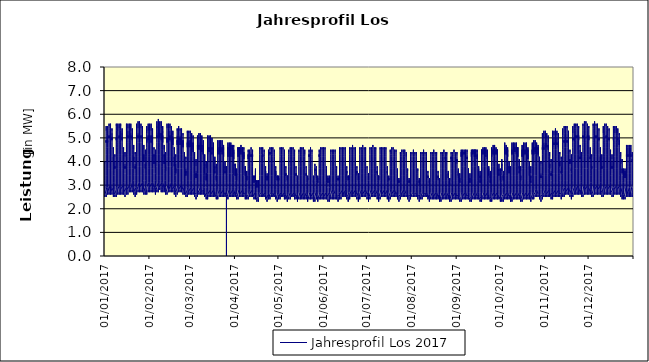
| Category | Jahresprofil Los 2017 |
|---|---|
| 01/01/2017 | 2.9 |
| 01/01/2017 | 2.8 |
| 01/01/2017 | 2.7 |
| 01/01/2017 | 2.6 |
| 01/01/2017 | 2.6 |
| 01/01/2017 | 2.5 |
| 01/01/2017 | 2.5 |
| 01/01/2017 | 2.6 |
| 01/01/2017 | 2.6 |
| 01/01/2017 | 2.8 |
| 01/01/2017 | 2.9 |
| 01/01/2017 | 3.2 |
| 01/01/2017 | 3.3 |
| 01/01/2017 | 3.3 |
| 01/01/2017 | 3.3 |
| 01/01/2017 | 3.3 |
| 01/01/2017 | 3.7 |
| 01/01/2017 | 3.9 |
| 01/01/2017 | 4 |
| 01/01/2017 | 3.9 |
| 01/01/2017 | 3.6 |
| 01/01/2017 | 3.4 |
| 01/01/2017 | 3.2 |
| 01/01/2017 | 3 |
| 02/01/2017 | 2.8 |
| 02/01/2017 | 2.6 |
| 02/01/2017 | 2.5 |
| 02/01/2017 | 2.5 |
| 02/01/2017 | 2.6 |
| 02/01/2017 | 2.8 |
| 02/01/2017 | 3.4 |
| 02/01/2017 | 3.9 |
| 02/01/2017 | 4.3 |
| 02/01/2017 | 4.6 |
| 02/01/2017 | 4.8 |
| 02/01/2017 | 4.8 |
| 02/01/2017 | 4.9 |
| 02/01/2017 | 4.8 |
| 02/01/2017 | 4.8 |
| 02/01/2017 | 4.9 |
| 02/01/2017 | 5.2 |
| 02/01/2017 | 5.5 |
| 02/01/2017 | 5.3 |
| 02/01/2017 | 5.1 |
| 02/01/2017 | 4.5 |
| 02/01/2017 | 4 |
| 02/01/2017 | 3.6 |
| 02/01/2017 | 3.3 |
| 03/01/2017 | 2.9 |
| 03/01/2017 | 2.7 |
| 03/01/2017 | 2.6 |
| 03/01/2017 | 2.6 |
| 03/01/2017 | 2.7 |
| 03/01/2017 | 2.9 |
| 03/01/2017 | 3.4 |
| 03/01/2017 | 4 |
| 03/01/2017 | 4.4 |
| 03/01/2017 | 4.6 |
| 03/01/2017 | 4.8 |
| 03/01/2017 | 4.9 |
| 03/01/2017 | 4.9 |
| 03/01/2017 | 4.9 |
| 03/01/2017 | 4.8 |
| 03/01/2017 | 4.9 |
| 03/01/2017 | 5.3 |
| 03/01/2017 | 5.5 |
| 03/01/2017 | 5.4 |
| 03/01/2017 | 5.2 |
| 03/01/2017 | 4.6 |
| 03/01/2017 | 4 |
| 03/01/2017 | 3.7 |
| 03/01/2017 | 3.3 |
| 04/01/2017 | 3 |
| 04/01/2017 | 2.7 |
| 04/01/2017 | 2.6 |
| 04/01/2017 | 2.6 |
| 04/01/2017 | 2.7 |
| 04/01/2017 | 3 |
| 04/01/2017 | 3.6 |
| 04/01/2017 | 4.3 |
| 04/01/2017 | 4.6 |
| 04/01/2017 | 4.8 |
| 04/01/2017 | 4.9 |
| 04/01/2017 | 5 |
| 04/01/2017 | 5.1 |
| 04/01/2017 | 5 |
| 04/01/2017 | 5 |
| 04/01/2017 | 5.1 |
| 04/01/2017 | 5.4 |
| 04/01/2017 | 5.6 |
| 04/01/2017 | 5.5 |
| 04/01/2017 | 5.3 |
| 04/01/2017 | 4.7 |
| 04/01/2017 | 4.1 |
| 04/01/2017 | 3.7 |
| 04/01/2017 | 3.3 |
| 05/01/2017 | 3 |
| 05/01/2017 | 2.7 |
| 05/01/2017 | 2.6 |
| 05/01/2017 | 2.6 |
| 05/01/2017 | 2.7 |
| 05/01/2017 | 3 |
| 05/01/2017 | 3.6 |
| 05/01/2017 | 4.2 |
| 05/01/2017 | 4.6 |
| 05/01/2017 | 4.8 |
| 05/01/2017 | 4.9 |
| 05/01/2017 | 5 |
| 05/01/2017 | 5 |
| 05/01/2017 | 5 |
| 05/01/2017 | 5 |
| 05/01/2017 | 5 |
| 05/01/2017 | 5.4 |
| 05/01/2017 | 5.6 |
| 05/01/2017 | 5.5 |
| 05/01/2017 | 5.3 |
| 05/01/2017 | 4.7 |
| 05/01/2017 | 4.1 |
| 05/01/2017 | 3.7 |
| 05/01/2017 | 3.3 |
| 06/01/2017 | 3 |
| 06/01/2017 | 2.7 |
| 06/01/2017 | 2.6 |
| 06/01/2017 | 2.6 |
| 06/01/2017 | 2.7 |
| 06/01/2017 | 3 |
| 06/01/2017 | 3.6 |
| 06/01/2017 | 4.2 |
| 06/01/2017 | 4.6 |
| 06/01/2017 | 4.8 |
| 06/01/2017 | 4.9 |
| 06/01/2017 | 5 |
| 06/01/2017 | 5 |
| 06/01/2017 | 4.9 |
| 06/01/2017 | 4.9 |
| 06/01/2017 | 4.9 |
| 06/01/2017 | 5.2 |
| 06/01/2017 | 5.4 |
| 06/01/2017 | 5.3 |
| 06/01/2017 | 5.1 |
| 06/01/2017 | 4.5 |
| 06/01/2017 | 4 |
| 06/01/2017 | 3.6 |
| 06/01/2017 | 3.3 |
| 07/01/2017 | 2.9 |
| 07/01/2017 | 2.7 |
| 07/01/2017 | 2.6 |
| 07/01/2017 | 2.6 |
| 07/01/2017 | 2.5 |
| 07/01/2017 | 2.6 |
| 07/01/2017 | 2.8 |
| 07/01/2017 | 3.1 |
| 07/01/2017 | 3.4 |
| 07/01/2017 | 3.8 |
| 07/01/2017 | 4 |
| 07/01/2017 | 4.2 |
| 07/01/2017 | 4.2 |
| 07/01/2017 | 4.1 |
| 07/01/2017 | 4 |
| 07/01/2017 | 4.1 |
| 07/01/2017 | 4.3 |
| 07/01/2017 | 4.6 |
| 07/01/2017 | 4.6 |
| 07/01/2017 | 4.5 |
| 07/01/2017 | 4 |
| 07/01/2017 | 3.6 |
| 07/01/2017 | 3.4 |
| 07/01/2017 | 3.1 |
| 08/01/2017 | 2.8 |
| 08/01/2017 | 2.6 |
| 08/01/2017 | 2.5 |
| 08/01/2017 | 2.5 |
| 08/01/2017 | 2.5 |
| 08/01/2017 | 2.5 |
| 08/01/2017 | 2.6 |
| 08/01/2017 | 2.8 |
| 08/01/2017 | 3 |
| 08/01/2017 | 3.3 |
| 08/01/2017 | 3.5 |
| 08/01/2017 | 3.7 |
| 08/01/2017 | 3.8 |
| 08/01/2017 | 3.7 |
| 08/01/2017 | 3.7 |
| 08/01/2017 | 3.7 |
| 08/01/2017 | 4 |
| 08/01/2017 | 4.3 |
| 08/01/2017 | 4.3 |
| 08/01/2017 | 4.2 |
| 08/01/2017 | 3.9 |
| 08/01/2017 | 3.6 |
| 08/01/2017 | 3.4 |
| 08/01/2017 | 3.1 |
| 09/01/2017 | 2.8 |
| 09/01/2017 | 2.6 |
| 09/01/2017 | 2.6 |
| 09/01/2017 | 2.5 |
| 09/01/2017 | 2.6 |
| 09/01/2017 | 2.9 |
| 09/01/2017 | 3.6 |
| 09/01/2017 | 4.2 |
| 09/01/2017 | 4.6 |
| 09/01/2017 | 4.7 |
| 09/01/2017 | 4.9 |
| 09/01/2017 | 5 |
| 09/01/2017 | 5 |
| 09/01/2017 | 5 |
| 09/01/2017 | 4.9 |
| 09/01/2017 | 5 |
| 09/01/2017 | 5.3 |
| 09/01/2017 | 5.6 |
| 09/01/2017 | 5.5 |
| 09/01/2017 | 5.3 |
| 09/01/2017 | 4.7 |
| 09/01/2017 | 4.1 |
| 09/01/2017 | 3.7 |
| 09/01/2017 | 3.3 |
| 10/01/2017 | 3 |
| 10/01/2017 | 2.7 |
| 10/01/2017 | 2.6 |
| 10/01/2017 | 2.6 |
| 10/01/2017 | 2.7 |
| 10/01/2017 | 3 |
| 10/01/2017 | 3.6 |
| 10/01/2017 | 4.3 |
| 10/01/2017 | 4.6 |
| 10/01/2017 | 4.8 |
| 10/01/2017 | 4.9 |
| 10/01/2017 | 5 |
| 10/01/2017 | 5 |
| 10/01/2017 | 5 |
| 10/01/2017 | 5 |
| 10/01/2017 | 5 |
| 10/01/2017 | 5.4 |
| 10/01/2017 | 5.6 |
| 10/01/2017 | 5.6 |
| 10/01/2017 | 5.3 |
| 10/01/2017 | 4.7 |
| 10/01/2017 | 4.2 |
| 10/01/2017 | 3.7 |
| 10/01/2017 | 3.3 |
| 11/01/2017 | 3 |
| 11/01/2017 | 2.8 |
| 11/01/2017 | 2.7 |
| 11/01/2017 | 2.6 |
| 11/01/2017 | 2.7 |
| 11/01/2017 | 3 |
| 11/01/2017 | 3.7 |
| 11/01/2017 | 4.3 |
| 11/01/2017 | 4.7 |
| 11/01/2017 | 4.9 |
| 11/01/2017 | 5 |
| 11/01/2017 | 5.1 |
| 11/01/2017 | 5.1 |
| 11/01/2017 | 5 |
| 11/01/2017 | 5 |
| 11/01/2017 | 5.1 |
| 11/01/2017 | 5.3 |
| 11/01/2017 | 5.6 |
| 11/01/2017 | 5.6 |
| 11/01/2017 | 5.4 |
| 11/01/2017 | 4.7 |
| 11/01/2017 | 4.2 |
| 11/01/2017 | 3.8 |
| 11/01/2017 | 3.3 |
| 12/01/2017 | 3 |
| 12/01/2017 | 2.8 |
| 12/01/2017 | 2.7 |
| 12/01/2017 | 2.6 |
| 12/01/2017 | 2.7 |
| 12/01/2017 | 3 |
| 12/01/2017 | 3.6 |
| 12/01/2017 | 4.3 |
| 12/01/2017 | 4.7 |
| 12/01/2017 | 4.8 |
| 12/01/2017 | 5 |
| 12/01/2017 | 5 |
| 12/01/2017 | 5.1 |
| 12/01/2017 | 5 |
| 12/01/2017 | 5 |
| 12/01/2017 | 5 |
| 12/01/2017 | 5.3 |
| 12/01/2017 | 5.6 |
| 12/01/2017 | 5.5 |
| 12/01/2017 | 5.3 |
| 12/01/2017 | 4.7 |
| 12/01/2017 | 4.2 |
| 12/01/2017 | 3.8 |
| 12/01/2017 | 3.3 |
| 13/01/2017 | 3 |
| 13/01/2017 | 2.8 |
| 13/01/2017 | 2.7 |
| 13/01/2017 | 2.6 |
| 13/01/2017 | 2.7 |
| 13/01/2017 | 3 |
| 13/01/2017 | 3.6 |
| 13/01/2017 | 4.3 |
| 13/01/2017 | 4.6 |
| 13/01/2017 | 4.8 |
| 13/01/2017 | 5 |
| 13/01/2017 | 5 |
| 13/01/2017 | 5 |
| 13/01/2017 | 4.9 |
| 13/01/2017 | 4.9 |
| 13/01/2017 | 4.9 |
| 13/01/2017 | 5.2 |
| 13/01/2017 | 5.4 |
| 13/01/2017 | 5.4 |
| 13/01/2017 | 5.1 |
| 13/01/2017 | 4.5 |
| 13/01/2017 | 4 |
| 13/01/2017 | 3.7 |
| 13/01/2017 | 3.3 |
| 14/01/2017 | 3 |
| 14/01/2017 | 2.8 |
| 14/01/2017 | 2.7 |
| 14/01/2017 | 2.6 |
| 14/01/2017 | 2.6 |
| 14/01/2017 | 2.6 |
| 14/01/2017 | 2.8 |
| 14/01/2017 | 3.1 |
| 14/01/2017 | 3.5 |
| 14/01/2017 | 3.8 |
| 14/01/2017 | 4.1 |
| 14/01/2017 | 4.2 |
| 14/01/2017 | 4.2 |
| 14/01/2017 | 4.1 |
| 14/01/2017 | 4 |
| 14/01/2017 | 4 |
| 14/01/2017 | 4.3 |
| 14/01/2017 | 4.6 |
| 14/01/2017 | 4.6 |
| 14/01/2017 | 4.5 |
| 14/01/2017 | 4.1 |
| 14/01/2017 | 3.7 |
| 14/01/2017 | 3.4 |
| 14/01/2017 | 3.1 |
| 15/01/2017 | 2.9 |
| 15/01/2017 | 2.7 |
| 15/01/2017 | 2.6 |
| 15/01/2017 | 2.5 |
| 15/01/2017 | 2.5 |
| 15/01/2017 | 2.5 |
| 15/01/2017 | 2.6 |
| 15/01/2017 | 2.8 |
| 15/01/2017 | 3.1 |
| 15/01/2017 | 3.3 |
| 15/01/2017 | 3.5 |
| 15/01/2017 | 3.7 |
| 15/01/2017 | 3.8 |
| 15/01/2017 | 3.7 |
| 15/01/2017 | 3.7 |
| 15/01/2017 | 3.7 |
| 15/01/2017 | 3.9 |
| 15/01/2017 | 4.3 |
| 15/01/2017 | 4.4 |
| 15/01/2017 | 4.2 |
| 15/01/2017 | 3.9 |
| 15/01/2017 | 3.6 |
| 15/01/2017 | 3.5 |
| 15/01/2017 | 3.2 |
| 16/01/2017 | 2.9 |
| 16/01/2017 | 2.7 |
| 16/01/2017 | 2.6 |
| 16/01/2017 | 2.6 |
| 16/01/2017 | 2.7 |
| 16/01/2017 | 3 |
| 16/01/2017 | 3.6 |
| 16/01/2017 | 4.3 |
| 16/01/2017 | 4.6 |
| 16/01/2017 | 4.8 |
| 16/01/2017 | 4.9 |
| 16/01/2017 | 5 |
| 16/01/2017 | 5 |
| 16/01/2017 | 5 |
| 16/01/2017 | 5 |
| 16/01/2017 | 5 |
| 16/01/2017 | 5.2 |
| 16/01/2017 | 5.6 |
| 16/01/2017 | 5.6 |
| 16/01/2017 | 5.3 |
| 16/01/2017 | 4.7 |
| 16/01/2017 | 4.2 |
| 16/01/2017 | 3.8 |
| 16/01/2017 | 3.3 |
| 17/01/2017 | 3 |
| 17/01/2017 | 2.8 |
| 17/01/2017 | 2.7 |
| 17/01/2017 | 2.6 |
| 17/01/2017 | 2.7 |
| 17/01/2017 | 3 |
| 17/01/2017 | 3.7 |
| 17/01/2017 | 4.3 |
| 17/01/2017 | 4.7 |
| 17/01/2017 | 4.9 |
| 17/01/2017 | 5 |
| 17/01/2017 | 5.1 |
| 17/01/2017 | 5.1 |
| 17/01/2017 | 5 |
| 17/01/2017 | 5 |
| 17/01/2017 | 5 |
| 17/01/2017 | 5.3 |
| 17/01/2017 | 5.6 |
| 17/01/2017 | 5.6 |
| 17/01/2017 | 5.4 |
| 17/01/2017 | 4.8 |
| 17/01/2017 | 4.2 |
| 17/01/2017 | 3.8 |
| 17/01/2017 | 3.4 |
| 18/01/2017 | 3 |
| 18/01/2017 | 2.8 |
| 18/01/2017 | 2.7 |
| 18/01/2017 | 2.7 |
| 18/01/2017 | 2.8 |
| 18/01/2017 | 3.1 |
| 18/01/2017 | 3.7 |
| 18/01/2017 | 4.4 |
| 18/01/2017 | 4.7 |
| 18/01/2017 | 4.9 |
| 18/01/2017 | 5 |
| 18/01/2017 | 5.1 |
| 18/01/2017 | 5.1 |
| 18/01/2017 | 5.1 |
| 18/01/2017 | 5 |
| 18/01/2017 | 5 |
| 18/01/2017 | 5.3 |
| 18/01/2017 | 5.6 |
| 18/01/2017 | 5.6 |
| 18/01/2017 | 5.4 |
| 18/01/2017 | 4.8 |
| 18/01/2017 | 4.2 |
| 18/01/2017 | 3.8 |
| 18/01/2017 | 3.4 |
| 19/01/2017 | 3 |
| 19/01/2017 | 2.8 |
| 19/01/2017 | 2.7 |
| 19/01/2017 | 2.7 |
| 19/01/2017 | 2.8 |
| 19/01/2017 | 3.1 |
| 19/01/2017 | 3.7 |
| 19/01/2017 | 4.4 |
| 19/01/2017 | 4.7 |
| 19/01/2017 | 4.9 |
| 19/01/2017 | 5 |
| 19/01/2017 | 5.1 |
| 19/01/2017 | 5.1 |
| 19/01/2017 | 5 |
| 19/01/2017 | 5 |
| 19/01/2017 | 5 |
| 19/01/2017 | 5.2 |
| 19/01/2017 | 5.6 |
| 19/01/2017 | 5.6 |
| 19/01/2017 | 5.3 |
| 19/01/2017 | 4.7 |
| 19/01/2017 | 4.2 |
| 19/01/2017 | 3.8 |
| 19/01/2017 | 3.4 |
| 20/01/2017 | 3.1 |
| 20/01/2017 | 2.8 |
| 20/01/2017 | 2.7 |
| 20/01/2017 | 2.7 |
| 20/01/2017 | 2.8 |
| 20/01/2017 | 3 |
| 20/01/2017 | 3.7 |
| 20/01/2017 | 4.3 |
| 20/01/2017 | 4.7 |
| 20/01/2017 | 4.9 |
| 20/01/2017 | 5 |
| 20/01/2017 | 5.1 |
| 20/01/2017 | 5.1 |
| 20/01/2017 | 5 |
| 20/01/2017 | 4.9 |
| 20/01/2017 | 4.9 |
| 20/01/2017 | 5.1 |
| 20/01/2017 | 5.4 |
| 20/01/2017 | 5.4 |
| 20/01/2017 | 5.1 |
| 20/01/2017 | 4.5 |
| 20/01/2017 | 4 |
| 20/01/2017 | 3.7 |
| 20/01/2017 | 3.3 |
| 21/01/2017 | 3 |
| 21/01/2017 | 2.8 |
| 21/01/2017 | 2.7 |
| 21/01/2017 | 2.6 |
| 21/01/2017 | 2.6 |
| 21/01/2017 | 2.7 |
| 21/01/2017 | 2.9 |
| 21/01/2017 | 3.2 |
| 21/01/2017 | 3.5 |
| 21/01/2017 | 3.9 |
| 21/01/2017 | 4.1 |
| 21/01/2017 | 4.2 |
| 21/01/2017 | 4.2 |
| 21/01/2017 | 4.1 |
| 21/01/2017 | 4 |
| 21/01/2017 | 4 |
| 21/01/2017 | 4.2 |
| 21/01/2017 | 4.6 |
| 21/01/2017 | 4.7 |
| 21/01/2017 | 4.5 |
| 21/01/2017 | 4.1 |
| 21/01/2017 | 3.7 |
| 21/01/2017 | 3.4 |
| 21/01/2017 | 3.2 |
| 22/01/2017 | 2.9 |
| 22/01/2017 | 2.7 |
| 22/01/2017 | 2.6 |
| 22/01/2017 | 2.6 |
| 22/01/2017 | 2.5 |
| 22/01/2017 | 2.5 |
| 22/01/2017 | 2.7 |
| 22/01/2017 | 2.9 |
| 22/01/2017 | 3.1 |
| 22/01/2017 | 3.4 |
| 22/01/2017 | 3.6 |
| 22/01/2017 | 3.8 |
| 22/01/2017 | 3.8 |
| 22/01/2017 | 3.7 |
| 22/01/2017 | 3.7 |
| 22/01/2017 | 3.7 |
| 22/01/2017 | 3.9 |
| 22/01/2017 | 4.2 |
| 22/01/2017 | 4.4 |
| 22/01/2017 | 4.3 |
| 22/01/2017 | 3.9 |
| 22/01/2017 | 3.7 |
| 22/01/2017 | 3.5 |
| 22/01/2017 | 3.2 |
| 23/01/2017 | 2.9 |
| 23/01/2017 | 2.7 |
| 23/01/2017 | 2.6 |
| 23/01/2017 | 2.6 |
| 23/01/2017 | 2.7 |
| 23/01/2017 | 3 |
| 23/01/2017 | 3.7 |
| 23/01/2017 | 4.3 |
| 23/01/2017 | 4.7 |
| 23/01/2017 | 4.9 |
| 23/01/2017 | 5 |
| 23/01/2017 | 5.1 |
| 23/01/2017 | 5.1 |
| 23/01/2017 | 5 |
| 23/01/2017 | 5 |
| 23/01/2017 | 5 |
| 23/01/2017 | 5.1 |
| 23/01/2017 | 5.5 |
| 23/01/2017 | 5.6 |
| 23/01/2017 | 5.4 |
| 23/01/2017 | 4.7 |
| 23/01/2017 | 4.2 |
| 23/01/2017 | 3.8 |
| 23/01/2017 | 3.4 |
| 24/01/2017 | 3 |
| 24/01/2017 | 2.8 |
| 24/01/2017 | 2.7 |
| 24/01/2017 | 2.7 |
| 24/01/2017 | 2.8 |
| 24/01/2017 | 3.1 |
| 24/01/2017 | 3.8 |
| 24/01/2017 | 4.4 |
| 24/01/2017 | 4.8 |
| 24/01/2017 | 4.9 |
| 24/01/2017 | 5.1 |
| 24/01/2017 | 5.1 |
| 24/01/2017 | 5.1 |
| 24/01/2017 | 5 |
| 24/01/2017 | 5 |
| 24/01/2017 | 5 |
| 24/01/2017 | 5.2 |
| 24/01/2017 | 5.6 |
| 24/01/2017 | 5.7 |
| 24/01/2017 | 5.4 |
| 24/01/2017 | 4.8 |
| 24/01/2017 | 4.2 |
| 24/01/2017 | 3.8 |
| 24/01/2017 | 3.4 |
| 25/01/2017 | 3.1 |
| 25/01/2017 | 2.8 |
| 25/01/2017 | 2.7 |
| 25/01/2017 | 2.7 |
| 25/01/2017 | 2.8 |
| 25/01/2017 | 3.1 |
| 25/01/2017 | 3.8 |
| 25/01/2017 | 4.5 |
| 25/01/2017 | 4.8 |
| 25/01/2017 | 5 |
| 25/01/2017 | 5.1 |
| 25/01/2017 | 5.2 |
| 25/01/2017 | 5.2 |
| 25/01/2017 | 5.1 |
| 25/01/2017 | 5 |
| 25/01/2017 | 5 |
| 25/01/2017 | 5.2 |
| 25/01/2017 | 5.6 |
| 25/01/2017 | 5.7 |
| 25/01/2017 | 5.4 |
| 25/01/2017 | 4.8 |
| 25/01/2017 | 4.2 |
| 25/01/2017 | 3.8 |
| 25/01/2017 | 3.4 |
| 26/01/2017 | 3.1 |
| 26/01/2017 | 2.9 |
| 26/01/2017 | 2.7 |
| 26/01/2017 | 2.7 |
| 26/01/2017 | 2.8 |
| 26/01/2017 | 3.1 |
| 26/01/2017 | 3.8 |
| 26/01/2017 | 4.4 |
| 26/01/2017 | 4.8 |
| 26/01/2017 | 5 |
| 26/01/2017 | 5.1 |
| 26/01/2017 | 5.1 |
| 26/01/2017 | 5.1 |
| 26/01/2017 | 5 |
| 26/01/2017 | 5 |
| 26/01/2017 | 5 |
| 26/01/2017 | 5.1 |
| 26/01/2017 | 5.5 |
| 26/01/2017 | 5.6 |
| 26/01/2017 | 5.4 |
| 26/01/2017 | 4.8 |
| 26/01/2017 | 4.2 |
| 26/01/2017 | 3.8 |
| 26/01/2017 | 3.4 |
| 27/01/2017 | 3.1 |
| 27/01/2017 | 2.9 |
| 27/01/2017 | 2.7 |
| 27/01/2017 | 2.7 |
| 27/01/2017 | 2.8 |
| 27/01/2017 | 3.1 |
| 27/01/2017 | 3.8 |
| 27/01/2017 | 4.4 |
| 27/01/2017 | 4.8 |
| 27/01/2017 | 5 |
| 27/01/2017 | 5.1 |
| 27/01/2017 | 5.1 |
| 27/01/2017 | 5.1 |
| 27/01/2017 | 5 |
| 27/01/2017 | 4.9 |
| 27/01/2017 | 4.9 |
| 27/01/2017 | 5 |
| 27/01/2017 | 5.4 |
| 27/01/2017 | 5.5 |
| 27/01/2017 | 5.2 |
| 27/01/2017 | 4.6 |
| 27/01/2017 | 4.1 |
| 27/01/2017 | 3.7 |
| 27/01/2017 | 3.4 |
| 28/01/2017 | 3.1 |
| 28/01/2017 | 2.8 |
| 28/01/2017 | 2.7 |
| 28/01/2017 | 2.7 |
| 28/01/2017 | 2.6 |
| 28/01/2017 | 2.7 |
| 28/01/2017 | 2.9 |
| 28/01/2017 | 3.2 |
| 28/01/2017 | 3.6 |
| 28/01/2017 | 3.9 |
| 28/01/2017 | 4.2 |
| 28/01/2017 | 4.3 |
| 28/01/2017 | 4.3 |
| 28/01/2017 | 4.1 |
| 28/01/2017 | 4 |
| 28/01/2017 | 4 |
| 28/01/2017 | 4.1 |
| 28/01/2017 | 4.6 |
| 28/01/2017 | 4.7 |
| 28/01/2017 | 4.5 |
| 28/01/2017 | 4.1 |
| 28/01/2017 | 3.7 |
| 28/01/2017 | 3.5 |
| 28/01/2017 | 3.2 |
| 29/01/2017 | 2.9 |
| 29/01/2017 | 2.7 |
| 29/01/2017 | 2.6 |
| 29/01/2017 | 2.6 |
| 29/01/2017 | 2.6 |
| 29/01/2017 | 2.6 |
| 29/01/2017 | 2.7 |
| 29/01/2017 | 2.9 |
| 29/01/2017 | 3.2 |
| 29/01/2017 | 3.4 |
| 29/01/2017 | 3.6 |
| 29/01/2017 | 3.8 |
| 29/01/2017 | 3.9 |
| 29/01/2017 | 3.8 |
| 29/01/2017 | 3.7 |
| 29/01/2017 | 3.7 |
| 29/01/2017 | 3.8 |
| 29/01/2017 | 4.2 |
| 29/01/2017 | 4.5 |
| 29/01/2017 | 4.3 |
| 29/01/2017 | 4 |
| 29/01/2017 | 3.7 |
| 29/01/2017 | 3.5 |
| 29/01/2017 | 3.2 |
| 30/01/2017 | 3 |
| 30/01/2017 | 2.7 |
| 30/01/2017 | 2.6 |
| 30/01/2017 | 2.6 |
| 30/01/2017 | 2.7 |
| 30/01/2017 | 3 |
| 30/01/2017 | 3.6 |
| 30/01/2017 | 4.2 |
| 30/01/2017 | 4.6 |
| 30/01/2017 | 4.8 |
| 30/01/2017 | 5 |
| 30/01/2017 | 5 |
| 30/01/2017 | 5 |
| 30/01/2017 | 4.9 |
| 30/01/2017 | 4.9 |
| 30/01/2017 | 4.8 |
| 30/01/2017 | 4.9 |
| 30/01/2017 | 5.4 |
| 30/01/2017 | 5.5 |
| 30/01/2017 | 5.2 |
| 30/01/2017 | 4.6 |
| 30/01/2017 | 4.1 |
| 30/01/2017 | 3.8 |
| 30/01/2017 | 3.4 |
| 31/01/2017 | 3.1 |
| 31/01/2017 | 2.9 |
| 31/01/2017 | 2.7 |
| 31/01/2017 | 2.7 |
| 31/01/2017 | 2.8 |
| 31/01/2017 | 3.1 |
| 31/01/2017 | 3.7 |
| 31/01/2017 | 4.3 |
| 31/01/2017 | 4.7 |
| 31/01/2017 | 4.9 |
| 31/01/2017 | 5 |
| 31/01/2017 | 5.1 |
| 31/01/2017 | 5 |
| 31/01/2017 | 5 |
| 31/01/2017 | 4.9 |
| 31/01/2017 | 4.9 |
| 31/01/2017 | 5 |
| 31/01/2017 | 5.5 |
| 31/01/2017 | 5.6 |
| 31/01/2017 | 5.3 |
| 31/01/2017 | 4.7 |
| 31/01/2017 | 4.2 |
| 31/01/2017 | 3.8 |
| 31/01/2017 | 3.4 |
| 01/02/2017 | 3.1 |
| 01/02/2017 | 2.9 |
| 01/02/2017 | 2.8 |
| 01/02/2017 | 2.7 |
| 01/02/2017 | 2.8 |
| 01/02/2017 | 3.1 |
| 01/02/2017 | 3.7 |
| 01/02/2017 | 4.3 |
| 01/02/2017 | 4.7 |
| 01/02/2017 | 4.9 |
| 01/02/2017 | 5.1 |
| 01/02/2017 | 5.1 |
| 01/02/2017 | 5.1 |
| 01/02/2017 | 5 |
| 01/02/2017 | 4.9 |
| 01/02/2017 | 4.9 |
| 01/02/2017 | 5 |
| 01/02/2017 | 5.5 |
| 01/02/2017 | 5.6 |
| 01/02/2017 | 5.3 |
| 01/02/2017 | 4.7 |
| 01/02/2017 | 4.2 |
| 01/02/2017 | 3.8 |
| 01/02/2017 | 3.4 |
| 02/02/2017 | 3.1 |
| 02/02/2017 | 2.9 |
| 02/02/2017 | 2.8 |
| 02/02/2017 | 2.7 |
| 02/02/2017 | 2.8 |
| 02/02/2017 | 3.1 |
| 02/02/2017 | 3.7 |
| 02/02/2017 | 4.3 |
| 02/02/2017 | 4.7 |
| 02/02/2017 | 4.9 |
| 02/02/2017 | 5.1 |
| 02/02/2017 | 5.1 |
| 02/02/2017 | 5.1 |
| 02/02/2017 | 5 |
| 02/02/2017 | 4.9 |
| 02/02/2017 | 4.8 |
| 02/02/2017 | 4.9 |
| 02/02/2017 | 5.4 |
| 02/02/2017 | 5.6 |
| 02/02/2017 | 5.3 |
| 02/02/2017 | 4.7 |
| 02/02/2017 | 4.2 |
| 02/02/2017 | 3.8 |
| 02/02/2017 | 3.4 |
| 03/02/2017 | 3.1 |
| 03/02/2017 | 2.9 |
| 03/02/2017 | 2.8 |
| 03/02/2017 | 2.7 |
| 03/02/2017 | 2.8 |
| 03/02/2017 | 3.1 |
| 03/02/2017 | 3.7 |
| 03/02/2017 | 4.3 |
| 03/02/2017 | 4.7 |
| 03/02/2017 | 4.9 |
| 03/02/2017 | 5.1 |
| 03/02/2017 | 5.1 |
| 03/02/2017 | 5.1 |
| 03/02/2017 | 4.9 |
| 03/02/2017 | 4.8 |
| 03/02/2017 | 4.7 |
| 03/02/2017 | 4.8 |
| 03/02/2017 | 5.3 |
| 03/02/2017 | 5.4 |
| 03/02/2017 | 5.1 |
| 03/02/2017 | 4.5 |
| 03/02/2017 | 4 |
| 03/02/2017 | 3.7 |
| 03/02/2017 | 3.4 |
| 04/02/2017 | 3.1 |
| 04/02/2017 | 2.9 |
| 04/02/2017 | 2.8 |
| 04/02/2017 | 2.7 |
| 04/02/2017 | 2.7 |
| 04/02/2017 | 2.7 |
| 04/02/2017 | 2.9 |
| 04/02/2017 | 3.1 |
| 04/02/2017 | 3.5 |
| 04/02/2017 | 3.9 |
| 04/02/2017 | 4.2 |
| 04/02/2017 | 4.3 |
| 04/02/2017 | 4.2 |
| 04/02/2017 | 4.1 |
| 04/02/2017 | 3.9 |
| 04/02/2017 | 3.9 |
| 04/02/2017 | 4 |
| 04/02/2017 | 4.4 |
| 04/02/2017 | 4.6 |
| 04/02/2017 | 4.5 |
| 04/02/2017 | 4 |
| 04/02/2017 | 3.7 |
| 04/02/2017 | 3.5 |
| 04/02/2017 | 3.2 |
| 05/02/2017 | 3 |
| 05/02/2017 | 2.8 |
| 05/02/2017 | 2.7 |
| 05/02/2017 | 2.6 |
| 05/02/2017 | 2.6 |
| 05/02/2017 | 2.6 |
| 05/02/2017 | 2.7 |
| 05/02/2017 | 2.9 |
| 05/02/2017 | 3.2 |
| 05/02/2017 | 3.5 |
| 05/02/2017 | 3.7 |
| 05/02/2017 | 3.8 |
| 05/02/2017 | 3.9 |
| 05/02/2017 | 3.8 |
| 05/02/2017 | 3.7 |
| 05/02/2017 | 3.7 |
| 05/02/2017 | 3.7 |
| 05/02/2017 | 4.2 |
| 05/02/2017 | 4.5 |
| 05/02/2017 | 4.3 |
| 05/02/2017 | 4 |
| 05/02/2017 | 3.7 |
| 05/02/2017 | 3.5 |
| 05/02/2017 | 3.2 |
| 06/02/2017 | 3 |
| 06/02/2017 | 2.8 |
| 06/02/2017 | 2.7 |
| 06/02/2017 | 2.7 |
| 06/02/2017 | 2.8 |
| 06/02/2017 | 3.1 |
| 06/02/2017 | 3.8 |
| 06/02/2017 | 4.5 |
| 06/02/2017 | 4.8 |
| 06/02/2017 | 5 |
| 06/02/2017 | 5.1 |
| 06/02/2017 | 5.1 |
| 06/02/2017 | 5.1 |
| 06/02/2017 | 5 |
| 06/02/2017 | 5 |
| 06/02/2017 | 5 |
| 06/02/2017 | 5 |
| 06/02/2017 | 5.5 |
| 06/02/2017 | 5.7 |
| 06/02/2017 | 5.4 |
| 06/02/2017 | 4.8 |
| 06/02/2017 | 4.3 |
| 06/02/2017 | 3.8 |
| 06/02/2017 | 3.4 |
| 07/02/2017 | 3.1 |
| 07/02/2017 | 2.9 |
| 07/02/2017 | 2.8 |
| 07/02/2017 | 2.7 |
| 07/02/2017 | 2.9 |
| 07/02/2017 | 3.2 |
| 07/02/2017 | 3.9 |
| 07/02/2017 | 4.5 |
| 07/02/2017 | 4.9 |
| 07/02/2017 | 5.1 |
| 07/02/2017 | 5.1 |
| 07/02/2017 | 5.2 |
| 07/02/2017 | 5.2 |
| 07/02/2017 | 5.1 |
| 07/02/2017 | 5 |
| 07/02/2017 | 5 |
| 07/02/2017 | 5 |
| 07/02/2017 | 5.6 |
| 07/02/2017 | 5.8 |
| 07/02/2017 | 5.5 |
| 07/02/2017 | 4.8 |
| 07/02/2017 | 4.3 |
| 07/02/2017 | 3.9 |
| 07/02/2017 | 3.4 |
| 08/02/2017 | 3.1 |
| 08/02/2017 | 2.9 |
| 08/02/2017 | 2.8 |
| 08/02/2017 | 2.8 |
| 08/02/2017 | 2.9 |
| 08/02/2017 | 3.2 |
| 08/02/2017 | 3.9 |
| 08/02/2017 | 4.6 |
| 08/02/2017 | 4.9 |
| 08/02/2017 | 5.1 |
| 08/02/2017 | 5.2 |
| 08/02/2017 | 5.2 |
| 08/02/2017 | 5.2 |
| 08/02/2017 | 5.1 |
| 08/02/2017 | 5 |
| 08/02/2017 | 5 |
| 08/02/2017 | 5 |
| 08/02/2017 | 5.5 |
| 08/02/2017 | 5.7 |
| 08/02/2017 | 5.5 |
| 08/02/2017 | 4.8 |
| 08/02/2017 | 4.3 |
| 08/02/2017 | 3.9 |
| 08/02/2017 | 3.4 |
| 09/02/2017 | 3.1 |
| 09/02/2017 | 2.9 |
| 09/02/2017 | 2.8 |
| 09/02/2017 | 2.7 |
| 09/02/2017 | 2.8 |
| 09/02/2017 | 3.2 |
| 09/02/2017 | 3.9 |
| 09/02/2017 | 4.5 |
| 09/02/2017 | 4.9 |
| 09/02/2017 | 5 |
| 09/02/2017 | 5.1 |
| 09/02/2017 | 5.2 |
| 09/02/2017 | 5.1 |
| 09/02/2017 | 5 |
| 09/02/2017 | 5 |
| 09/02/2017 | 4.9 |
| 09/02/2017 | 5 |
| 09/02/2017 | 5.5 |
| 09/02/2017 | 5.7 |
| 09/02/2017 | 5.4 |
| 09/02/2017 | 4.8 |
| 09/02/2017 | 4.2 |
| 09/02/2017 | 3.8 |
| 09/02/2017 | 3.4 |
| 10/02/2017 | 3.1 |
| 10/02/2017 | 2.9 |
| 10/02/2017 | 2.8 |
| 10/02/2017 | 2.7 |
| 10/02/2017 | 2.8 |
| 10/02/2017 | 3.1 |
| 10/02/2017 | 3.8 |
| 10/02/2017 | 4.5 |
| 10/02/2017 | 4.8 |
| 10/02/2017 | 5 |
| 10/02/2017 | 5.1 |
| 10/02/2017 | 5.1 |
| 10/02/2017 | 5.1 |
| 10/02/2017 | 5 |
| 10/02/2017 | 4.9 |
| 10/02/2017 | 4.8 |
| 10/02/2017 | 4.8 |
| 10/02/2017 | 5.3 |
| 10/02/2017 | 5.5 |
| 10/02/2017 | 5.2 |
| 10/02/2017 | 4.6 |
| 10/02/2017 | 4.1 |
| 10/02/2017 | 3.7 |
| 10/02/2017 | 3.4 |
| 11/02/2017 | 3.1 |
| 11/02/2017 | 2.9 |
| 11/02/2017 | 2.7 |
| 11/02/2017 | 2.7 |
| 11/02/2017 | 2.7 |
| 11/02/2017 | 2.7 |
| 11/02/2017 | 3 |
| 11/02/2017 | 3.3 |
| 11/02/2017 | 3.6 |
| 11/02/2017 | 4 |
| 11/02/2017 | 4.2 |
| 11/02/2017 | 4.3 |
| 11/02/2017 | 4.2 |
| 11/02/2017 | 4.1 |
| 11/02/2017 | 4 |
| 11/02/2017 | 3.9 |
| 11/02/2017 | 4 |
| 11/02/2017 | 4.4 |
| 11/02/2017 | 4.7 |
| 11/02/2017 | 4.5 |
| 11/02/2017 | 4.1 |
| 11/02/2017 | 3.7 |
| 11/02/2017 | 3.5 |
| 11/02/2017 | 3.2 |
| 12/02/2017 | 2.9 |
| 12/02/2017 | 2.7 |
| 12/02/2017 | 2.6 |
| 12/02/2017 | 2.6 |
| 12/02/2017 | 2.6 |
| 12/02/2017 | 2.6 |
| 12/02/2017 | 2.7 |
| 12/02/2017 | 2.9 |
| 12/02/2017 | 3.2 |
| 12/02/2017 | 3.4 |
| 12/02/2017 | 3.6 |
| 12/02/2017 | 3.8 |
| 12/02/2017 | 3.8 |
| 12/02/2017 | 3.7 |
| 12/02/2017 | 3.6 |
| 12/02/2017 | 3.6 |
| 12/02/2017 | 3.6 |
| 12/02/2017 | 4.1 |
| 12/02/2017 | 4.4 |
| 12/02/2017 | 4.3 |
| 12/02/2017 | 3.9 |
| 12/02/2017 | 3.7 |
| 12/02/2017 | 3.5 |
| 12/02/2017 | 3.2 |
| 13/02/2017 | 2.9 |
| 13/02/2017 | 2.7 |
| 13/02/2017 | 2.6 |
| 13/02/2017 | 2.6 |
| 13/02/2017 | 2.7 |
| 13/02/2017 | 3 |
| 13/02/2017 | 3.8 |
| 13/02/2017 | 4.4 |
| 13/02/2017 | 4.7 |
| 13/02/2017 | 4.9 |
| 13/02/2017 | 5 |
| 13/02/2017 | 5 |
| 13/02/2017 | 5 |
| 13/02/2017 | 4.9 |
| 13/02/2017 | 4.9 |
| 13/02/2017 | 4.8 |
| 13/02/2017 | 4.9 |
| 13/02/2017 | 5.3 |
| 13/02/2017 | 5.6 |
| 13/02/2017 | 5.4 |
| 13/02/2017 | 4.7 |
| 13/02/2017 | 4.2 |
| 13/02/2017 | 3.8 |
| 13/02/2017 | 3.3 |
| 14/02/2017 | 3 |
| 14/02/2017 | 2.8 |
| 14/02/2017 | 2.7 |
| 14/02/2017 | 2.7 |
| 14/02/2017 | 2.8 |
| 14/02/2017 | 3.1 |
| 14/02/2017 | 3.8 |
| 14/02/2017 | 4.4 |
| 14/02/2017 | 4.8 |
| 14/02/2017 | 5 |
| 14/02/2017 | 5 |
| 14/02/2017 | 5.1 |
| 14/02/2017 | 5 |
| 14/02/2017 | 5 |
| 14/02/2017 | 4.9 |
| 14/02/2017 | 4.8 |
| 14/02/2017 | 4.9 |
| 14/02/2017 | 5.4 |
| 14/02/2017 | 5.6 |
| 14/02/2017 | 5.4 |
| 14/02/2017 | 4.8 |
| 14/02/2017 | 4.2 |
| 14/02/2017 | 3.8 |
| 14/02/2017 | 3.4 |
| 15/02/2017 | 3.1 |
| 15/02/2017 | 2.8 |
| 15/02/2017 | 2.7 |
| 15/02/2017 | 2.7 |
| 15/02/2017 | 2.8 |
| 15/02/2017 | 3.1 |
| 15/02/2017 | 3.8 |
| 15/02/2017 | 4.4 |
| 15/02/2017 | 4.8 |
| 15/02/2017 | 5 |
| 15/02/2017 | 5.1 |
| 15/02/2017 | 5.1 |
| 15/02/2017 | 5.1 |
| 15/02/2017 | 5 |
| 15/02/2017 | 4.9 |
| 15/02/2017 | 4.9 |
| 15/02/2017 | 4.9 |
| 15/02/2017 | 5.3 |
| 15/02/2017 | 5.6 |
| 15/02/2017 | 5.4 |
| 15/02/2017 | 4.8 |
| 15/02/2017 | 4.2 |
| 15/02/2017 | 3.8 |
| 15/02/2017 | 3.4 |
| 16/02/2017 | 3.1 |
| 16/02/2017 | 2.8 |
| 16/02/2017 | 2.7 |
| 16/02/2017 | 2.7 |
| 16/02/2017 | 2.8 |
| 16/02/2017 | 3.1 |
| 16/02/2017 | 3.8 |
| 16/02/2017 | 4.4 |
| 16/02/2017 | 4.8 |
| 16/02/2017 | 4.9 |
| 16/02/2017 | 5 |
| 16/02/2017 | 5.1 |
| 16/02/2017 | 5 |
| 16/02/2017 | 4.9 |
| 16/02/2017 | 4.9 |
| 16/02/2017 | 4.8 |
| 16/02/2017 | 4.8 |
| 16/02/2017 | 5.2 |
| 16/02/2017 | 5.5 |
| 16/02/2017 | 5.3 |
| 16/02/2017 | 4.7 |
| 16/02/2017 | 4.2 |
| 16/02/2017 | 3.8 |
| 16/02/2017 | 3.3 |
| 17/02/2017 | 3 |
| 17/02/2017 | 2.8 |
| 17/02/2017 | 2.7 |
| 17/02/2017 | 2.7 |
| 17/02/2017 | 2.8 |
| 17/02/2017 | 3.1 |
| 17/02/2017 | 3.7 |
| 17/02/2017 | 4.4 |
| 17/02/2017 | 4.7 |
| 17/02/2017 | 4.9 |
| 17/02/2017 | 5 |
| 17/02/2017 | 5 |
| 17/02/2017 | 5 |
| 17/02/2017 | 4.9 |
| 17/02/2017 | 4.8 |
| 17/02/2017 | 4.7 |
| 17/02/2017 | 4.7 |
| 17/02/2017 | 5.1 |
| 17/02/2017 | 5.3 |
| 17/02/2017 | 5.1 |
| 17/02/2017 | 4.5 |
| 17/02/2017 | 4 |
| 17/02/2017 | 3.6 |
| 17/02/2017 | 3.3 |
| 18/02/2017 | 3 |
| 18/02/2017 | 2.8 |
| 18/02/2017 | 2.7 |
| 18/02/2017 | 2.6 |
| 18/02/2017 | 2.6 |
| 18/02/2017 | 2.7 |
| 18/02/2017 | 2.9 |
| 18/02/2017 | 3.2 |
| 18/02/2017 | 3.5 |
| 18/02/2017 | 3.9 |
| 18/02/2017 | 4.1 |
| 18/02/2017 | 4.2 |
| 18/02/2017 | 4.1 |
| 18/02/2017 | 4 |
| 18/02/2017 | 3.9 |
| 18/02/2017 | 3.8 |
| 18/02/2017 | 3.9 |
| 18/02/2017 | 4.2 |
| 18/02/2017 | 4.6 |
| 18/02/2017 | 4.5 |
| 18/02/2017 | 4.1 |
| 18/02/2017 | 3.6 |
| 18/02/2017 | 3.4 |
| 18/02/2017 | 3.1 |
| 19/02/2017 | 2.9 |
| 19/02/2017 | 2.7 |
| 19/02/2017 | 2.6 |
| 19/02/2017 | 2.5 |
| 19/02/2017 | 2.5 |
| 19/02/2017 | 2.6 |
| 19/02/2017 | 2.7 |
| 19/02/2017 | 2.8 |
| 19/02/2017 | 3.1 |
| 19/02/2017 | 3.4 |
| 19/02/2017 | 3.5 |
| 19/02/2017 | 3.7 |
| 19/02/2017 | 3.7 |
| 19/02/2017 | 3.6 |
| 19/02/2017 | 3.5 |
| 19/02/2017 | 3.5 |
| 19/02/2017 | 3.5 |
| 19/02/2017 | 3.9 |
| 19/02/2017 | 4.3 |
| 19/02/2017 | 4.2 |
| 19/02/2017 | 3.9 |
| 19/02/2017 | 3.6 |
| 19/02/2017 | 3.4 |
| 19/02/2017 | 3.1 |
| 20/02/2017 | 2.9 |
| 20/02/2017 | 2.7 |
| 20/02/2017 | 2.6 |
| 20/02/2017 | 2.6 |
| 20/02/2017 | 2.7 |
| 20/02/2017 | 3 |
| 20/02/2017 | 3.7 |
| 20/02/2017 | 4.3 |
| 20/02/2017 | 4.6 |
| 20/02/2017 | 4.8 |
| 20/02/2017 | 4.9 |
| 20/02/2017 | 4.9 |
| 20/02/2017 | 4.9 |
| 20/02/2017 | 4.8 |
| 20/02/2017 | 4.8 |
| 20/02/2017 | 4.7 |
| 20/02/2017 | 4.7 |
| 20/02/2017 | 5.1 |
| 20/02/2017 | 5.4 |
| 20/02/2017 | 5.3 |
| 20/02/2017 | 4.7 |
| 20/02/2017 | 4.1 |
| 20/02/2017 | 3.7 |
| 20/02/2017 | 3.3 |
| 21/02/2017 | 3 |
| 21/02/2017 | 2.8 |
| 21/02/2017 | 2.7 |
| 21/02/2017 | 2.7 |
| 21/02/2017 | 2.8 |
| 21/02/2017 | 3.1 |
| 21/02/2017 | 3.7 |
| 21/02/2017 | 4.3 |
| 21/02/2017 | 4.7 |
| 21/02/2017 | 4.8 |
| 21/02/2017 | 4.9 |
| 21/02/2017 | 5 |
| 21/02/2017 | 4.9 |
| 21/02/2017 | 4.8 |
| 21/02/2017 | 4.8 |
| 21/02/2017 | 4.7 |
| 21/02/2017 | 4.8 |
| 21/02/2017 | 5.1 |
| 21/02/2017 | 5.5 |
| 21/02/2017 | 5.3 |
| 21/02/2017 | 4.7 |
| 21/02/2017 | 4.1 |
| 21/02/2017 | 3.7 |
| 21/02/2017 | 3.3 |
| 22/02/2017 | 3 |
| 22/02/2017 | 2.8 |
| 22/02/2017 | 2.7 |
| 22/02/2017 | 2.7 |
| 22/02/2017 | 2.8 |
| 22/02/2017 | 3.1 |
| 22/02/2017 | 3.7 |
| 22/02/2017 | 4.3 |
| 22/02/2017 | 4.7 |
| 22/02/2017 | 4.9 |
| 22/02/2017 | 5 |
| 22/02/2017 | 5 |
| 22/02/2017 | 5 |
| 22/02/2017 | 4.9 |
| 22/02/2017 | 4.8 |
| 22/02/2017 | 4.7 |
| 22/02/2017 | 4.7 |
| 22/02/2017 | 5.1 |
| 22/02/2017 | 5.4 |
| 22/02/2017 | 5.3 |
| 22/02/2017 | 4.7 |
| 22/02/2017 | 4.1 |
| 22/02/2017 | 3.7 |
| 22/02/2017 | 3.3 |
| 23/02/2017 | 3 |
| 23/02/2017 | 2.8 |
| 23/02/2017 | 2.7 |
| 23/02/2017 | 2.7 |
| 23/02/2017 | 2.8 |
| 23/02/2017 | 3.1 |
| 23/02/2017 | 3.7 |
| 23/02/2017 | 4.3 |
| 23/02/2017 | 4.7 |
| 23/02/2017 | 4.8 |
| 23/02/2017 | 4.9 |
| 23/02/2017 | 4.9 |
| 23/02/2017 | 4.9 |
| 23/02/2017 | 4.8 |
| 23/02/2017 | 4.7 |
| 23/02/2017 | 4.7 |
| 23/02/2017 | 4.7 |
| 23/02/2017 | 5 |
| 23/02/2017 | 5.4 |
| 23/02/2017 | 5.3 |
| 23/02/2017 | 4.7 |
| 23/02/2017 | 4.1 |
| 23/02/2017 | 3.7 |
| 23/02/2017 | 3.3 |
| 24/02/2017 | 3 |
| 24/02/2017 | 2.8 |
| 24/02/2017 | 2.7 |
| 24/02/2017 | 2.6 |
| 24/02/2017 | 2.7 |
| 24/02/2017 | 3 |
| 24/02/2017 | 3.7 |
| 24/02/2017 | 4.3 |
| 24/02/2017 | 4.6 |
| 24/02/2017 | 4.8 |
| 24/02/2017 | 4.9 |
| 24/02/2017 | 4.9 |
| 24/02/2017 | 4.9 |
| 24/02/2017 | 4.7 |
| 24/02/2017 | 4.6 |
| 24/02/2017 | 4.6 |
| 24/02/2017 | 4.6 |
| 24/02/2017 | 4.9 |
| 24/02/2017 | 5.2 |
| 24/02/2017 | 5.1 |
| 24/02/2017 | 4.5 |
| 24/02/2017 | 3.9 |
| 24/02/2017 | 3.6 |
| 24/02/2017 | 3.2 |
| 25/02/2017 | 2.9 |
| 25/02/2017 | 2.7 |
| 25/02/2017 | 2.6 |
| 25/02/2017 | 2.6 |
| 25/02/2017 | 2.6 |
| 25/02/2017 | 2.7 |
| 25/02/2017 | 2.8 |
| 25/02/2017 | 3.1 |
| 25/02/2017 | 3.5 |
| 25/02/2017 | 3.8 |
| 25/02/2017 | 4 |
| 25/02/2017 | 4.1 |
| 25/02/2017 | 4 |
| 25/02/2017 | 3.9 |
| 25/02/2017 | 3.8 |
| 25/02/2017 | 3.7 |
| 25/02/2017 | 3.7 |
| 25/02/2017 | 4 |
| 25/02/2017 | 4.4 |
| 25/02/2017 | 4.4 |
| 25/02/2017 | 4 |
| 25/02/2017 | 3.6 |
| 25/02/2017 | 3.3 |
| 25/02/2017 | 3 |
| 26/02/2017 | 2.8 |
| 26/02/2017 | 2.6 |
| 26/02/2017 | 2.5 |
| 26/02/2017 | 2.5 |
| 26/02/2017 | 2.5 |
| 26/02/2017 | 2.5 |
| 26/02/2017 | 2.6 |
| 26/02/2017 | 2.8 |
| 26/02/2017 | 3 |
| 26/02/2017 | 3.3 |
| 26/02/2017 | 3.4 |
| 26/02/2017 | 3.6 |
| 26/02/2017 | 3.6 |
| 26/02/2017 | 3.5 |
| 26/02/2017 | 3.4 |
| 26/02/2017 | 3.4 |
| 26/02/2017 | 3.4 |
| 26/02/2017 | 3.7 |
| 26/02/2017 | 4.2 |
| 26/02/2017 | 4.1 |
| 26/02/2017 | 3.8 |
| 26/02/2017 | 3.5 |
| 26/02/2017 | 3.3 |
| 26/02/2017 | 3 |
| 27/02/2017 | 2.8 |
| 27/02/2017 | 2.6 |
| 27/02/2017 | 2.5 |
| 27/02/2017 | 2.5 |
| 27/02/2017 | 2.6 |
| 27/02/2017 | 2.9 |
| 27/02/2017 | 3.6 |
| 27/02/2017 | 4.2 |
| 27/02/2017 | 4.5 |
| 27/02/2017 | 4.7 |
| 27/02/2017 | 4.8 |
| 27/02/2017 | 4.8 |
| 27/02/2017 | 4.8 |
| 27/02/2017 | 4.7 |
| 27/02/2017 | 4.7 |
| 27/02/2017 | 4.6 |
| 27/02/2017 | 4.6 |
| 27/02/2017 | 4.9 |
| 27/02/2017 | 5.3 |
| 27/02/2017 | 5.2 |
| 27/02/2017 | 4.6 |
| 27/02/2017 | 4 |
| 27/02/2017 | 3.6 |
| 27/02/2017 | 3.2 |
| 28/02/2017 | 2.9 |
| 28/02/2017 | 2.7 |
| 28/02/2017 | 2.6 |
| 28/02/2017 | 2.6 |
| 28/02/2017 | 2.7 |
| 28/02/2017 | 3 |
| 28/02/2017 | 3.6 |
| 28/02/2017 | 4.2 |
| 28/02/2017 | 4.6 |
| 28/02/2017 | 4.7 |
| 28/02/2017 | 4.8 |
| 28/02/2017 | 4.8 |
| 28/02/2017 | 4.8 |
| 28/02/2017 | 4.7 |
| 28/02/2017 | 4.7 |
| 28/02/2017 | 4.6 |
| 28/02/2017 | 4.6 |
| 28/02/2017 | 4.9 |
| 28/02/2017 | 5.3 |
| 28/02/2017 | 5.2 |
| 28/02/2017 | 4.6 |
| 28/02/2017 | 4 |
| 28/02/2017 | 3.6 |
| 28/02/2017 | 3.2 |
| 01/03/2017 | 2.9 |
| 01/03/2017 | 2.7 |
| 01/03/2017 | 2.6 |
| 01/03/2017 | 2.6 |
| 01/03/2017 | 2.7 |
| 01/03/2017 | 3 |
| 01/03/2017 | 3.7 |
| 01/03/2017 | 4.2 |
| 01/03/2017 | 4.6 |
| 01/03/2017 | 4.8 |
| 01/03/2017 | 4.8 |
| 01/03/2017 | 4.9 |
| 01/03/2017 | 4.8 |
| 01/03/2017 | 4.8 |
| 01/03/2017 | 4.7 |
| 01/03/2017 | 4.6 |
| 01/03/2017 | 4.6 |
| 01/03/2017 | 4.9 |
| 01/03/2017 | 5.3 |
| 01/03/2017 | 5.2 |
| 01/03/2017 | 4.6 |
| 01/03/2017 | 4 |
| 01/03/2017 | 3.6 |
| 01/03/2017 | 3.2 |
| 02/03/2017 | 2.9 |
| 02/03/2017 | 2.7 |
| 02/03/2017 | 2.6 |
| 02/03/2017 | 2.6 |
| 02/03/2017 | 2.7 |
| 02/03/2017 | 3 |
| 02/03/2017 | 3.6 |
| 02/03/2017 | 4.2 |
| 02/03/2017 | 4.6 |
| 02/03/2017 | 4.7 |
| 02/03/2017 | 4.8 |
| 02/03/2017 | 4.8 |
| 02/03/2017 | 4.8 |
| 02/03/2017 | 4.7 |
| 02/03/2017 | 4.6 |
| 02/03/2017 | 4.6 |
| 02/03/2017 | 4.5 |
| 02/03/2017 | 4.8 |
| 02/03/2017 | 5.2 |
| 02/03/2017 | 5.2 |
| 02/03/2017 | 4.6 |
| 02/03/2017 | 4 |
| 02/03/2017 | 3.6 |
| 02/03/2017 | 3.2 |
| 03/03/2017 | 2.9 |
| 03/03/2017 | 2.7 |
| 03/03/2017 | 2.6 |
| 03/03/2017 | 2.6 |
| 03/03/2017 | 2.7 |
| 03/03/2017 | 3 |
| 03/03/2017 | 3.6 |
| 03/03/2017 | 4.2 |
| 03/03/2017 | 4.5 |
| 03/03/2017 | 4.7 |
| 03/03/2017 | 4.8 |
| 03/03/2017 | 4.8 |
| 03/03/2017 | 4.8 |
| 03/03/2017 | 4.6 |
| 03/03/2017 | 4.5 |
| 03/03/2017 | 4.4 |
| 03/03/2017 | 4.4 |
| 03/03/2017 | 4.7 |
| 03/03/2017 | 5.1 |
| 03/03/2017 | 5 |
| 03/03/2017 | 4.4 |
| 03/03/2017 | 3.8 |
| 03/03/2017 | 3.5 |
| 03/03/2017 | 3.1 |
| 04/03/2017 | 2.9 |
| 04/03/2017 | 2.7 |
| 04/03/2017 | 2.6 |
| 04/03/2017 | 2.5 |
| 04/03/2017 | 2.5 |
| 04/03/2017 | 2.6 |
| 04/03/2017 | 2.8 |
| 04/03/2017 | 3 |
| 04/03/2017 | 3.4 |
| 04/03/2017 | 3.7 |
| 04/03/2017 | 3.9 |
| 04/03/2017 | 4 |
| 04/03/2017 | 3.9 |
| 04/03/2017 | 3.8 |
| 04/03/2017 | 3.7 |
| 04/03/2017 | 3.6 |
| 04/03/2017 | 3.6 |
| 04/03/2017 | 3.9 |
| 04/03/2017 | 4.3 |
| 04/03/2017 | 4.4 |
| 04/03/2017 | 3.9 |
| 04/03/2017 | 3.5 |
| 04/03/2017 | 3.2 |
| 04/03/2017 | 3 |
| 05/03/2017 | 2.7 |
| 05/03/2017 | 2.6 |
| 05/03/2017 | 2.5 |
| 05/03/2017 | 2.5 |
| 05/03/2017 | 2.4 |
| 05/03/2017 | 2.5 |
| 05/03/2017 | 2.6 |
| 05/03/2017 | 2.7 |
| 05/03/2017 | 2.9 |
| 05/03/2017 | 3.2 |
| 05/03/2017 | 3.4 |
| 05/03/2017 | 3.5 |
| 05/03/2017 | 3.5 |
| 05/03/2017 | 3.4 |
| 05/03/2017 | 3.4 |
| 05/03/2017 | 3.3 |
| 05/03/2017 | 3.3 |
| 05/03/2017 | 3.6 |
| 05/03/2017 | 4 |
| 05/03/2017 | 4.1 |
| 05/03/2017 | 3.8 |
| 05/03/2017 | 3.5 |
| 05/03/2017 | 3.3 |
| 05/03/2017 | 3 |
| 06/03/2017 | 2.7 |
| 06/03/2017 | 2.6 |
| 06/03/2017 | 2.5 |
| 06/03/2017 | 2.5 |
| 06/03/2017 | 2.6 |
| 06/03/2017 | 2.9 |
| 06/03/2017 | 3.5 |
| 06/03/2017 | 4.1 |
| 06/03/2017 | 4.4 |
| 06/03/2017 | 4.6 |
| 06/03/2017 | 4.7 |
| 06/03/2017 | 4.7 |
| 06/03/2017 | 4.7 |
| 06/03/2017 | 4.6 |
| 06/03/2017 | 4.6 |
| 06/03/2017 | 4.5 |
| 06/03/2017 | 4.5 |
| 06/03/2017 | 4.7 |
| 06/03/2017 | 5.1 |
| 06/03/2017 | 5.1 |
| 06/03/2017 | 4.5 |
| 06/03/2017 | 4 |
| 06/03/2017 | 3.5 |
| 06/03/2017 | 3.1 |
| 07/03/2017 | 2.8 |
| 07/03/2017 | 2.7 |
| 07/03/2017 | 2.6 |
| 07/03/2017 | 2.6 |
| 07/03/2017 | 2.7 |
| 07/03/2017 | 3 |
| 07/03/2017 | 3.6 |
| 07/03/2017 | 4.1 |
| 07/03/2017 | 4.5 |
| 07/03/2017 | 4.6 |
| 07/03/2017 | 4.7 |
| 07/03/2017 | 4.7 |
| 07/03/2017 | 4.7 |
| 07/03/2017 | 4.6 |
| 07/03/2017 | 4.6 |
| 07/03/2017 | 4.5 |
| 07/03/2017 | 4.5 |
| 07/03/2017 | 4.7 |
| 07/03/2017 | 5.2 |
| 07/03/2017 | 5.2 |
| 07/03/2017 | 4.6 |
| 07/03/2017 | 4 |
| 07/03/2017 | 3.5 |
| 07/03/2017 | 3.1 |
| 08/03/2017 | 2.9 |
| 08/03/2017 | 2.7 |
| 08/03/2017 | 2.6 |
| 08/03/2017 | 2.6 |
| 08/03/2017 | 2.7 |
| 08/03/2017 | 3 |
| 08/03/2017 | 3.6 |
| 08/03/2017 | 4.1 |
| 08/03/2017 | 4.5 |
| 08/03/2017 | 4.7 |
| 08/03/2017 | 4.7 |
| 08/03/2017 | 4.8 |
| 08/03/2017 | 4.7 |
| 08/03/2017 | 4.7 |
| 08/03/2017 | 4.6 |
| 08/03/2017 | 4.5 |
| 08/03/2017 | 4.5 |
| 08/03/2017 | 4.7 |
| 08/03/2017 | 5.2 |
| 08/03/2017 | 5.2 |
| 08/03/2017 | 4.6 |
| 08/03/2017 | 4 |
| 08/03/2017 | 3.5 |
| 08/03/2017 | 3.1 |
| 09/03/2017 | 2.9 |
| 09/03/2017 | 2.7 |
| 09/03/2017 | 2.6 |
| 09/03/2017 | 2.6 |
| 09/03/2017 | 2.7 |
| 09/03/2017 | 3 |
| 09/03/2017 | 3.6 |
| 09/03/2017 | 4.1 |
| 09/03/2017 | 4.5 |
| 09/03/2017 | 4.6 |
| 09/03/2017 | 4.7 |
| 09/03/2017 | 4.7 |
| 09/03/2017 | 4.7 |
| 09/03/2017 | 4.6 |
| 09/03/2017 | 4.5 |
| 09/03/2017 | 4.4 |
| 09/03/2017 | 4.4 |
| 09/03/2017 | 4.6 |
| 09/03/2017 | 5.1 |
| 09/03/2017 | 5.1 |
| 09/03/2017 | 4.5 |
| 09/03/2017 | 3.9 |
| 09/03/2017 | 3.5 |
| 09/03/2017 | 3.1 |
| 10/03/2017 | 2.8 |
| 10/03/2017 | 2.7 |
| 10/03/2017 | 2.6 |
| 10/03/2017 | 2.6 |
| 10/03/2017 | 2.7 |
| 10/03/2017 | 2.9 |
| 10/03/2017 | 3.5 |
| 10/03/2017 | 4.1 |
| 10/03/2017 | 4.4 |
| 10/03/2017 | 4.6 |
| 10/03/2017 | 4.7 |
| 10/03/2017 | 4.7 |
| 10/03/2017 | 4.6 |
| 10/03/2017 | 4.5 |
| 10/03/2017 | 4.4 |
| 10/03/2017 | 4.3 |
| 10/03/2017 | 4.3 |
| 10/03/2017 | 4.5 |
| 10/03/2017 | 4.9 |
| 10/03/2017 | 4.9 |
| 10/03/2017 | 4.3 |
| 10/03/2017 | 3.8 |
| 10/03/2017 | 3.4 |
| 10/03/2017 | 3.1 |
| 11/03/2017 | 2.8 |
| 11/03/2017 | 2.6 |
| 11/03/2017 | 2.5 |
| 11/03/2017 | 2.5 |
| 11/03/2017 | 2.5 |
| 11/03/2017 | 2.6 |
| 11/03/2017 | 2.7 |
| 11/03/2017 | 2.9 |
| 11/03/2017 | 3.3 |
| 11/03/2017 | 3.6 |
| 11/03/2017 | 3.8 |
| 11/03/2017 | 3.9 |
| 11/03/2017 | 3.8 |
| 11/03/2017 | 3.7 |
| 11/03/2017 | 3.6 |
| 11/03/2017 | 3.5 |
| 11/03/2017 | 3.5 |
| 11/03/2017 | 3.7 |
| 11/03/2017 | 4.2 |
| 11/03/2017 | 4.3 |
| 11/03/2017 | 3.9 |
| 11/03/2017 | 3.4 |
| 11/03/2017 | 3.2 |
| 11/03/2017 | 2.9 |
| 12/03/2017 | 2.7 |
| 12/03/2017 | 2.5 |
| 12/03/2017 | 2.5 |
| 12/03/2017 | 2.4 |
| 12/03/2017 | 2.4 |
| 12/03/2017 | 2.4 |
| 12/03/2017 | 2.5 |
| 12/03/2017 | 2.6 |
| 12/03/2017 | 2.9 |
| 12/03/2017 | 3.1 |
| 12/03/2017 | 3.3 |
| 12/03/2017 | 3.4 |
| 12/03/2017 | 3.5 |
| 12/03/2017 | 3.4 |
| 12/03/2017 | 3.3 |
| 12/03/2017 | 3.2 |
| 12/03/2017 | 3.2 |
| 12/03/2017 | 3.4 |
| 12/03/2017 | 3.9 |
| 12/03/2017 | 4 |
| 12/03/2017 | 3.7 |
| 12/03/2017 | 3.4 |
| 12/03/2017 | 3.2 |
| 12/03/2017 | 2.9 |
| 13/03/2017 | 2.7 |
| 13/03/2017 | 2.5 |
| 13/03/2017 | 2.5 |
| 13/03/2017 | 2.4 |
| 13/03/2017 | 2.6 |
| 13/03/2017 | 2.9 |
| 13/03/2017 | 3.5 |
| 13/03/2017 | 4 |
| 13/03/2017 | 4.3 |
| 13/03/2017 | 4.5 |
| 13/03/2017 | 4.6 |
| 13/03/2017 | 4.6 |
| 13/03/2017 | 4.6 |
| 13/03/2017 | 4.5 |
| 13/03/2017 | 4.4 |
| 13/03/2017 | 4.4 |
| 13/03/2017 | 4.3 |
| 13/03/2017 | 4.5 |
| 13/03/2017 | 5 |
| 13/03/2017 | 5.1 |
| 13/03/2017 | 4.5 |
| 13/03/2017 | 3.9 |
| 13/03/2017 | 3.5 |
| 13/03/2017 | 3.1 |
| 14/03/2017 | 2.8 |
| 14/03/2017 | 2.6 |
| 14/03/2017 | 2.5 |
| 14/03/2017 | 2.5 |
| 14/03/2017 | 2.6 |
| 14/03/2017 | 2.9 |
| 14/03/2017 | 3.5 |
| 14/03/2017 | 4 |
| 14/03/2017 | 4.4 |
| 14/03/2017 | 4.5 |
| 14/03/2017 | 4.6 |
| 14/03/2017 | 4.6 |
| 14/03/2017 | 4.6 |
| 14/03/2017 | 4.5 |
| 14/03/2017 | 4.4 |
| 14/03/2017 | 4.4 |
| 14/03/2017 | 4.4 |
| 14/03/2017 | 4.5 |
| 14/03/2017 | 5 |
| 14/03/2017 | 5.1 |
| 14/03/2017 | 4.5 |
| 14/03/2017 | 3.9 |
| 14/03/2017 | 3.5 |
| 14/03/2017 | 3.1 |
| 15/03/2017 | 2.8 |
| 15/03/2017 | 2.6 |
| 15/03/2017 | 2.5 |
| 15/03/2017 | 2.5 |
| 15/03/2017 | 2.6 |
| 15/03/2017 | 2.9 |
| 15/03/2017 | 3.5 |
| 15/03/2017 | 4 |
| 15/03/2017 | 4.4 |
| 15/03/2017 | 4.6 |
| 15/03/2017 | 4.6 |
| 15/03/2017 | 4.6 |
| 15/03/2017 | 4.6 |
| 15/03/2017 | 4.5 |
| 15/03/2017 | 4.5 |
| 15/03/2017 | 4.4 |
| 15/03/2017 | 4.3 |
| 15/03/2017 | 4.5 |
| 15/03/2017 | 5 |
| 15/03/2017 | 5.1 |
| 15/03/2017 | 4.5 |
| 15/03/2017 | 3.9 |
| 15/03/2017 | 3.5 |
| 15/03/2017 | 3.1 |
| 16/03/2017 | 2.8 |
| 16/03/2017 | 2.6 |
| 16/03/2017 | 2.5 |
| 16/03/2017 | 2.5 |
| 16/03/2017 | 2.6 |
| 16/03/2017 | 2.9 |
| 16/03/2017 | 3.5 |
| 16/03/2017 | 4 |
| 16/03/2017 | 4.4 |
| 16/03/2017 | 4.5 |
| 16/03/2017 | 4.6 |
| 16/03/2017 | 4.6 |
| 16/03/2017 | 4.6 |
| 16/03/2017 | 4.5 |
| 16/03/2017 | 4.4 |
| 16/03/2017 | 4.3 |
| 16/03/2017 | 4.3 |
| 16/03/2017 | 4.4 |
| 16/03/2017 | 5 |
| 16/03/2017 | 5 |
| 16/03/2017 | 4.5 |
| 16/03/2017 | 3.9 |
| 16/03/2017 | 3.4 |
| 16/03/2017 | 3.1 |
| 17/03/2017 | 2.8 |
| 17/03/2017 | 2.6 |
| 17/03/2017 | 2.5 |
| 17/03/2017 | 2.5 |
| 17/03/2017 | 2.6 |
| 17/03/2017 | 2.9 |
| 17/03/2017 | 3.5 |
| 17/03/2017 | 4 |
| 17/03/2017 | 4.3 |
| 17/03/2017 | 4.5 |
| 17/03/2017 | 4.6 |
| 17/03/2017 | 4.6 |
| 17/03/2017 | 4.6 |
| 17/03/2017 | 4.4 |
| 17/03/2017 | 4.3 |
| 17/03/2017 | 4.2 |
| 17/03/2017 | 4.2 |
| 17/03/2017 | 4.3 |
| 17/03/2017 | 4.8 |
| 17/03/2017 | 4.8 |
| 17/03/2017 | 4.3 |
| 17/03/2017 | 3.7 |
| 17/03/2017 | 3.3 |
| 17/03/2017 | 3 |
| 18/03/2017 | 2.8 |
| 18/03/2017 | 2.6 |
| 18/03/2017 | 2.5 |
| 18/03/2017 | 2.5 |
| 18/03/2017 | 2.5 |
| 18/03/2017 | 2.5 |
| 18/03/2017 | 2.7 |
| 18/03/2017 | 2.9 |
| 18/03/2017 | 3.2 |
| 18/03/2017 | 3.6 |
| 18/03/2017 | 3.7 |
| 18/03/2017 | 3.8 |
| 18/03/2017 | 3.8 |
| 18/03/2017 | 3.7 |
| 18/03/2017 | 3.6 |
| 18/03/2017 | 3.5 |
| 18/03/2017 | 3.5 |
| 18/03/2017 | 3.6 |
| 18/03/2017 | 4.1 |
| 18/03/2017 | 4.2 |
| 18/03/2017 | 3.8 |
| 18/03/2017 | 3.4 |
| 18/03/2017 | 3.1 |
| 18/03/2017 | 2.9 |
| 19/03/2017 | 2.6 |
| 19/03/2017 | 2.5 |
| 19/03/2017 | 2.4 |
| 19/03/2017 | 2.4 |
| 19/03/2017 | 2.4 |
| 19/03/2017 | 2.4 |
| 19/03/2017 | 2.5 |
| 19/03/2017 | 2.6 |
| 19/03/2017 | 2.8 |
| 19/03/2017 | 3.1 |
| 19/03/2017 | 3.2 |
| 19/03/2017 | 3.4 |
| 19/03/2017 | 3.4 |
| 19/03/2017 | 3.3 |
| 19/03/2017 | 3.2 |
| 19/03/2017 | 3.2 |
| 19/03/2017 | 3.2 |
| 19/03/2017 | 3.4 |
| 19/03/2017 | 3.8 |
| 19/03/2017 | 3.9 |
| 19/03/2017 | 3.7 |
| 19/03/2017 | 3.4 |
| 19/03/2017 | 3.1 |
| 19/03/2017 | 2.9 |
| 20/03/2017 | 2.6 |
| 20/03/2017 | 2.5 |
| 20/03/2017 | 2.4 |
| 20/03/2017 | 2.4 |
| 20/03/2017 | 2.5 |
| 20/03/2017 | 2.8 |
| 20/03/2017 | 3.4 |
| 20/03/2017 | 3.9 |
| 20/03/2017 | 4.3 |
| 20/03/2017 | 4.4 |
| 20/03/2017 | 4.5 |
| 20/03/2017 | 4.5 |
| 20/03/2017 | 4.5 |
| 20/03/2017 | 4.5 |
| 20/03/2017 | 4.4 |
| 20/03/2017 | 4.3 |
| 20/03/2017 | 4.3 |
| 20/03/2017 | 4.4 |
| 20/03/2017 | 4.9 |
| 20/03/2017 | 4.9 |
| 20/03/2017 | 4.4 |
| 20/03/2017 | 3.8 |
| 20/03/2017 | 3.4 |
| 20/03/2017 | 3 |
| 21/03/2017 | 2.8 |
| 21/03/2017 | 2.6 |
| 21/03/2017 | 2.5 |
| 21/03/2017 | 2.5 |
| 21/03/2017 | 2.6 |
| 21/03/2017 | 2.9 |
| 21/03/2017 | 3.5 |
| 21/03/2017 | 4 |
| 21/03/2017 | 4.3 |
| 21/03/2017 | 4.5 |
| 21/03/2017 | 4.6 |
| 21/03/2017 | 4.6 |
| 21/03/2017 | 4.5 |
| 21/03/2017 | 4.5 |
| 21/03/2017 | 4.4 |
| 21/03/2017 | 4.3 |
| 21/03/2017 | 4.4 |
| 21/03/2017 | 4.5 |
| 21/03/2017 | 4.9 |
| 21/03/2017 | 4.9 |
| 21/03/2017 | 4.4 |
| 21/03/2017 | 3.9 |
| 21/03/2017 | 3.4 |
| 21/03/2017 | 3 |
| 22/03/2017 | 2.8 |
| 22/03/2017 | 2.6 |
| 22/03/2017 | 2.5 |
| 22/03/2017 | 2.5 |
| 22/03/2017 | 2.6 |
| 22/03/2017 | 2.9 |
| 22/03/2017 | 3.5 |
| 22/03/2017 | 4 |
| 22/03/2017 | 4.4 |
| 22/03/2017 | 4.5 |
| 22/03/2017 | 4.6 |
| 22/03/2017 | 4.6 |
| 22/03/2017 | 4.6 |
| 22/03/2017 | 4.5 |
| 22/03/2017 | 4.5 |
| 22/03/2017 | 4.4 |
| 22/03/2017 | 4.4 |
| 22/03/2017 | 4.5 |
| 22/03/2017 | 4.9 |
| 22/03/2017 | 4.9 |
| 22/03/2017 | 4.4 |
| 22/03/2017 | 3.9 |
| 22/03/2017 | 3.4 |
| 22/03/2017 | 3 |
| 23/03/2017 | 2.8 |
| 23/03/2017 | 2.6 |
| 23/03/2017 | 2.5 |
| 23/03/2017 | 2.5 |
| 23/03/2017 | 2.6 |
| 23/03/2017 | 2.9 |
| 23/03/2017 | 3.5 |
| 23/03/2017 | 4 |
| 23/03/2017 | 4.3 |
| 23/03/2017 | 4.5 |
| 23/03/2017 | 4.6 |
| 23/03/2017 | 4.6 |
| 23/03/2017 | 4.6 |
| 23/03/2017 | 4.5 |
| 23/03/2017 | 4.4 |
| 23/03/2017 | 4.3 |
| 23/03/2017 | 4.3 |
| 23/03/2017 | 4.5 |
| 23/03/2017 | 4.8 |
| 23/03/2017 | 4.9 |
| 23/03/2017 | 4.4 |
| 23/03/2017 | 3.9 |
| 23/03/2017 | 3.4 |
| 23/03/2017 | 3 |
| 24/03/2017 | 2.8 |
| 24/03/2017 | 2.6 |
| 24/03/2017 | 2.5 |
| 24/03/2017 | 2.5 |
| 24/03/2017 | 2.6 |
| 24/03/2017 | 2.9 |
| 24/03/2017 | 3.4 |
| 24/03/2017 | 3.9 |
| 24/03/2017 | 4.3 |
| 24/03/2017 | 4.5 |
| 24/03/2017 | 4.6 |
| 24/03/2017 | 4.6 |
| 24/03/2017 | 4.5 |
| 24/03/2017 | 4.4 |
| 24/03/2017 | 4.3 |
| 24/03/2017 | 4.2 |
| 24/03/2017 | 4.2 |
| 24/03/2017 | 4.4 |
| 24/03/2017 | 4.7 |
| 24/03/2017 | 4.7 |
| 24/03/2017 | 4.2 |
| 24/03/2017 | 3.7 |
| 24/03/2017 | 3.3 |
| 24/03/2017 | 3 |
| 25/03/2017 | 2.7 |
| 25/03/2017 | 2.6 |
| 25/03/2017 | 2.5 |
| 25/03/2017 | 2.5 |
| 25/03/2017 | 2.5 |
| 25/03/2017 | 2.5 |
| 25/03/2017 | 2.7 |
| 25/03/2017 | 2.9 |
| 25/03/2017 | 3.2 |
| 25/03/2017 | 3.5 |
| 25/03/2017 | 3.7 |
| 25/03/2017 | 3.8 |
| 25/03/2017 | 3.7 |
| 25/03/2017 | 3.6 |
| 25/03/2017 | 3.5 |
| 25/03/2017 | 3.5 |
| 25/03/2017 | 3.5 |
| 25/03/2017 | 3.6 |
| 25/03/2017 | 4 |
| 25/03/2017 | 4 |
| 25/03/2017 | 3.8 |
| 25/03/2017 | 3.4 |
| 25/03/2017 | 3.1 |
| 25/03/2017 | 2.8 |
| 26/03/2017 | 2.7 |
| 26/03/2017 | 2.5 |
| 26/03/2017 | 0 |
| 26/03/2017 | 2.4 |
| 26/03/2017 | 2.4 |
| 26/03/2017 | 2.4 |
| 26/03/2017 | 2.5 |
| 26/03/2017 | 2.6 |
| 26/03/2017 | 2.9 |
| 26/03/2017 | 3.1 |
| 26/03/2017 | 3.3 |
| 26/03/2017 | 3.4 |
| 26/03/2017 | 3.5 |
| 26/03/2017 | 3.4 |
| 26/03/2017 | 3.3 |
| 26/03/2017 | 3.2 |
| 26/03/2017 | 3.2 |
| 26/03/2017 | 3.2 |
| 26/03/2017 | 3.6 |
| 26/03/2017 | 3.8 |
| 26/03/2017 | 3.7 |
| 26/03/2017 | 3.4 |
| 26/03/2017 | 3.2 |
| 26/03/2017 | 2.9 |
| 27/03/2017 | 2.7 |
| 27/03/2017 | 2.5 |
| 27/03/2017 | 2.4 |
| 27/03/2017 | 2.4 |
| 27/03/2017 | 2.5 |
| 27/03/2017 | 2.8 |
| 27/03/2017 | 3.4 |
| 27/03/2017 | 4 |
| 27/03/2017 | 4.3 |
| 27/03/2017 | 4.5 |
| 27/03/2017 | 4.6 |
| 27/03/2017 | 4.6 |
| 27/03/2017 | 4.6 |
| 27/03/2017 | 4.5 |
| 27/03/2017 | 4.4 |
| 27/03/2017 | 4.4 |
| 27/03/2017 | 4.3 |
| 27/03/2017 | 4.2 |
| 27/03/2017 | 4.6 |
| 27/03/2017 | 4.8 |
| 27/03/2017 | 4.5 |
| 27/03/2017 | 3.9 |
| 27/03/2017 | 3.5 |
| 27/03/2017 | 3.1 |
| 28/03/2017 | 2.8 |
| 28/03/2017 | 2.6 |
| 28/03/2017 | 2.5 |
| 28/03/2017 | 2.5 |
| 28/03/2017 | 2.6 |
| 28/03/2017 | 2.9 |
| 28/03/2017 | 3.5 |
| 28/03/2017 | 4 |
| 28/03/2017 | 4.4 |
| 28/03/2017 | 4.5 |
| 28/03/2017 | 4.6 |
| 28/03/2017 | 4.7 |
| 28/03/2017 | 4.7 |
| 28/03/2017 | 4.6 |
| 28/03/2017 | 4.5 |
| 28/03/2017 | 4.4 |
| 28/03/2017 | 4.3 |
| 28/03/2017 | 4.2 |
| 28/03/2017 | 4.6 |
| 28/03/2017 | 4.8 |
| 28/03/2017 | 4.5 |
| 28/03/2017 | 4 |
| 28/03/2017 | 3.5 |
| 28/03/2017 | 3.1 |
| 29/03/2017 | 2.8 |
| 29/03/2017 | 2.6 |
| 29/03/2017 | 2.5 |
| 29/03/2017 | 2.5 |
| 29/03/2017 | 2.6 |
| 29/03/2017 | 2.9 |
| 29/03/2017 | 3.5 |
| 29/03/2017 | 4 |
| 29/03/2017 | 4.4 |
| 29/03/2017 | 4.6 |
| 29/03/2017 | 4.7 |
| 29/03/2017 | 4.7 |
| 29/03/2017 | 4.7 |
| 29/03/2017 | 4.6 |
| 29/03/2017 | 4.5 |
| 29/03/2017 | 4.4 |
| 29/03/2017 | 4.3 |
| 29/03/2017 | 4.2 |
| 29/03/2017 | 4.6 |
| 29/03/2017 | 4.8 |
| 29/03/2017 | 4.5 |
| 29/03/2017 | 4 |
| 29/03/2017 | 3.5 |
| 29/03/2017 | 3.1 |
| 30/03/2017 | 2.8 |
| 30/03/2017 | 2.6 |
| 30/03/2017 | 2.5 |
| 30/03/2017 | 2.5 |
| 30/03/2017 | 2.6 |
| 30/03/2017 | 2.9 |
| 30/03/2017 | 3.5 |
| 30/03/2017 | 4 |
| 30/03/2017 | 4.4 |
| 30/03/2017 | 4.5 |
| 30/03/2017 | 4.6 |
| 30/03/2017 | 4.7 |
| 30/03/2017 | 4.7 |
| 30/03/2017 | 4.6 |
| 30/03/2017 | 4.5 |
| 30/03/2017 | 4.4 |
| 30/03/2017 | 4.3 |
| 30/03/2017 | 4.2 |
| 30/03/2017 | 4.6 |
| 30/03/2017 | 4.7 |
| 30/03/2017 | 4.5 |
| 30/03/2017 | 3.9 |
| 30/03/2017 | 3.5 |
| 30/03/2017 | 3.1 |
| 31/03/2017 | 2.8 |
| 31/03/2017 | 2.6 |
| 31/03/2017 | 2.5 |
| 31/03/2017 | 2.5 |
| 31/03/2017 | 2.6 |
| 31/03/2017 | 2.9 |
| 31/03/2017 | 3.4 |
| 31/03/2017 | 4 |
| 31/03/2017 | 4.3 |
| 31/03/2017 | 4.5 |
| 31/03/2017 | 4.6 |
| 31/03/2017 | 4.7 |
| 31/03/2017 | 4.6 |
| 31/03/2017 | 4.5 |
| 31/03/2017 | 4.4 |
| 31/03/2017 | 4.3 |
| 31/03/2017 | 4.2 |
| 31/03/2017 | 4.1 |
| 31/03/2017 | 4.4 |
| 31/03/2017 | 4.5 |
| 31/03/2017 | 4.3 |
| 31/03/2017 | 3.8 |
| 31/03/2017 | 3.4 |
| 31/03/2017 | 3.1 |
| 01/04/2017 | 2.8 |
| 01/04/2017 | 2.6 |
| 01/04/2017 | 2.5 |
| 01/04/2017 | 2.5 |
| 01/04/2017 | 2.5 |
| 01/04/2017 | 2.5 |
| 01/04/2017 | 2.7 |
| 01/04/2017 | 2.9 |
| 01/04/2017 | 3.2 |
| 01/04/2017 | 3.6 |
| 01/04/2017 | 3.8 |
| 01/04/2017 | 3.9 |
| 01/04/2017 | 3.8 |
| 01/04/2017 | 3.7 |
| 01/04/2017 | 3.6 |
| 01/04/2017 | 3.5 |
| 01/04/2017 | 3.4 |
| 01/04/2017 | 3.4 |
| 01/04/2017 | 3.7 |
| 01/04/2017 | 3.9 |
| 01/04/2017 | 3.8 |
| 01/04/2017 | 3.5 |
| 01/04/2017 | 3.2 |
| 01/04/2017 | 2.9 |
| 02/04/2017 | 2.6 |
| 02/04/2017 | 2.5 |
| 02/04/2017 | 2.4 |
| 02/04/2017 | 2.4 |
| 02/04/2017 | 2.4 |
| 02/04/2017 | 2.4 |
| 02/04/2017 | 2.5 |
| 02/04/2017 | 2.6 |
| 02/04/2017 | 2.8 |
| 02/04/2017 | 3.1 |
| 02/04/2017 | 3.3 |
| 02/04/2017 | 3.4 |
| 02/04/2017 | 3.5 |
| 02/04/2017 | 3.4 |
| 02/04/2017 | 3.3 |
| 02/04/2017 | 3.2 |
| 02/04/2017 | 3.2 |
| 02/04/2017 | 3.2 |
| 02/04/2017 | 3.5 |
| 02/04/2017 | 3.7 |
| 02/04/2017 | 3.7 |
| 02/04/2017 | 3.4 |
| 02/04/2017 | 3.2 |
| 02/04/2017 | 2.9 |
| 03/04/2017 | 2.7 |
| 03/04/2017 | 2.5 |
| 03/04/2017 | 2.4 |
| 03/04/2017 | 2.4 |
| 03/04/2017 | 2.5 |
| 03/04/2017 | 2.8 |
| 03/04/2017 | 3.4 |
| 03/04/2017 | 3.9 |
| 03/04/2017 | 4.3 |
| 03/04/2017 | 4.4 |
| 03/04/2017 | 4.6 |
| 03/04/2017 | 4.6 |
| 03/04/2017 | 4.6 |
| 03/04/2017 | 4.5 |
| 03/04/2017 | 4.4 |
| 03/04/2017 | 4.4 |
| 03/04/2017 | 4.3 |
| 03/04/2017 | 4.2 |
| 03/04/2017 | 4.5 |
| 03/04/2017 | 4.6 |
| 03/04/2017 | 4.4 |
| 03/04/2017 | 3.9 |
| 03/04/2017 | 3.5 |
| 03/04/2017 | 3.1 |
| 04/04/2017 | 2.8 |
| 04/04/2017 | 2.6 |
| 04/04/2017 | 2.5 |
| 04/04/2017 | 2.5 |
| 04/04/2017 | 2.6 |
| 04/04/2017 | 2.9 |
| 04/04/2017 | 3.4 |
| 04/04/2017 | 4 |
| 04/04/2017 | 4.3 |
| 04/04/2017 | 4.5 |
| 04/04/2017 | 4.6 |
| 04/04/2017 | 4.6 |
| 04/04/2017 | 4.6 |
| 04/04/2017 | 4.5 |
| 04/04/2017 | 4.4 |
| 04/04/2017 | 4.4 |
| 04/04/2017 | 4.3 |
| 04/04/2017 | 4.3 |
| 04/04/2017 | 4.5 |
| 04/04/2017 | 4.6 |
| 04/04/2017 | 4.5 |
| 04/04/2017 | 4 |
| 04/04/2017 | 3.5 |
| 04/04/2017 | 3.1 |
| 05/04/2017 | 2.8 |
| 05/04/2017 | 2.6 |
| 05/04/2017 | 2.5 |
| 05/04/2017 | 2.5 |
| 05/04/2017 | 2.6 |
| 05/04/2017 | 2.9 |
| 05/04/2017 | 3.5 |
| 05/04/2017 | 4 |
| 05/04/2017 | 4.4 |
| 05/04/2017 | 4.5 |
| 05/04/2017 | 4.6 |
| 05/04/2017 | 4.7 |
| 05/04/2017 | 4.7 |
| 05/04/2017 | 4.6 |
| 05/04/2017 | 4.5 |
| 05/04/2017 | 4.4 |
| 05/04/2017 | 4.3 |
| 05/04/2017 | 4.3 |
| 05/04/2017 | 4.5 |
| 05/04/2017 | 4.6 |
| 05/04/2017 | 4.4 |
| 05/04/2017 | 4 |
| 05/04/2017 | 3.5 |
| 05/04/2017 | 3.1 |
| 06/04/2017 | 2.8 |
| 06/04/2017 | 2.6 |
| 06/04/2017 | 2.5 |
| 06/04/2017 | 2.5 |
| 06/04/2017 | 2.6 |
| 06/04/2017 | 2.9 |
| 06/04/2017 | 3.4 |
| 06/04/2017 | 4 |
| 06/04/2017 | 4.3 |
| 06/04/2017 | 4.5 |
| 06/04/2017 | 4.6 |
| 06/04/2017 | 4.6 |
| 06/04/2017 | 4.6 |
| 06/04/2017 | 4.5 |
| 06/04/2017 | 4.4 |
| 06/04/2017 | 4.4 |
| 06/04/2017 | 4.3 |
| 06/04/2017 | 4.2 |
| 06/04/2017 | 4.5 |
| 06/04/2017 | 4.6 |
| 06/04/2017 | 4.4 |
| 06/04/2017 | 3.9 |
| 06/04/2017 | 3.5 |
| 06/04/2017 | 3.1 |
| 07/04/2017 | 2.8 |
| 07/04/2017 | 2.6 |
| 07/04/2017 | 2.5 |
| 07/04/2017 | 2.5 |
| 07/04/2017 | 2.6 |
| 07/04/2017 | 2.9 |
| 07/04/2017 | 3.4 |
| 07/04/2017 | 3.9 |
| 07/04/2017 | 4.3 |
| 07/04/2017 | 4.5 |
| 07/04/2017 | 4.6 |
| 07/04/2017 | 4.6 |
| 07/04/2017 | 4.6 |
| 07/04/2017 | 4.5 |
| 07/04/2017 | 4.4 |
| 07/04/2017 | 4.3 |
| 07/04/2017 | 4.2 |
| 07/04/2017 | 4.1 |
| 07/04/2017 | 4.3 |
| 07/04/2017 | 4.4 |
| 07/04/2017 | 4.2 |
| 07/04/2017 | 3.8 |
| 07/04/2017 | 3.4 |
| 07/04/2017 | 3 |
| 08/04/2017 | 2.7 |
| 08/04/2017 | 2.6 |
| 08/04/2017 | 2.5 |
| 08/04/2017 | 2.4 |
| 08/04/2017 | 2.5 |
| 08/04/2017 | 2.5 |
| 08/04/2017 | 2.6 |
| 08/04/2017 | 2.9 |
| 08/04/2017 | 3.2 |
| 08/04/2017 | 3.5 |
| 08/04/2017 | 3.8 |
| 08/04/2017 | 3.8 |
| 08/04/2017 | 3.8 |
| 08/04/2017 | 3.7 |
| 08/04/2017 | 3.6 |
| 08/04/2017 | 3.5 |
| 08/04/2017 | 3.4 |
| 08/04/2017 | 3.4 |
| 08/04/2017 | 3.6 |
| 08/04/2017 | 3.8 |
| 08/04/2017 | 3.8 |
| 08/04/2017 | 3.5 |
| 08/04/2017 | 3.1 |
| 08/04/2017 | 2.9 |
| 09/04/2017 | 2.6 |
| 09/04/2017 | 2.5 |
| 09/04/2017 | 2.4 |
| 09/04/2017 | 2.4 |
| 09/04/2017 | 2.4 |
| 09/04/2017 | 2.4 |
| 09/04/2017 | 2.4 |
| 09/04/2017 | 2.6 |
| 09/04/2017 | 2.8 |
| 09/04/2017 | 3.1 |
| 09/04/2017 | 3.2 |
| 09/04/2017 | 3.4 |
| 09/04/2017 | 3.4 |
| 09/04/2017 | 3.4 |
| 09/04/2017 | 3.2 |
| 09/04/2017 | 3.2 |
| 09/04/2017 | 3.2 |
| 09/04/2017 | 3.2 |
| 09/04/2017 | 3.4 |
| 09/04/2017 | 3.5 |
| 09/04/2017 | 3.6 |
| 09/04/2017 | 3.4 |
| 09/04/2017 | 3.2 |
| 09/04/2017 | 2.9 |
| 10/04/2017 | 2.6 |
| 10/04/2017 | 2.5 |
| 10/04/2017 | 2.4 |
| 10/04/2017 | 2.4 |
| 10/04/2017 | 2.5 |
| 10/04/2017 | 2.8 |
| 10/04/2017 | 3.2 |
| 10/04/2017 | 3.7 |
| 10/04/2017 | 4.1 |
| 10/04/2017 | 4.3 |
| 10/04/2017 | 4.4 |
| 10/04/2017 | 4.5 |
| 10/04/2017 | 4.5 |
| 10/04/2017 | 4.4 |
| 10/04/2017 | 4.3 |
| 10/04/2017 | 4.2 |
| 10/04/2017 | 4.2 |
| 10/04/2017 | 4.1 |
| 10/04/2017 | 4.3 |
| 10/04/2017 | 4.3 |
| 10/04/2017 | 4.2 |
| 10/04/2017 | 3.8 |
| 10/04/2017 | 3.4 |
| 10/04/2017 | 3 |
| 10/04/2017 | 2.7 |
| 11/04/2017 | 2.6 |
| 11/04/2017 | 2.5 |
| 11/04/2017 | 2.5 |
| 11/04/2017 | 2.6 |
| 11/04/2017 | 2.8 |
| 11/04/2017 | 3.3 |
| 11/04/2017 | 3.7 |
| 11/04/2017 | 4.1 |
| 11/04/2017 | 4.3 |
| 11/04/2017 | 4.5 |
| 11/04/2017 | 4.5 |
| 11/04/2017 | 4.5 |
| 11/04/2017 | 4.4 |
| 11/04/2017 | 4.3 |
| 11/04/2017 | 4.2 |
| 11/04/2017 | 4.2 |
| 11/04/2017 | 4.2 |
| 11/04/2017 | 4.3 |
| 11/04/2017 | 4.4 |
| 11/04/2017 | 4.3 |
| 11/04/2017 | 3.9 |
| 11/04/2017 | 3.4 |
| 11/04/2017 | 3 |
| 11/04/2017 | 2.8 |
| 12/04/2017 | 2.6 |
| 12/04/2017 | 2.5 |
| 12/04/2017 | 2.5 |
| 12/04/2017 | 2.6 |
| 12/04/2017 | 2.8 |
| 12/04/2017 | 3.3 |
| 12/04/2017 | 3.8 |
| 12/04/2017 | 4.2 |
| 12/04/2017 | 4.4 |
| 12/04/2017 | 4.5 |
| 12/04/2017 | 4.6 |
| 12/04/2017 | 4.6 |
| 12/04/2017 | 4.5 |
| 12/04/2017 | 4.4 |
| 12/04/2017 | 4.3 |
| 12/04/2017 | 4.2 |
| 12/04/2017 | 4.2 |
| 12/04/2017 | 4.3 |
| 12/04/2017 | 4.3 |
| 12/04/2017 | 4.2 |
| 12/04/2017 | 3.9 |
| 12/04/2017 | 3.4 |
| 12/04/2017 | 3 |
| 12/04/2017 | 2.8 |
| 13/04/2017 | 2.6 |
| 13/04/2017 | 2.5 |
| 13/04/2017 | 2.5 |
| 13/04/2017 | 2.6 |
| 13/04/2017 | 2.8 |
| 13/04/2017 | 3.3 |
| 13/04/2017 | 3.8 |
| 13/04/2017 | 4.1 |
| 13/04/2017 | 4.3 |
| 13/04/2017 | 4.5 |
| 13/04/2017 | 4.5 |
| 13/04/2017 | 4.5 |
| 13/04/2017 | 4.4 |
| 13/04/2017 | 4.3 |
| 13/04/2017 | 4.2 |
| 13/04/2017 | 4.2 |
| 13/04/2017 | 4.2 |
| 13/04/2017 | 4.2 |
| 13/04/2017 | 4.3 |
| 13/04/2017 | 4.2 |
| 13/04/2017 | 3.8 |
| 13/04/2017 | 3.4 |
| 13/04/2017 | 3 |
| 13/04/2017 | 2.7 |
| 14/04/2017 | 2.5 |
| 14/04/2017 | 2.4 |
| 14/04/2017 | 2.4 |
| 14/04/2017 | 2.4 |
| 14/04/2017 | 2.4 |
| 14/04/2017 | 2.4 |
| 14/04/2017 | 2.5 |
| 14/04/2017 | 2.8 |
| 14/04/2017 | 3.1 |
| 14/04/2017 | 3.3 |
| 14/04/2017 | 3.4 |
| 14/04/2017 | 3.4 |
| 14/04/2017 | 3.3 |
| 14/04/2017 | 3.2 |
| 14/04/2017 | 3.1 |
| 14/04/2017 | 3.1 |
| 14/04/2017 | 3.1 |
| 14/04/2017 | 3.2 |
| 14/04/2017 | 3.3 |
| 14/04/2017 | 3.4 |
| 14/04/2017 | 3.2 |
| 14/04/2017 | 3 |
| 14/04/2017 | 2.8 |
| 14/04/2017 | 2.7 |
| 15/04/2017 | 2.5 |
| 15/04/2017 | 2.5 |
| 15/04/2017 | 2.4 |
| 15/04/2017 | 2.4 |
| 15/04/2017 | 2.5 |
| 15/04/2017 | 2.5 |
| 15/04/2017 | 2.7 |
| 15/04/2017 | 3.1 |
| 15/04/2017 | 3.4 |
| 15/04/2017 | 3.7 |
| 15/04/2017 | 3.7 |
| 15/04/2017 | 3.7 |
| 15/04/2017 | 3.6 |
| 15/04/2017 | 3.5 |
| 15/04/2017 | 3.4 |
| 15/04/2017 | 3.4 |
| 15/04/2017 | 3.4 |
| 15/04/2017 | 3.5 |
| 15/04/2017 | 3.6 |
| 15/04/2017 | 3.6 |
| 15/04/2017 | 3.4 |
| 15/04/2017 | 3.1 |
| 15/04/2017 | 2.8 |
| 15/04/2017 | 2.5 |
| 16/04/2017 | 2.4 |
| 16/04/2017 | 2.3 |
| 16/04/2017 | 2.3 |
| 16/04/2017 | 2.3 |
| 16/04/2017 | 2.3 |
| 16/04/2017 | 2.4 |
| 16/04/2017 | 2.5 |
| 16/04/2017 | 2.7 |
| 16/04/2017 | 3 |
| 16/04/2017 | 3.1 |
| 16/04/2017 | 3.2 |
| 16/04/2017 | 3.2 |
| 16/04/2017 | 3.1 |
| 16/04/2017 | 3 |
| 16/04/2017 | 2.9 |
| 16/04/2017 | 2.9 |
| 16/04/2017 | 2.9 |
| 16/04/2017 | 3.1 |
| 16/04/2017 | 3.2 |
| 16/04/2017 | 3.2 |
| 16/04/2017 | 3.1 |
| 16/04/2017 | 3 |
| 16/04/2017 | 2.7 |
| 16/04/2017 | 2.5 |
| 17/04/2017 | 2.4 |
| 17/04/2017 | 2.3 |
| 17/04/2017 | 2.3 |
| 17/04/2017 | 2.3 |
| 17/04/2017 | 2.3 |
| 17/04/2017 | 2.4 |
| 17/04/2017 | 2.5 |
| 17/04/2017 | 2.7 |
| 17/04/2017 | 3 |
| 17/04/2017 | 3.1 |
| 17/04/2017 | 3.2 |
| 17/04/2017 | 3.2 |
| 17/04/2017 | 3.1 |
| 17/04/2017 | 3 |
| 17/04/2017 | 2.9 |
| 17/04/2017 | 2.9 |
| 17/04/2017 | 3 |
| 17/04/2017 | 3.1 |
| 17/04/2017 | 3.2 |
| 17/04/2017 | 3.2 |
| 17/04/2017 | 3.1 |
| 17/04/2017 | 2.9 |
| 17/04/2017 | 2.7 |
| 17/04/2017 | 2.7 |
| 18/04/2017 | 2.5 |
| 18/04/2017 | 2.5 |
| 18/04/2017 | 2.5 |
| 18/04/2017 | 2.6 |
| 18/04/2017 | 2.8 |
| 18/04/2017 | 3.4 |
| 18/04/2017 | 3.9 |
| 18/04/2017 | 4.3 |
| 18/04/2017 | 4.4 |
| 18/04/2017 | 4.5 |
| 18/04/2017 | 4.5 |
| 18/04/2017 | 4.6 |
| 18/04/2017 | 4.5 |
| 18/04/2017 | 4.4 |
| 18/04/2017 | 4.4 |
| 18/04/2017 | 4.3 |
| 18/04/2017 | 4.3 |
| 18/04/2017 | 4.3 |
| 18/04/2017 | 4.3 |
| 18/04/2017 | 4.3 |
| 18/04/2017 | 3.9 |
| 18/04/2017 | 3.4 |
| 18/04/2017 | 3 |
| 18/04/2017 | 2.7 |
| 19/04/2017 | 2.6 |
| 19/04/2017 | 2.5 |
| 19/04/2017 | 2.5 |
| 19/04/2017 | 2.6 |
| 19/04/2017 | 2.9 |
| 19/04/2017 | 3.4 |
| 19/04/2017 | 3.9 |
| 19/04/2017 | 4.3 |
| 19/04/2017 | 4.5 |
| 19/04/2017 | 4.6 |
| 19/04/2017 | 4.6 |
| 19/04/2017 | 4.6 |
| 19/04/2017 | 4.5 |
| 19/04/2017 | 4.5 |
| 19/04/2017 | 4.4 |
| 19/04/2017 | 4.3 |
| 19/04/2017 | 4.3 |
| 19/04/2017 | 4.3 |
| 19/04/2017 | 4.3 |
| 19/04/2017 | 4.3 |
| 19/04/2017 | 3.9 |
| 19/04/2017 | 3.4 |
| 19/04/2017 | 3 |
| 19/04/2017 | 2.7 |
| 20/04/2017 | 2.6 |
| 20/04/2017 | 2.5 |
| 20/04/2017 | 2.5 |
| 20/04/2017 | 2.6 |
| 20/04/2017 | 2.8 |
| 20/04/2017 | 3.4 |
| 20/04/2017 | 3.9 |
| 20/04/2017 | 4.3 |
| 20/04/2017 | 4.4 |
| 20/04/2017 | 4.5 |
| 20/04/2017 | 4.6 |
| 20/04/2017 | 4.6 |
| 20/04/2017 | 4.5 |
| 20/04/2017 | 4.4 |
| 20/04/2017 | 4.3 |
| 20/04/2017 | 4.3 |
| 20/04/2017 | 4.3 |
| 20/04/2017 | 4.2 |
| 20/04/2017 | 4.3 |
| 20/04/2017 | 4.2 |
| 20/04/2017 | 3.9 |
| 20/04/2017 | 3.4 |
| 20/04/2017 | 3 |
| 20/04/2017 | 2.7 |
| 21/04/2017 | 2.5 |
| 21/04/2017 | 2.5 |
| 21/04/2017 | 2.5 |
| 21/04/2017 | 2.6 |
| 21/04/2017 | 2.8 |
| 21/04/2017 | 3.3 |
| 21/04/2017 | 3.9 |
| 21/04/2017 | 4.2 |
| 21/04/2017 | 4.4 |
| 21/04/2017 | 4.5 |
| 21/04/2017 | 4.5 |
| 21/04/2017 | 4.5 |
| 21/04/2017 | 4.4 |
| 21/04/2017 | 4.3 |
| 21/04/2017 | 4.2 |
| 21/04/2017 | 4.2 |
| 21/04/2017 | 4.2 |
| 21/04/2017 | 4.1 |
| 21/04/2017 | 4.1 |
| 21/04/2017 | 4.1 |
| 21/04/2017 | 3.8 |
| 21/04/2017 | 3.3 |
| 21/04/2017 | 3 |
| 21/04/2017 | 2.7 |
| 22/04/2017 | 2.5 |
| 22/04/2017 | 2.5 |
| 22/04/2017 | 2.4 |
| 22/04/2017 | 2.4 |
| 22/04/2017 | 2.5 |
| 22/04/2017 | 2.6 |
| 22/04/2017 | 2.8 |
| 22/04/2017 | 3.2 |
| 22/04/2017 | 3.5 |
| 22/04/2017 | 3.7 |
| 22/04/2017 | 3.8 |
| 22/04/2017 | 3.8 |
| 22/04/2017 | 3.7 |
| 22/04/2017 | 3.5 |
| 22/04/2017 | 3.5 |
| 22/04/2017 | 3.5 |
| 22/04/2017 | 3.5 |
| 22/04/2017 | 3.5 |
| 22/04/2017 | 3.6 |
| 22/04/2017 | 3.6 |
| 22/04/2017 | 3.4 |
| 22/04/2017 | 3.1 |
| 22/04/2017 | 2.8 |
| 22/04/2017 | 2.6 |
| 23/04/2017 | 2.4 |
| 23/04/2017 | 2.4 |
| 23/04/2017 | 2.3 |
| 23/04/2017 | 2.3 |
| 23/04/2017 | 2.4 |
| 23/04/2017 | 2.4 |
| 23/04/2017 | 2.5 |
| 23/04/2017 | 2.8 |
| 23/04/2017 | 3 |
| 23/04/2017 | 3.2 |
| 23/04/2017 | 3.3 |
| 23/04/2017 | 3.4 |
| 23/04/2017 | 3.3 |
| 23/04/2017 | 3.2 |
| 23/04/2017 | 3.2 |
| 23/04/2017 | 3.2 |
| 23/04/2017 | 3.2 |
| 23/04/2017 | 3.3 |
| 23/04/2017 | 3.3 |
| 23/04/2017 | 3.5 |
| 23/04/2017 | 3.4 |
| 23/04/2017 | 3.1 |
| 23/04/2017 | 2.9 |
| 23/04/2017 | 2.6 |
| 24/04/2017 | 2.4 |
| 24/04/2017 | 2.4 |
| 24/04/2017 | 2.4 |
| 24/04/2017 | 2.5 |
| 24/04/2017 | 2.8 |
| 24/04/2017 | 3.3 |
| 24/04/2017 | 3.8 |
| 24/04/2017 | 4.2 |
| 24/04/2017 | 4.4 |
| 24/04/2017 | 4.5 |
| 24/04/2017 | 4.5 |
| 24/04/2017 | 4.5 |
| 24/04/2017 | 4.5 |
| 24/04/2017 | 4.4 |
| 24/04/2017 | 4.3 |
| 24/04/2017 | 4.3 |
| 24/04/2017 | 4.3 |
| 24/04/2017 | 4.2 |
| 24/04/2017 | 4.2 |
| 24/04/2017 | 4.2 |
| 24/04/2017 | 3.9 |
| 24/04/2017 | 3.4 |
| 24/04/2017 | 3 |
| 24/04/2017 | 2.7 |
| 25/04/2017 | 2.5 |
| 25/04/2017 | 2.5 |
| 25/04/2017 | 2.4 |
| 25/04/2017 | 2.6 |
| 25/04/2017 | 2.8 |
| 25/04/2017 | 3.3 |
| 25/04/2017 | 3.9 |
| 25/04/2017 | 4.2 |
| 25/04/2017 | 4.4 |
| 25/04/2017 | 4.5 |
| 25/04/2017 | 4.5 |
| 25/04/2017 | 4.6 |
| 25/04/2017 | 4.5 |
| 25/04/2017 | 4.4 |
| 25/04/2017 | 4.3 |
| 25/04/2017 | 4.3 |
| 25/04/2017 | 4.4 |
| 25/04/2017 | 4.3 |
| 25/04/2017 | 4.3 |
| 25/04/2017 | 4.2 |
| 25/04/2017 | 3.9 |
| 25/04/2017 | 3.4 |
| 25/04/2017 | 3 |
| 25/04/2017 | 2.7 |
| 26/04/2017 | 2.6 |
| 26/04/2017 | 2.5 |
| 26/04/2017 | 2.5 |
| 26/04/2017 | 2.6 |
| 26/04/2017 | 2.8 |
| 26/04/2017 | 3.4 |
| 26/04/2017 | 3.9 |
| 26/04/2017 | 4.3 |
| 26/04/2017 | 4.4 |
| 26/04/2017 | 4.5 |
| 26/04/2017 | 4.6 |
| 26/04/2017 | 4.6 |
| 26/04/2017 | 4.5 |
| 26/04/2017 | 4.5 |
| 26/04/2017 | 4.4 |
| 26/04/2017 | 4.3 |
| 26/04/2017 | 4.3 |
| 26/04/2017 | 4.3 |
| 26/04/2017 | 4.3 |
| 26/04/2017 | 4.2 |
| 26/04/2017 | 3.9 |
| 26/04/2017 | 3.4 |
| 26/04/2017 | 3 |
| 26/04/2017 | 2.7 |
| 27/04/2017 | 2.6 |
| 27/04/2017 | 2.5 |
| 27/04/2017 | 2.5 |
| 27/04/2017 | 2.6 |
| 27/04/2017 | 2.8 |
| 27/04/2017 | 3.3 |
| 27/04/2017 | 3.9 |
| 27/04/2017 | 4.2 |
| 27/04/2017 | 4.4 |
| 27/04/2017 | 4.5 |
| 27/04/2017 | 4.5 |
| 27/04/2017 | 4.6 |
| 27/04/2017 | 4.5 |
| 27/04/2017 | 4.4 |
| 27/04/2017 | 4.3 |
| 27/04/2017 | 4.3 |
| 27/04/2017 | 4.3 |
| 27/04/2017 | 4.2 |
| 27/04/2017 | 4.2 |
| 27/04/2017 | 4.2 |
| 27/04/2017 | 3.9 |
| 27/04/2017 | 3.4 |
| 27/04/2017 | 3 |
| 27/04/2017 | 2.7 |
| 28/04/2017 | 2.5 |
| 28/04/2017 | 2.5 |
| 28/04/2017 | 2.5 |
| 28/04/2017 | 2.6 |
| 28/04/2017 | 2.8 |
| 28/04/2017 | 3.3 |
| 28/04/2017 | 3.8 |
| 28/04/2017 | 4.2 |
| 28/04/2017 | 4.4 |
| 28/04/2017 | 4.5 |
| 28/04/2017 | 4.5 |
| 28/04/2017 | 4.5 |
| 28/04/2017 | 4.4 |
| 28/04/2017 | 4.3 |
| 28/04/2017 | 4.2 |
| 28/04/2017 | 4.2 |
| 28/04/2017 | 4.2 |
| 28/04/2017 | 4.1 |
| 28/04/2017 | 4.1 |
| 28/04/2017 | 4 |
| 28/04/2017 | 3.7 |
| 28/04/2017 | 3.3 |
| 28/04/2017 | 3 |
| 28/04/2017 | 2.7 |
| 29/04/2017 | 2.5 |
| 29/04/2017 | 2.4 |
| 29/04/2017 | 2.4 |
| 29/04/2017 | 2.4 |
| 29/04/2017 | 2.5 |
| 29/04/2017 | 2.6 |
| 29/04/2017 | 2.8 |
| 29/04/2017 | 3.2 |
| 29/04/2017 | 3.5 |
| 29/04/2017 | 3.7 |
| 29/04/2017 | 3.8 |
| 29/04/2017 | 3.8 |
| 29/04/2017 | 3.7 |
| 29/04/2017 | 3.5 |
| 29/04/2017 | 3.5 |
| 29/04/2017 | 3.4 |
| 29/04/2017 | 3.5 |
| 29/04/2017 | 3.5 |
| 29/04/2017 | 3.5 |
| 29/04/2017 | 3.6 |
| 29/04/2017 | 3.4 |
| 29/04/2017 | 3.1 |
| 29/04/2017 | 2.8 |
| 29/04/2017 | 2.6 |
| 30/04/2017 | 2.4 |
| 30/04/2017 | 2.4 |
| 30/04/2017 | 2.3 |
| 30/04/2017 | 2.3 |
| 30/04/2017 | 2.3 |
| 30/04/2017 | 2.4 |
| 30/04/2017 | 2.5 |
| 30/04/2017 | 2.8 |
| 30/04/2017 | 3 |
| 30/04/2017 | 3.2 |
| 30/04/2017 | 3.3 |
| 30/04/2017 | 3.4 |
| 30/04/2017 | 3.3 |
| 30/04/2017 | 3.2 |
| 30/04/2017 | 3.2 |
| 30/04/2017 | 3.2 |
| 30/04/2017 | 3.2 |
| 30/04/2017 | 3.3 |
| 30/04/2017 | 3.3 |
| 30/04/2017 | 3.4 |
| 30/04/2017 | 3.3 |
| 30/04/2017 | 3.1 |
| 30/04/2017 | 2.9 |
| 30/04/2017 | 2.7 |
| 01/05/2017 | 2.5 |
| 01/05/2017 | 2.4 |
| 01/05/2017 | 2.4 |
| 01/05/2017 | 2.4 |
| 01/05/2017 | 2.4 |
| 01/05/2017 | 2.5 |
| 01/05/2017 | 2.6 |
| 01/05/2017 | 2.9 |
| 01/05/2017 | 3.1 |
| 01/05/2017 | 3.3 |
| 01/05/2017 | 3.4 |
| 01/05/2017 | 3.4 |
| 01/05/2017 | 3.3 |
| 01/05/2017 | 3.2 |
| 01/05/2017 | 3.2 |
| 01/05/2017 | 3.2 |
| 01/05/2017 | 3.2 |
| 01/05/2017 | 3.2 |
| 01/05/2017 | 3.3 |
| 01/05/2017 | 3.3 |
| 01/05/2017 | 3.2 |
| 01/05/2017 | 3 |
| 01/05/2017 | 2.8 |
| 01/05/2017 | 2.7 |
| 02/05/2017 | 2.5 |
| 02/05/2017 | 2.4 |
| 02/05/2017 | 2.4 |
| 02/05/2017 | 2.6 |
| 02/05/2017 | 2.8 |
| 02/05/2017 | 3.3 |
| 02/05/2017 | 3.9 |
| 02/05/2017 | 4.2 |
| 02/05/2017 | 4.4 |
| 02/05/2017 | 4.5 |
| 02/05/2017 | 4.5 |
| 02/05/2017 | 4.6 |
| 02/05/2017 | 4.5 |
| 02/05/2017 | 4.4 |
| 02/05/2017 | 4.4 |
| 02/05/2017 | 4.3 |
| 02/05/2017 | 4.3 |
| 02/05/2017 | 4.3 |
| 02/05/2017 | 4.3 |
| 02/05/2017 | 4.2 |
| 02/05/2017 | 3.9 |
| 02/05/2017 | 3.4 |
| 02/05/2017 | 3 |
| 02/05/2017 | 2.7 |
| 03/05/2017 | 2.5 |
| 03/05/2017 | 2.5 |
| 03/05/2017 | 2.5 |
| 03/05/2017 | 2.6 |
| 03/05/2017 | 2.8 |
| 03/05/2017 | 3.3 |
| 03/05/2017 | 3.9 |
| 03/05/2017 | 4.3 |
| 03/05/2017 | 4.4 |
| 03/05/2017 | 4.5 |
| 03/05/2017 | 4.6 |
| 03/05/2017 | 4.6 |
| 03/05/2017 | 4.5 |
| 03/05/2017 | 4.5 |
| 03/05/2017 | 4.4 |
| 03/05/2017 | 4.3 |
| 03/05/2017 | 4.3 |
| 03/05/2017 | 4.3 |
| 03/05/2017 | 4.3 |
| 03/05/2017 | 4.1 |
| 03/05/2017 | 3.9 |
| 03/05/2017 | 3.4 |
| 03/05/2017 | 3 |
| 03/05/2017 | 2.7 |
| 04/05/2017 | 2.5 |
| 04/05/2017 | 2.5 |
| 04/05/2017 | 2.5 |
| 04/05/2017 | 2.6 |
| 04/05/2017 | 2.8 |
| 04/05/2017 | 3.3 |
| 04/05/2017 | 3.9 |
| 04/05/2017 | 4.2 |
| 04/05/2017 | 4.4 |
| 04/05/2017 | 4.5 |
| 04/05/2017 | 4.5 |
| 04/05/2017 | 4.6 |
| 04/05/2017 | 4.5 |
| 04/05/2017 | 4.4 |
| 04/05/2017 | 4.3 |
| 04/05/2017 | 4.3 |
| 04/05/2017 | 4.3 |
| 04/05/2017 | 4.3 |
| 04/05/2017 | 4.2 |
| 04/05/2017 | 4.1 |
| 04/05/2017 | 3.8 |
| 04/05/2017 | 3.4 |
| 04/05/2017 | 3 |
| 04/05/2017 | 2.7 |
| 05/05/2017 | 2.5 |
| 05/05/2017 | 2.5 |
| 05/05/2017 | 2.4 |
| 05/05/2017 | 2.6 |
| 05/05/2017 | 2.8 |
| 05/05/2017 | 3.3 |
| 05/05/2017 | 3.8 |
| 05/05/2017 | 4.2 |
| 05/05/2017 | 4.4 |
| 05/05/2017 | 4.5 |
| 05/05/2017 | 4.5 |
| 05/05/2017 | 4.5 |
| 05/05/2017 | 4.4 |
| 05/05/2017 | 4.3 |
| 05/05/2017 | 4.2 |
| 05/05/2017 | 4.2 |
| 05/05/2017 | 4.2 |
| 05/05/2017 | 4.1 |
| 05/05/2017 | 4.1 |
| 05/05/2017 | 3.9 |
| 05/05/2017 | 3.7 |
| 05/05/2017 | 3.3 |
| 05/05/2017 | 3 |
| 05/05/2017 | 2.7 |
| 06/05/2017 | 2.5 |
| 06/05/2017 | 2.4 |
| 06/05/2017 | 2.4 |
| 06/05/2017 | 2.4 |
| 06/05/2017 | 2.5 |
| 06/05/2017 | 2.6 |
| 06/05/2017 | 2.8 |
| 06/05/2017 | 3.1 |
| 06/05/2017 | 3.5 |
| 06/05/2017 | 3.7 |
| 06/05/2017 | 3.8 |
| 06/05/2017 | 3.8 |
| 06/05/2017 | 3.7 |
| 06/05/2017 | 3.5 |
| 06/05/2017 | 3.5 |
| 06/05/2017 | 3.4 |
| 06/05/2017 | 3.5 |
| 06/05/2017 | 3.5 |
| 06/05/2017 | 3.5 |
| 06/05/2017 | 3.5 |
| 06/05/2017 | 3.4 |
| 06/05/2017 | 3.1 |
| 06/05/2017 | 2.8 |
| 06/05/2017 | 2.6 |
| 07/05/2017 | 2.4 |
| 07/05/2017 | 2.4 |
| 07/05/2017 | 2.3 |
| 07/05/2017 | 2.3 |
| 07/05/2017 | 2.3 |
| 07/05/2017 | 2.4 |
| 07/05/2017 | 2.5 |
| 07/05/2017 | 2.7 |
| 07/05/2017 | 3 |
| 07/05/2017 | 3.2 |
| 07/05/2017 | 3.3 |
| 07/05/2017 | 3.4 |
| 07/05/2017 | 3.3 |
| 07/05/2017 | 3.2 |
| 07/05/2017 | 3.2 |
| 07/05/2017 | 3.2 |
| 07/05/2017 | 3.2 |
| 07/05/2017 | 3.3 |
| 07/05/2017 | 3.3 |
| 07/05/2017 | 3.4 |
| 07/05/2017 | 3.3 |
| 07/05/2017 | 3.1 |
| 07/05/2017 | 2.8 |
| 07/05/2017 | 2.6 |
| 08/05/2017 | 2.4 |
| 08/05/2017 | 2.4 |
| 08/05/2017 | 2.4 |
| 08/05/2017 | 2.5 |
| 08/05/2017 | 2.7 |
| 08/05/2017 | 3.3 |
| 08/05/2017 | 3.8 |
| 08/05/2017 | 4.2 |
| 08/05/2017 | 4.3 |
| 08/05/2017 | 4.4 |
| 08/05/2017 | 4.5 |
| 08/05/2017 | 4.5 |
| 08/05/2017 | 4.5 |
| 08/05/2017 | 4.4 |
| 08/05/2017 | 4.3 |
| 08/05/2017 | 4.3 |
| 08/05/2017 | 4.3 |
| 08/05/2017 | 4.2 |
| 08/05/2017 | 4.2 |
| 08/05/2017 | 4.1 |
| 08/05/2017 | 3.8 |
| 08/05/2017 | 3.4 |
| 08/05/2017 | 3 |
| 08/05/2017 | 2.7 |
| 09/05/2017 | 2.5 |
| 09/05/2017 | 2.4 |
| 09/05/2017 | 2.4 |
| 09/05/2017 | 2.5 |
| 09/05/2017 | 2.8 |
| 09/05/2017 | 3.3 |
| 09/05/2017 | 3.8 |
| 09/05/2017 | 4.2 |
| 09/05/2017 | 4.4 |
| 09/05/2017 | 4.5 |
| 09/05/2017 | 4.5 |
| 09/05/2017 | 4.6 |
| 09/05/2017 | 4.5 |
| 09/05/2017 | 4.4 |
| 09/05/2017 | 4.4 |
| 09/05/2017 | 4.3 |
| 09/05/2017 | 4.3 |
| 09/05/2017 | 4.3 |
| 09/05/2017 | 4.3 |
| 09/05/2017 | 4.1 |
| 09/05/2017 | 3.8 |
| 09/05/2017 | 3.4 |
| 09/05/2017 | 3 |
| 09/05/2017 | 2.7 |
| 10/05/2017 | 2.5 |
| 10/05/2017 | 2.5 |
| 10/05/2017 | 2.5 |
| 10/05/2017 | 2.6 |
| 10/05/2017 | 2.8 |
| 10/05/2017 | 3.3 |
| 10/05/2017 | 3.9 |
| 10/05/2017 | 4.2 |
| 10/05/2017 | 4.4 |
| 10/05/2017 | 4.5 |
| 10/05/2017 | 4.6 |
| 10/05/2017 | 4.6 |
| 10/05/2017 | 4.5 |
| 10/05/2017 | 4.5 |
| 10/05/2017 | 4.4 |
| 10/05/2017 | 4.3 |
| 10/05/2017 | 4.3 |
| 10/05/2017 | 4.3 |
| 10/05/2017 | 4.3 |
| 10/05/2017 | 4.1 |
| 10/05/2017 | 3.8 |
| 10/05/2017 | 3.4 |
| 10/05/2017 | 3 |
| 10/05/2017 | 2.7 |
| 11/05/2017 | 2.5 |
| 11/05/2017 | 2.5 |
| 11/05/2017 | 2.5 |
| 11/05/2017 | 2.6 |
| 11/05/2017 | 2.8 |
| 11/05/2017 | 3.3 |
| 11/05/2017 | 3.9 |
| 11/05/2017 | 4.2 |
| 11/05/2017 | 4.4 |
| 11/05/2017 | 4.5 |
| 11/05/2017 | 4.5 |
| 11/05/2017 | 4.6 |
| 11/05/2017 | 4.5 |
| 11/05/2017 | 4.4 |
| 11/05/2017 | 4.3 |
| 11/05/2017 | 4.3 |
| 11/05/2017 | 4.3 |
| 11/05/2017 | 4.3 |
| 11/05/2017 | 4.2 |
| 11/05/2017 | 4 |
| 11/05/2017 | 3.8 |
| 11/05/2017 | 3.4 |
| 11/05/2017 | 3 |
| 11/05/2017 | 2.7 |
| 12/05/2017 | 2.5 |
| 12/05/2017 | 2.5 |
| 12/05/2017 | 2.4 |
| 12/05/2017 | 2.5 |
| 12/05/2017 | 2.8 |
| 12/05/2017 | 3.3 |
| 12/05/2017 | 3.8 |
| 12/05/2017 | 4.2 |
| 12/05/2017 | 4.4 |
| 12/05/2017 | 4.5 |
| 12/05/2017 | 4.5 |
| 12/05/2017 | 4.5 |
| 12/05/2017 | 4.4 |
| 12/05/2017 | 4.3 |
| 12/05/2017 | 4.2 |
| 12/05/2017 | 4.2 |
| 12/05/2017 | 4.2 |
| 12/05/2017 | 4.1 |
| 12/05/2017 | 4.1 |
| 12/05/2017 | 3.9 |
| 12/05/2017 | 3.6 |
| 12/05/2017 | 3.3 |
| 12/05/2017 | 3 |
| 12/05/2017 | 2.7 |
| 13/05/2017 | 2.5 |
| 13/05/2017 | 2.4 |
| 13/05/2017 | 2.4 |
| 13/05/2017 | 2.4 |
| 13/05/2017 | 2.4 |
| 13/05/2017 | 2.5 |
| 13/05/2017 | 2.8 |
| 13/05/2017 | 3.1 |
| 13/05/2017 | 3.5 |
| 13/05/2017 | 3.7 |
| 13/05/2017 | 3.8 |
| 13/05/2017 | 3.8 |
| 13/05/2017 | 3.7 |
| 13/05/2017 | 3.5 |
| 13/05/2017 | 3.5 |
| 13/05/2017 | 3.4 |
| 13/05/2017 | 3.5 |
| 13/05/2017 | 3.5 |
| 13/05/2017 | 3.5 |
| 13/05/2017 | 3.4 |
| 13/05/2017 | 3.3 |
| 13/05/2017 | 3.1 |
| 13/05/2017 | 2.8 |
| 13/05/2017 | 2.6 |
| 14/05/2017 | 2.4 |
| 14/05/2017 | 2.4 |
| 14/05/2017 | 2.3 |
| 14/05/2017 | 2.3 |
| 14/05/2017 | 2.3 |
| 14/05/2017 | 2.3 |
| 14/05/2017 | 2.5 |
| 14/05/2017 | 2.7 |
| 14/05/2017 | 3 |
| 14/05/2017 | 3.2 |
| 14/05/2017 | 3.3 |
| 14/05/2017 | 3.4 |
| 14/05/2017 | 3.3 |
| 14/05/2017 | 3.2 |
| 14/05/2017 | 3.2 |
| 14/05/2017 | 3.2 |
| 14/05/2017 | 3.2 |
| 14/05/2017 | 3.3 |
| 14/05/2017 | 3.3 |
| 14/05/2017 | 3.3 |
| 14/05/2017 | 3.3 |
| 14/05/2017 | 3.1 |
| 14/05/2017 | 2.8 |
| 14/05/2017 | 2.6 |
| 15/05/2017 | 2.4 |
| 15/05/2017 | 2.4 |
| 15/05/2017 | 2.4 |
| 15/05/2017 | 2.5 |
| 15/05/2017 | 2.7 |
| 15/05/2017 | 3.2 |
| 15/05/2017 | 3.8 |
| 15/05/2017 | 4.1 |
| 15/05/2017 | 4.3 |
| 15/05/2017 | 4.4 |
| 15/05/2017 | 4.5 |
| 15/05/2017 | 4.5 |
| 15/05/2017 | 4.5 |
| 15/05/2017 | 4.4 |
| 15/05/2017 | 4.3 |
| 15/05/2017 | 4.3 |
| 15/05/2017 | 4.3 |
| 15/05/2017 | 4.3 |
| 15/05/2017 | 4.2 |
| 15/05/2017 | 4 |
| 15/05/2017 | 3.8 |
| 15/05/2017 | 3.4 |
| 15/05/2017 | 3 |
| 15/05/2017 | 2.7 |
| 16/05/2017 | 2.5 |
| 16/05/2017 | 2.4 |
| 16/05/2017 | 2.4 |
| 16/05/2017 | 2.5 |
| 16/05/2017 | 2.8 |
| 16/05/2017 | 3.3 |
| 16/05/2017 | 3.8 |
| 16/05/2017 | 4.2 |
| 16/05/2017 | 4.4 |
| 16/05/2017 | 4.5 |
| 16/05/2017 | 4.5 |
| 16/05/2017 | 4.6 |
| 16/05/2017 | 4.5 |
| 16/05/2017 | 4.4 |
| 16/05/2017 | 4.4 |
| 16/05/2017 | 4.3 |
| 16/05/2017 | 4.3 |
| 16/05/2017 | 4.3 |
| 16/05/2017 | 4.2 |
| 16/05/2017 | 4 |
| 16/05/2017 | 3.8 |
| 16/05/2017 | 3.4 |
| 16/05/2017 | 3 |
| 16/05/2017 | 2.7 |
| 17/05/2017 | 2.5 |
| 17/05/2017 | 2.5 |
| 17/05/2017 | 2.4 |
| 17/05/2017 | 2.6 |
| 17/05/2017 | 2.8 |
| 17/05/2017 | 3.3 |
| 17/05/2017 | 3.9 |
| 17/05/2017 | 4.2 |
| 17/05/2017 | 4.4 |
| 17/05/2017 | 4.5 |
| 17/05/2017 | 4.6 |
| 17/05/2017 | 4.6 |
| 17/05/2017 | 4.5 |
| 17/05/2017 | 4.5 |
| 17/05/2017 | 4.4 |
| 17/05/2017 | 4.3 |
| 17/05/2017 | 4.3 |
| 17/05/2017 | 4.3 |
| 17/05/2017 | 4.3 |
| 17/05/2017 | 4 |
| 17/05/2017 | 3.8 |
| 17/05/2017 | 3.4 |
| 17/05/2017 | 3 |
| 17/05/2017 | 2.7 |
| 18/05/2017 | 2.5 |
| 18/05/2017 | 2.5 |
| 18/05/2017 | 2.4 |
| 18/05/2017 | 2.5 |
| 18/05/2017 | 2.8 |
| 18/05/2017 | 3.3 |
| 18/05/2017 | 3.8 |
| 18/05/2017 | 4.2 |
| 18/05/2017 | 4.4 |
| 18/05/2017 | 4.5 |
| 18/05/2017 | 4.6 |
| 18/05/2017 | 4.6 |
| 18/05/2017 | 4.5 |
| 18/05/2017 | 4.4 |
| 18/05/2017 | 4.3 |
| 18/05/2017 | 4.3 |
| 18/05/2017 | 4.3 |
| 18/05/2017 | 4.3 |
| 18/05/2017 | 4.2 |
| 18/05/2017 | 4 |
| 18/05/2017 | 3.7 |
| 18/05/2017 | 3.4 |
| 18/05/2017 | 3 |
| 18/05/2017 | 2.7 |
| 19/05/2017 | 2.5 |
| 19/05/2017 | 2.5 |
| 19/05/2017 | 2.4 |
| 19/05/2017 | 2.5 |
| 19/05/2017 | 2.7 |
| 19/05/2017 | 3.3 |
| 19/05/2017 | 3.8 |
| 19/05/2017 | 4.2 |
| 19/05/2017 | 4.4 |
| 19/05/2017 | 4.5 |
| 19/05/2017 | 4.5 |
| 19/05/2017 | 4.5 |
| 19/05/2017 | 4.5 |
| 19/05/2017 | 4.3 |
| 19/05/2017 | 4.2 |
| 19/05/2017 | 4.2 |
| 19/05/2017 | 4.1 |
| 19/05/2017 | 4.1 |
| 19/05/2017 | 4 |
| 19/05/2017 | 3.8 |
| 19/05/2017 | 3.6 |
| 19/05/2017 | 3.3 |
| 19/05/2017 | 3 |
| 19/05/2017 | 2.7 |
| 20/05/2017 | 2.5 |
| 20/05/2017 | 2.4 |
| 20/05/2017 | 2.4 |
| 20/05/2017 | 2.4 |
| 20/05/2017 | 2.4 |
| 20/05/2017 | 2.5 |
| 20/05/2017 | 2.8 |
| 20/05/2017 | 3.1 |
| 20/05/2017 | 3.4 |
| 20/05/2017 | 3.7 |
| 20/05/2017 | 3.8 |
| 20/05/2017 | 3.8 |
| 20/05/2017 | 3.7 |
| 20/05/2017 | 3.6 |
| 20/05/2017 | 3.5 |
| 20/05/2017 | 3.4 |
| 20/05/2017 | 3.5 |
| 20/05/2017 | 3.5 |
| 20/05/2017 | 3.5 |
| 20/05/2017 | 3.4 |
| 20/05/2017 | 3.3 |
| 20/05/2017 | 3.1 |
| 20/05/2017 | 2.8 |
| 20/05/2017 | 2.6 |
| 21/05/2017 | 2.4 |
| 21/05/2017 | 2.4 |
| 21/05/2017 | 2.3 |
| 21/05/2017 | 2.3 |
| 21/05/2017 | 2.3 |
| 21/05/2017 | 2.3 |
| 21/05/2017 | 2.5 |
| 21/05/2017 | 2.7 |
| 21/05/2017 | 3 |
| 21/05/2017 | 3.2 |
| 21/05/2017 | 3.3 |
| 21/05/2017 | 3.4 |
| 21/05/2017 | 3.3 |
| 21/05/2017 | 3.2 |
| 21/05/2017 | 3.2 |
| 21/05/2017 | 3.2 |
| 21/05/2017 | 3.2 |
| 21/05/2017 | 3.3 |
| 21/05/2017 | 3.3 |
| 21/05/2017 | 3.3 |
| 21/05/2017 | 3.2 |
| 21/05/2017 | 3.1 |
| 21/05/2017 | 2.8 |
| 21/05/2017 | 2.6 |
| 22/05/2017 | 2.4 |
| 22/05/2017 | 2.4 |
| 22/05/2017 | 2.4 |
| 22/05/2017 | 2.5 |
| 22/05/2017 | 2.7 |
| 22/05/2017 | 3.2 |
| 22/05/2017 | 3.8 |
| 22/05/2017 | 4.1 |
| 22/05/2017 | 4.3 |
| 22/05/2017 | 4.4 |
| 22/05/2017 | 4.5 |
| 22/05/2017 | 4.5 |
| 22/05/2017 | 4.5 |
| 22/05/2017 | 4.4 |
| 22/05/2017 | 4.3 |
| 22/05/2017 | 4.2 |
| 22/05/2017 | 4.2 |
| 22/05/2017 | 4.3 |
| 22/05/2017 | 4.2 |
| 22/05/2017 | 3.9 |
| 22/05/2017 | 3.7 |
| 22/05/2017 | 3.4 |
| 22/05/2017 | 3 |
| 22/05/2017 | 2.7 |
| 23/05/2017 | 2.5 |
| 23/05/2017 | 2.4 |
| 23/05/2017 | 2.4 |
| 23/05/2017 | 2.5 |
| 23/05/2017 | 2.7 |
| 23/05/2017 | 3.3 |
| 23/05/2017 | 3.8 |
| 23/05/2017 | 4.2 |
| 23/05/2017 | 4.4 |
| 23/05/2017 | 4.5 |
| 23/05/2017 | 4.5 |
| 23/05/2017 | 4.6 |
| 23/05/2017 | 4.5 |
| 23/05/2017 | 4.4 |
| 23/05/2017 | 4.4 |
| 23/05/2017 | 4.3 |
| 23/05/2017 | 4.3 |
| 23/05/2017 | 4.3 |
| 23/05/2017 | 4.2 |
| 23/05/2017 | 4 |
| 23/05/2017 | 3.7 |
| 23/05/2017 | 3.4 |
| 23/05/2017 | 3 |
| 23/05/2017 | 2.7 |
| 24/05/2017 | 2.5 |
| 24/05/2017 | 2.5 |
| 24/05/2017 | 2.4 |
| 24/05/2017 | 2.5 |
| 24/05/2017 | 2.7 |
| 24/05/2017 | 3.1 |
| 24/05/2017 | 3.7 |
| 24/05/2017 | 4.1 |
| 24/05/2017 | 4.3 |
| 24/05/2017 | 4.5 |
| 24/05/2017 | 4.5 |
| 24/05/2017 | 4.5 |
| 24/05/2017 | 4.4 |
| 24/05/2017 | 4.3 |
| 24/05/2017 | 4.3 |
| 24/05/2017 | 4.2 |
| 24/05/2017 | 4.2 |
| 24/05/2017 | 4.2 |
| 24/05/2017 | 4.1 |
| 24/05/2017 | 3.8 |
| 24/05/2017 | 3.6 |
| 24/05/2017 | 3.4 |
| 24/05/2017 | 3 |
| 24/05/2017 | 2.7 |
| 25/05/2017 | 2.5 |
| 25/05/2017 | 2.4 |
| 25/05/2017 | 2.4 |
| 25/05/2017 | 2.4 |
| 25/05/2017 | 2.3 |
| 25/05/2017 | 2.4 |
| 25/05/2017 | 2.6 |
| 25/05/2017 | 2.8 |
| 25/05/2017 | 3.1 |
| 25/05/2017 | 3.3 |
| 25/05/2017 | 3.4 |
| 25/05/2017 | 3.4 |
| 25/05/2017 | 3.4 |
| 25/05/2017 | 3.3 |
| 25/05/2017 | 3.2 |
| 25/05/2017 | 3.1 |
| 25/05/2017 | 3.1 |
| 25/05/2017 | 3.2 |
| 25/05/2017 | 3.2 |
| 25/05/2017 | 3.1 |
| 25/05/2017 | 3.1 |
| 25/05/2017 | 3 |
| 25/05/2017 | 2.8 |
| 25/05/2017 | 2.6 |
| 26/05/2017 | 2.4 |
| 26/05/2017 | 2.3 |
| 26/05/2017 | 2.3 |
| 26/05/2017 | 2.4 |
| 26/05/2017 | 2.5 |
| 26/05/2017 | 2.7 |
| 26/05/2017 | 3 |
| 26/05/2017 | 3.4 |
| 26/05/2017 | 3.7 |
| 26/05/2017 | 3.8 |
| 26/05/2017 | 3.9 |
| 26/05/2017 | 3.9 |
| 26/05/2017 | 3.8 |
| 26/05/2017 | 3.7 |
| 26/05/2017 | 3.6 |
| 26/05/2017 | 3.6 |
| 26/05/2017 | 3.7 |
| 26/05/2017 | 3.7 |
| 26/05/2017 | 3.7 |
| 26/05/2017 | 3.5 |
| 26/05/2017 | 3.4 |
| 26/05/2017 | 3.2 |
| 26/05/2017 | 2.9 |
| 26/05/2017 | 2.7 |
| 27/05/2017 | 2.5 |
| 27/05/2017 | 2.4 |
| 27/05/2017 | 2.4 |
| 27/05/2017 | 2.4 |
| 27/05/2017 | 2.4 |
| 27/05/2017 | 2.5 |
| 27/05/2017 | 2.8 |
| 27/05/2017 | 3.1 |
| 27/05/2017 | 3.4 |
| 27/05/2017 | 3.7 |
| 27/05/2017 | 3.8 |
| 27/05/2017 | 3.8 |
| 27/05/2017 | 3.7 |
| 27/05/2017 | 3.6 |
| 27/05/2017 | 3.5 |
| 27/05/2017 | 3.4 |
| 27/05/2017 | 3.4 |
| 27/05/2017 | 3.5 |
| 27/05/2017 | 3.5 |
| 27/05/2017 | 3.3 |
| 27/05/2017 | 3.2 |
| 27/05/2017 | 3.1 |
| 27/05/2017 | 2.8 |
| 27/05/2017 | 2.6 |
| 28/05/2017 | 2.4 |
| 28/05/2017 | 2.4 |
| 28/05/2017 | 2.3 |
| 28/05/2017 | 2.3 |
| 28/05/2017 | 2.3 |
| 28/05/2017 | 2.3 |
| 28/05/2017 | 2.5 |
| 28/05/2017 | 2.7 |
| 28/05/2017 | 3 |
| 28/05/2017 | 3.2 |
| 28/05/2017 | 3.3 |
| 28/05/2017 | 3.4 |
| 28/05/2017 | 3.3 |
| 28/05/2017 | 3.2 |
| 28/05/2017 | 3.2 |
| 28/05/2017 | 3.1 |
| 28/05/2017 | 3.2 |
| 28/05/2017 | 3.3 |
| 28/05/2017 | 3.3 |
| 28/05/2017 | 3.2 |
| 28/05/2017 | 3.2 |
| 28/05/2017 | 3.1 |
| 28/05/2017 | 2.8 |
| 28/05/2017 | 2.6 |
| 29/05/2017 | 2.4 |
| 29/05/2017 | 2.4 |
| 29/05/2017 | 2.4 |
| 29/05/2017 | 2.5 |
| 29/05/2017 | 2.7 |
| 29/05/2017 | 3.2 |
| 29/05/2017 | 3.7 |
| 29/05/2017 | 4.1 |
| 29/05/2017 | 4.3 |
| 29/05/2017 | 4.4 |
| 29/05/2017 | 4.5 |
| 29/05/2017 | 4.5 |
| 29/05/2017 | 4.5 |
| 29/05/2017 | 4.4 |
| 29/05/2017 | 4.3 |
| 29/05/2017 | 4.2 |
| 29/05/2017 | 4.2 |
| 29/05/2017 | 4.3 |
| 29/05/2017 | 4.2 |
| 29/05/2017 | 3.9 |
| 29/05/2017 | 3.7 |
| 29/05/2017 | 3.4 |
| 29/05/2017 | 3 |
| 29/05/2017 | 2.7 |
| 30/05/2017 | 2.5 |
| 30/05/2017 | 2.4 |
| 30/05/2017 | 2.4 |
| 30/05/2017 | 2.5 |
| 30/05/2017 | 2.7 |
| 30/05/2017 | 3.3 |
| 30/05/2017 | 3.8 |
| 30/05/2017 | 4.2 |
| 30/05/2017 | 4.4 |
| 30/05/2017 | 4.5 |
| 30/05/2017 | 4.5 |
| 30/05/2017 | 4.6 |
| 30/05/2017 | 4.5 |
| 30/05/2017 | 4.4 |
| 30/05/2017 | 4.4 |
| 30/05/2017 | 4.3 |
| 30/05/2017 | 4.3 |
| 30/05/2017 | 4.3 |
| 30/05/2017 | 4.2 |
| 30/05/2017 | 3.9 |
| 30/05/2017 | 3.7 |
| 30/05/2017 | 3.4 |
| 30/05/2017 | 3 |
| 30/05/2017 | 2.7 |
| 31/05/2017 | 2.5 |
| 31/05/2017 | 2.5 |
| 31/05/2017 | 2.4 |
| 31/05/2017 | 2.5 |
| 31/05/2017 | 2.7 |
| 31/05/2017 | 3.3 |
| 31/05/2017 | 3.8 |
| 31/05/2017 | 4.2 |
| 31/05/2017 | 4.4 |
| 31/05/2017 | 4.5 |
| 31/05/2017 | 4.6 |
| 31/05/2017 | 4.6 |
| 31/05/2017 | 4.6 |
| 31/05/2017 | 4.5 |
| 31/05/2017 | 4.4 |
| 31/05/2017 | 4.3 |
| 31/05/2017 | 4.3 |
| 31/05/2017 | 4.3 |
| 31/05/2017 | 4.2 |
| 31/05/2017 | 3.9 |
| 31/05/2017 | 3.7 |
| 31/05/2017 | 3.4 |
| 31/05/2017 | 3 |
| 31/05/2017 | 2.7 |
| 01/06/2017 | 2.5 |
| 01/06/2017 | 2.5 |
| 01/06/2017 | 2.4 |
| 01/06/2017 | 2.5 |
| 01/06/2017 | 2.7 |
| 01/06/2017 | 3.3 |
| 01/06/2017 | 3.8 |
| 01/06/2017 | 4.2 |
| 01/06/2017 | 4.4 |
| 01/06/2017 | 4.5 |
| 01/06/2017 | 4.6 |
| 01/06/2017 | 4.6 |
| 01/06/2017 | 4.5 |
| 01/06/2017 | 4.4 |
| 01/06/2017 | 4.4 |
| 01/06/2017 | 4.3 |
| 01/06/2017 | 4.3 |
| 01/06/2017 | 4.3 |
| 01/06/2017 | 4.2 |
| 01/06/2017 | 3.9 |
| 01/06/2017 | 3.7 |
| 01/06/2017 | 3.4 |
| 01/06/2017 | 3 |
| 01/06/2017 | 2.7 |
| 02/06/2017 | 2.5 |
| 02/06/2017 | 2.5 |
| 02/06/2017 | 2.4 |
| 02/06/2017 | 2.5 |
| 02/06/2017 | 2.7 |
| 02/06/2017 | 3.2 |
| 02/06/2017 | 3.8 |
| 02/06/2017 | 4.2 |
| 02/06/2017 | 4.4 |
| 02/06/2017 | 4.5 |
| 02/06/2017 | 4.6 |
| 02/06/2017 | 4.6 |
| 02/06/2017 | 4.5 |
| 02/06/2017 | 4.4 |
| 02/06/2017 | 4.3 |
| 02/06/2017 | 4.2 |
| 02/06/2017 | 4.2 |
| 02/06/2017 | 4.2 |
| 02/06/2017 | 4 |
| 02/06/2017 | 3.7 |
| 02/06/2017 | 3.5 |
| 02/06/2017 | 3.3 |
| 02/06/2017 | 3 |
| 02/06/2017 | 2.7 |
| 03/06/2017 | 2.5 |
| 03/06/2017 | 2.4 |
| 03/06/2017 | 2.4 |
| 03/06/2017 | 2.4 |
| 03/06/2017 | 2.4 |
| 03/06/2017 | 2.5 |
| 03/06/2017 | 2.8 |
| 03/06/2017 | 3.1 |
| 03/06/2017 | 3.4 |
| 03/06/2017 | 3.7 |
| 03/06/2017 | 3.8 |
| 03/06/2017 | 3.8 |
| 03/06/2017 | 3.7 |
| 03/06/2017 | 3.6 |
| 03/06/2017 | 3.5 |
| 03/06/2017 | 3.5 |
| 03/06/2017 | 3.5 |
| 03/06/2017 | 3.5 |
| 03/06/2017 | 3.5 |
| 03/06/2017 | 3.3 |
| 03/06/2017 | 3.2 |
| 03/06/2017 | 3.1 |
| 03/06/2017 | 2.9 |
| 03/06/2017 | 2.7 |
| 04/06/2017 | 2.5 |
| 04/06/2017 | 2.4 |
| 04/06/2017 | 2.3 |
| 04/06/2017 | 2.3 |
| 04/06/2017 | 2.3 |
| 04/06/2017 | 2.4 |
| 04/06/2017 | 2.6 |
| 04/06/2017 | 2.9 |
| 04/06/2017 | 3.1 |
| 04/06/2017 | 3.2 |
| 04/06/2017 | 3.3 |
| 04/06/2017 | 3.4 |
| 04/06/2017 | 3.3 |
| 04/06/2017 | 3.2 |
| 04/06/2017 | 3.1 |
| 04/06/2017 | 3.1 |
| 04/06/2017 | 3.2 |
| 04/06/2017 | 3.3 |
| 04/06/2017 | 3.3 |
| 04/06/2017 | 3.3 |
| 04/06/2017 | 3.2 |
| 04/06/2017 | 3.2 |
| 04/06/2017 | 2.9 |
| 04/06/2017 | 2.7 |
| 05/06/2017 | 2.5 |
| 05/06/2017 | 2.4 |
| 05/06/2017 | 2.3 |
| 05/06/2017 | 2.3 |
| 05/06/2017 | 2.3 |
| 05/06/2017 | 2.4 |
| 05/06/2017 | 2.6 |
| 05/06/2017 | 2.9 |
| 05/06/2017 | 3.1 |
| 05/06/2017 | 3.2 |
| 05/06/2017 | 3.3 |
| 05/06/2017 | 3.4 |
| 05/06/2017 | 3.3 |
| 05/06/2017 | 3.2 |
| 05/06/2017 | 3.2 |
| 05/06/2017 | 3.1 |
| 05/06/2017 | 3.2 |
| 05/06/2017 | 3.3 |
| 05/06/2017 | 3.3 |
| 05/06/2017 | 3.3 |
| 05/06/2017 | 3.2 |
| 05/06/2017 | 3.2 |
| 05/06/2017 | 2.9 |
| 05/06/2017 | 2.7 |
| 06/06/2017 | 2.5 |
| 06/06/2017 | 2.4 |
| 06/06/2017 | 2.4 |
| 06/06/2017 | 2.5 |
| 06/06/2017 | 2.7 |
| 06/06/2017 | 3.1 |
| 06/06/2017 | 3.6 |
| 06/06/2017 | 4 |
| 06/06/2017 | 4.3 |
| 06/06/2017 | 4.4 |
| 06/06/2017 | 4.5 |
| 06/06/2017 | 4.5 |
| 06/06/2017 | 4.4 |
| 06/06/2017 | 4.3 |
| 06/06/2017 | 4.3 |
| 06/06/2017 | 4.2 |
| 06/06/2017 | 4.2 |
| 06/06/2017 | 4.2 |
| 06/06/2017 | 4.1 |
| 06/06/2017 | 3.8 |
| 06/06/2017 | 3.6 |
| 06/06/2017 | 3.4 |
| 06/06/2017 | 3 |
| 06/06/2017 | 2.8 |
| 07/06/2017 | 2.6 |
| 07/06/2017 | 2.5 |
| 07/06/2017 | 2.4 |
| 07/06/2017 | 2.5 |
| 07/06/2017 | 2.7 |
| 07/06/2017 | 3.1 |
| 07/06/2017 | 3.7 |
| 07/06/2017 | 4.1 |
| 07/06/2017 | 4.3 |
| 07/06/2017 | 4.5 |
| 07/06/2017 | 4.5 |
| 07/06/2017 | 4.5 |
| 07/06/2017 | 4.5 |
| 07/06/2017 | 4.4 |
| 07/06/2017 | 4.3 |
| 07/06/2017 | 4.2 |
| 07/06/2017 | 4.2 |
| 07/06/2017 | 4.2 |
| 07/06/2017 | 4.1 |
| 07/06/2017 | 3.8 |
| 07/06/2017 | 3.6 |
| 07/06/2017 | 3.4 |
| 07/06/2017 | 3 |
| 07/06/2017 | 2.8 |
| 08/06/2017 | 2.6 |
| 08/06/2017 | 2.5 |
| 08/06/2017 | 2.4 |
| 08/06/2017 | 2.5 |
| 08/06/2017 | 2.7 |
| 08/06/2017 | 3.1 |
| 08/06/2017 | 3.6 |
| 08/06/2017 | 4 |
| 08/06/2017 | 4.3 |
| 08/06/2017 | 4.4 |
| 08/06/2017 | 4.5 |
| 08/06/2017 | 4.5 |
| 08/06/2017 | 4.4 |
| 08/06/2017 | 4.3 |
| 08/06/2017 | 4.3 |
| 08/06/2017 | 4.2 |
| 08/06/2017 | 4.2 |
| 08/06/2017 | 4.2 |
| 08/06/2017 | 4.1 |
| 08/06/2017 | 3.8 |
| 08/06/2017 | 3.6 |
| 08/06/2017 | 3.4 |
| 08/06/2017 | 3 |
| 08/06/2017 | 2.8 |
| 09/06/2017 | 2.6 |
| 09/06/2017 | 2.5 |
| 09/06/2017 | 2.4 |
| 09/06/2017 | 2.5 |
| 09/06/2017 | 2.7 |
| 09/06/2017 | 3.1 |
| 09/06/2017 | 3.6 |
| 09/06/2017 | 4 |
| 09/06/2017 | 4.3 |
| 09/06/2017 | 4.5 |
| 09/06/2017 | 4.5 |
| 09/06/2017 | 4.5 |
| 09/06/2017 | 4.4 |
| 09/06/2017 | 4.3 |
| 09/06/2017 | 4.2 |
| 09/06/2017 | 4.1 |
| 09/06/2017 | 4.1 |
| 09/06/2017 | 4.1 |
| 09/06/2017 | 3.9 |
| 09/06/2017 | 3.7 |
| 09/06/2017 | 3.5 |
| 09/06/2017 | 3.3 |
| 09/06/2017 | 3 |
| 09/06/2017 | 2.7 |
| 10/06/2017 | 2.6 |
| 10/06/2017 | 2.5 |
| 10/06/2017 | 2.4 |
| 10/06/2017 | 2.4 |
| 10/06/2017 | 2.4 |
| 10/06/2017 | 2.5 |
| 10/06/2017 | 2.8 |
| 10/06/2017 | 3.1 |
| 10/06/2017 | 3.4 |
| 10/06/2017 | 3.7 |
| 10/06/2017 | 3.8 |
| 10/06/2017 | 3.8 |
| 10/06/2017 | 3.7 |
| 10/06/2017 | 3.6 |
| 10/06/2017 | 3.5 |
| 10/06/2017 | 3.5 |
| 10/06/2017 | 3.5 |
| 10/06/2017 | 3.5 |
| 10/06/2017 | 3.5 |
| 10/06/2017 | 3.4 |
| 10/06/2017 | 3.2 |
| 10/06/2017 | 3.1 |
| 10/06/2017 | 2.9 |
| 10/06/2017 | 2.6 |
| 11/06/2017 | 2.5 |
| 11/06/2017 | 2.4 |
| 11/06/2017 | 2.3 |
| 11/06/2017 | 2.3 |
| 11/06/2017 | 2.3 |
| 11/06/2017 | 2.3 |
| 11/06/2017 | 2.5 |
| 11/06/2017 | 2.7 |
| 11/06/2017 | 3 |
| 11/06/2017 | 3.2 |
| 11/06/2017 | 3.4 |
| 11/06/2017 | 3.4 |
| 11/06/2017 | 3.4 |
| 11/06/2017 | 3.3 |
| 11/06/2017 | 3.2 |
| 11/06/2017 | 3.2 |
| 11/06/2017 | 3.2 |
| 11/06/2017 | 3.3 |
| 11/06/2017 | 3.3 |
| 11/06/2017 | 3.2 |
| 11/06/2017 | 3.2 |
| 11/06/2017 | 3.1 |
| 11/06/2017 | 2.9 |
| 11/06/2017 | 2.6 |
| 12/06/2017 | 2.5 |
| 12/06/2017 | 2.4 |
| 12/06/2017 | 2.4 |
| 12/06/2017 | 2.5 |
| 12/06/2017 | 2.7 |
| 12/06/2017 | 3.2 |
| 12/06/2017 | 3.8 |
| 12/06/2017 | 4.1 |
| 12/06/2017 | 4.3 |
| 12/06/2017 | 4.5 |
| 12/06/2017 | 4.5 |
| 12/06/2017 | 4.6 |
| 12/06/2017 | 4.5 |
| 12/06/2017 | 4.5 |
| 12/06/2017 | 4.4 |
| 12/06/2017 | 4.3 |
| 12/06/2017 | 4.3 |
| 12/06/2017 | 4.3 |
| 12/06/2017 | 4.2 |
| 12/06/2017 | 3.9 |
| 12/06/2017 | 3.7 |
| 12/06/2017 | 3.4 |
| 12/06/2017 | 3 |
| 12/06/2017 | 2.8 |
| 13/06/2017 | 2.6 |
| 13/06/2017 | 2.5 |
| 13/06/2017 | 2.4 |
| 13/06/2017 | 2.5 |
| 13/06/2017 | 2.7 |
| 13/06/2017 | 3.3 |
| 13/06/2017 | 3.8 |
| 13/06/2017 | 4.2 |
| 13/06/2017 | 4.4 |
| 13/06/2017 | 4.5 |
| 13/06/2017 | 4.6 |
| 13/06/2017 | 4.6 |
| 13/06/2017 | 4.6 |
| 13/06/2017 | 4.5 |
| 13/06/2017 | 4.4 |
| 13/06/2017 | 4.4 |
| 13/06/2017 | 4.4 |
| 13/06/2017 | 4.4 |
| 13/06/2017 | 4.3 |
| 13/06/2017 | 4 |
| 13/06/2017 | 3.7 |
| 13/06/2017 | 3.4 |
| 13/06/2017 | 3.1 |
| 13/06/2017 | 2.8 |
| 14/06/2017 | 2.6 |
| 14/06/2017 | 2.5 |
| 14/06/2017 | 2.5 |
| 14/06/2017 | 2.5 |
| 14/06/2017 | 2.7 |
| 14/06/2017 | 3.3 |
| 14/06/2017 | 3.8 |
| 14/06/2017 | 4.2 |
| 14/06/2017 | 4.4 |
| 14/06/2017 | 4.6 |
| 14/06/2017 | 4.6 |
| 14/06/2017 | 4.6 |
| 14/06/2017 | 4.6 |
| 14/06/2017 | 4.5 |
| 14/06/2017 | 4.5 |
| 14/06/2017 | 4.4 |
| 14/06/2017 | 4.4 |
| 14/06/2017 | 4.4 |
| 14/06/2017 | 4.3 |
| 14/06/2017 | 4 |
| 14/06/2017 | 3.7 |
| 14/06/2017 | 3.4 |
| 14/06/2017 | 3.1 |
| 14/06/2017 | 2.8 |
| 15/06/2017 | 2.6 |
| 15/06/2017 | 2.5 |
| 15/06/2017 | 2.5 |
| 15/06/2017 | 2.5 |
| 15/06/2017 | 2.7 |
| 15/06/2017 | 3.3 |
| 15/06/2017 | 3.8 |
| 15/06/2017 | 4.2 |
| 15/06/2017 | 4.4 |
| 15/06/2017 | 4.5 |
| 15/06/2017 | 4.6 |
| 15/06/2017 | 4.6 |
| 15/06/2017 | 4.6 |
| 15/06/2017 | 4.5 |
| 15/06/2017 | 4.4 |
| 15/06/2017 | 4.3 |
| 15/06/2017 | 4.3 |
| 15/06/2017 | 4.3 |
| 15/06/2017 | 4.2 |
| 15/06/2017 | 3.9 |
| 15/06/2017 | 3.7 |
| 15/06/2017 | 3.4 |
| 15/06/2017 | 3.1 |
| 15/06/2017 | 2.8 |
| 16/06/2017 | 2.6 |
| 16/06/2017 | 2.5 |
| 16/06/2017 | 2.5 |
| 16/06/2017 | 2.5 |
| 16/06/2017 | 2.7 |
| 16/06/2017 | 3.2 |
| 16/06/2017 | 3.8 |
| 16/06/2017 | 4.2 |
| 16/06/2017 | 4.4 |
| 16/06/2017 | 4.5 |
| 16/06/2017 | 4.6 |
| 16/06/2017 | 4.6 |
| 16/06/2017 | 4.5 |
| 16/06/2017 | 4.4 |
| 16/06/2017 | 4.3 |
| 16/06/2017 | 4.2 |
| 16/06/2017 | 4.2 |
| 16/06/2017 | 4.2 |
| 16/06/2017 | 4.1 |
| 16/06/2017 | 3.8 |
| 16/06/2017 | 3.5 |
| 16/06/2017 | 3.3 |
| 16/06/2017 | 3 |
| 16/06/2017 | 2.8 |
| 17/06/2017 | 2.6 |
| 17/06/2017 | 2.5 |
| 17/06/2017 | 2.4 |
| 17/06/2017 | 2.4 |
| 17/06/2017 | 2.4 |
| 17/06/2017 | 2.5 |
| 17/06/2017 | 2.8 |
| 17/06/2017 | 3.1 |
| 17/06/2017 | 3.5 |
| 17/06/2017 | 3.7 |
| 17/06/2017 | 3.8 |
| 17/06/2017 | 3.8 |
| 17/06/2017 | 3.7 |
| 17/06/2017 | 3.6 |
| 17/06/2017 | 3.6 |
| 17/06/2017 | 3.5 |
| 17/06/2017 | 3.5 |
| 17/06/2017 | 3.6 |
| 17/06/2017 | 3.6 |
| 17/06/2017 | 3.4 |
| 17/06/2017 | 3.2 |
| 17/06/2017 | 3.1 |
| 17/06/2017 | 2.9 |
| 17/06/2017 | 2.6 |
| 18/06/2017 | 2.5 |
| 18/06/2017 | 2.4 |
| 18/06/2017 | 2.3 |
| 18/06/2017 | 2.3 |
| 18/06/2017 | 2.3 |
| 18/06/2017 | 2.3 |
| 18/06/2017 | 2.5 |
| 18/06/2017 | 2.7 |
| 18/06/2017 | 3 |
| 18/06/2017 | 3.2 |
| 18/06/2017 | 3.4 |
| 18/06/2017 | 3.4 |
| 18/06/2017 | 3.4 |
| 18/06/2017 | 3.3 |
| 18/06/2017 | 3.2 |
| 18/06/2017 | 3.2 |
| 18/06/2017 | 3.3 |
| 18/06/2017 | 3.4 |
| 18/06/2017 | 3.3 |
| 18/06/2017 | 3.3 |
| 18/06/2017 | 3.2 |
| 18/06/2017 | 3.2 |
| 18/06/2017 | 2.9 |
| 18/06/2017 | 2.7 |
| 19/06/2017 | 2.5 |
| 19/06/2017 | 2.4 |
| 19/06/2017 | 2.4 |
| 19/06/2017 | 2.5 |
| 19/06/2017 | 2.7 |
| 19/06/2017 | 3.2 |
| 19/06/2017 | 3.8 |
| 19/06/2017 | 4.1 |
| 19/06/2017 | 4.3 |
| 19/06/2017 | 4.5 |
| 19/06/2017 | 4.5 |
| 19/06/2017 | 4.6 |
| 19/06/2017 | 4.5 |
| 19/06/2017 | 4.5 |
| 19/06/2017 | 4.4 |
| 19/06/2017 | 4.3 |
| 19/06/2017 | 4.3 |
| 19/06/2017 | 4.3 |
| 19/06/2017 | 4.2 |
| 19/06/2017 | 3.9 |
| 19/06/2017 | 3.7 |
| 19/06/2017 | 3.4 |
| 19/06/2017 | 3.1 |
| 19/06/2017 | 2.8 |
| 20/06/2017 | 2.6 |
| 20/06/2017 | 2.5 |
| 20/06/2017 | 2.5 |
| 20/06/2017 | 2.5 |
| 20/06/2017 | 2.7 |
| 20/06/2017 | 3.3 |
| 20/06/2017 | 3.8 |
| 20/06/2017 | 4.2 |
| 20/06/2017 | 4.4 |
| 20/06/2017 | 4.5 |
| 20/06/2017 | 4.6 |
| 20/06/2017 | 4.6 |
| 20/06/2017 | 4.6 |
| 20/06/2017 | 4.5 |
| 20/06/2017 | 4.4 |
| 20/06/2017 | 4.4 |
| 20/06/2017 | 4.4 |
| 20/06/2017 | 4.4 |
| 20/06/2017 | 4.3 |
| 20/06/2017 | 4 |
| 20/06/2017 | 3.7 |
| 20/06/2017 | 3.4 |
| 20/06/2017 | 3.1 |
| 20/06/2017 | 2.8 |
| 21/06/2017 | 2.6 |
| 21/06/2017 | 2.5 |
| 21/06/2017 | 2.5 |
| 21/06/2017 | 2.6 |
| 21/06/2017 | 2.8 |
| 21/06/2017 | 3.3 |
| 21/06/2017 | 3.8 |
| 21/06/2017 | 4.2 |
| 21/06/2017 | 4.4 |
| 21/06/2017 | 4.6 |
| 21/06/2017 | 4.6 |
| 21/06/2017 | 4.7 |
| 21/06/2017 | 4.6 |
| 21/06/2017 | 4.5 |
| 21/06/2017 | 4.5 |
| 21/06/2017 | 4.4 |
| 21/06/2017 | 4.4 |
| 21/06/2017 | 4.4 |
| 21/06/2017 | 4.3 |
| 21/06/2017 | 4 |
| 21/06/2017 | 3.7 |
| 21/06/2017 | 3.5 |
| 21/06/2017 | 3.1 |
| 21/06/2017 | 2.8 |
| 22/06/2017 | 2.6 |
| 22/06/2017 | 2.5 |
| 22/06/2017 | 2.5 |
| 22/06/2017 | 2.6 |
| 22/06/2017 | 2.7 |
| 22/06/2017 | 3.3 |
| 22/06/2017 | 3.8 |
| 22/06/2017 | 4.2 |
| 22/06/2017 | 4.4 |
| 22/06/2017 | 4.5 |
| 22/06/2017 | 4.6 |
| 22/06/2017 | 4.6 |
| 22/06/2017 | 4.6 |
| 22/06/2017 | 4.5 |
| 22/06/2017 | 4.4 |
| 22/06/2017 | 4.4 |
| 22/06/2017 | 4.4 |
| 22/06/2017 | 4.3 |
| 22/06/2017 | 4.3 |
| 22/06/2017 | 3.9 |
| 22/06/2017 | 3.7 |
| 22/06/2017 | 3.5 |
| 22/06/2017 | 3.1 |
| 22/06/2017 | 2.8 |
| 23/06/2017 | 2.6 |
| 23/06/2017 | 2.5 |
| 23/06/2017 | 2.5 |
| 23/06/2017 | 2.5 |
| 23/06/2017 | 2.7 |
| 23/06/2017 | 3.2 |
| 23/06/2017 | 3.8 |
| 23/06/2017 | 4.2 |
| 23/06/2017 | 4.4 |
| 23/06/2017 | 4.6 |
| 23/06/2017 | 4.6 |
| 23/06/2017 | 4.6 |
| 23/06/2017 | 4.5 |
| 23/06/2017 | 4.4 |
| 23/06/2017 | 4.3 |
| 23/06/2017 | 4.3 |
| 23/06/2017 | 4.2 |
| 23/06/2017 | 4.2 |
| 23/06/2017 | 4.1 |
| 23/06/2017 | 3.8 |
| 23/06/2017 | 3.5 |
| 23/06/2017 | 3.4 |
| 23/06/2017 | 3.1 |
| 23/06/2017 | 2.8 |
| 24/06/2017 | 2.6 |
| 24/06/2017 | 2.5 |
| 24/06/2017 | 2.4 |
| 24/06/2017 | 2.4 |
| 24/06/2017 | 2.4 |
| 24/06/2017 | 2.5 |
| 24/06/2017 | 2.8 |
| 24/06/2017 | 3.1 |
| 24/06/2017 | 3.5 |
| 24/06/2017 | 3.7 |
| 24/06/2017 | 3.8 |
| 24/06/2017 | 3.8 |
| 24/06/2017 | 3.7 |
| 24/06/2017 | 3.6 |
| 24/06/2017 | 3.6 |
| 24/06/2017 | 3.5 |
| 24/06/2017 | 3.5 |
| 24/06/2017 | 3.6 |
| 24/06/2017 | 3.6 |
| 24/06/2017 | 3.4 |
| 24/06/2017 | 3.2 |
| 24/06/2017 | 3.1 |
| 24/06/2017 | 2.9 |
| 24/06/2017 | 2.7 |
| 25/06/2017 | 2.5 |
| 25/06/2017 | 2.4 |
| 25/06/2017 | 2.4 |
| 25/06/2017 | 2.3 |
| 25/06/2017 | 2.3 |
| 25/06/2017 | 2.3 |
| 25/06/2017 | 2.5 |
| 25/06/2017 | 2.7 |
| 25/06/2017 | 3 |
| 25/06/2017 | 3.2 |
| 25/06/2017 | 3.4 |
| 25/06/2017 | 3.5 |
| 25/06/2017 | 3.4 |
| 25/06/2017 | 3.3 |
| 25/06/2017 | 3.3 |
| 25/06/2017 | 3.2 |
| 25/06/2017 | 3.3 |
| 25/06/2017 | 3.4 |
| 25/06/2017 | 3.4 |
| 25/06/2017 | 3.3 |
| 25/06/2017 | 3.2 |
| 25/06/2017 | 3.2 |
| 25/06/2017 | 2.9 |
| 25/06/2017 | 2.7 |
| 26/06/2017 | 2.5 |
| 26/06/2017 | 2.4 |
| 26/06/2017 | 2.4 |
| 26/06/2017 | 2.5 |
| 26/06/2017 | 2.7 |
| 26/06/2017 | 3.2 |
| 26/06/2017 | 3.8 |
| 26/06/2017 | 4.1 |
| 26/06/2017 | 4.3 |
| 26/06/2017 | 4.5 |
| 26/06/2017 | 4.6 |
| 26/06/2017 | 4.6 |
| 26/06/2017 | 4.6 |
| 26/06/2017 | 4.5 |
| 26/06/2017 | 4.4 |
| 26/06/2017 | 4.4 |
| 26/06/2017 | 4.4 |
| 26/06/2017 | 4.3 |
| 26/06/2017 | 4.3 |
| 26/06/2017 | 3.9 |
| 26/06/2017 | 3.7 |
| 26/06/2017 | 3.4 |
| 26/06/2017 | 3.1 |
| 26/06/2017 | 2.8 |
| 27/06/2017 | 2.6 |
| 27/06/2017 | 2.5 |
| 27/06/2017 | 2.5 |
| 27/06/2017 | 2.5 |
| 27/06/2017 | 2.7 |
| 27/06/2017 | 3.3 |
| 27/06/2017 | 3.8 |
| 27/06/2017 | 4.2 |
| 27/06/2017 | 4.4 |
| 27/06/2017 | 4.5 |
| 27/06/2017 | 4.6 |
| 27/06/2017 | 4.6 |
| 27/06/2017 | 4.6 |
| 27/06/2017 | 4.5 |
| 27/06/2017 | 4.5 |
| 27/06/2017 | 4.4 |
| 27/06/2017 | 4.4 |
| 27/06/2017 | 4.4 |
| 27/06/2017 | 4.3 |
| 27/06/2017 | 4 |
| 27/06/2017 | 3.7 |
| 27/06/2017 | 3.5 |
| 27/06/2017 | 3.1 |
| 27/06/2017 | 2.8 |
| 28/06/2017 | 2.6 |
| 28/06/2017 | 2.5 |
| 28/06/2017 | 2.5 |
| 28/06/2017 | 2.6 |
| 28/06/2017 | 2.8 |
| 28/06/2017 | 3.3 |
| 28/06/2017 | 3.8 |
| 28/06/2017 | 4.2 |
| 28/06/2017 | 4.4 |
| 28/06/2017 | 4.6 |
| 28/06/2017 | 4.6 |
| 28/06/2017 | 4.7 |
| 28/06/2017 | 4.6 |
| 28/06/2017 | 4.6 |
| 28/06/2017 | 4.5 |
| 28/06/2017 | 4.4 |
| 28/06/2017 | 4.4 |
| 28/06/2017 | 4.4 |
| 28/06/2017 | 4.3 |
| 28/06/2017 | 4 |
| 28/06/2017 | 3.7 |
| 28/06/2017 | 3.5 |
| 28/06/2017 | 3.1 |
| 28/06/2017 | 2.8 |
| 29/06/2017 | 2.6 |
| 29/06/2017 | 2.5 |
| 29/06/2017 | 2.5 |
| 29/06/2017 | 2.6 |
| 29/06/2017 | 2.7 |
| 29/06/2017 | 3.3 |
| 29/06/2017 | 3.8 |
| 29/06/2017 | 4.2 |
| 29/06/2017 | 4.4 |
| 29/06/2017 | 4.6 |
| 29/06/2017 | 4.6 |
| 29/06/2017 | 4.6 |
| 29/06/2017 | 4.6 |
| 29/06/2017 | 4.5 |
| 29/06/2017 | 4.5 |
| 29/06/2017 | 4.4 |
| 29/06/2017 | 4.4 |
| 29/06/2017 | 4.3 |
| 29/06/2017 | 4.3 |
| 29/06/2017 | 4 |
| 29/06/2017 | 3.7 |
| 29/06/2017 | 3.5 |
| 29/06/2017 | 3.1 |
| 29/06/2017 | 2.8 |
| 30/06/2017 | 2.6 |
| 30/06/2017 | 2.5 |
| 30/06/2017 | 2.5 |
| 30/06/2017 | 2.6 |
| 30/06/2017 | 2.7 |
| 30/06/2017 | 3.3 |
| 30/06/2017 | 3.8 |
| 30/06/2017 | 4.2 |
| 30/06/2017 | 4.4 |
| 30/06/2017 | 4.6 |
| 30/06/2017 | 4.6 |
| 30/06/2017 | 4.6 |
| 30/06/2017 | 4.5 |
| 30/06/2017 | 4.4 |
| 30/06/2017 | 4.4 |
| 30/06/2017 | 4.3 |
| 30/06/2017 | 4.3 |
| 30/06/2017 | 4.2 |
| 30/06/2017 | 4.1 |
| 30/06/2017 | 3.8 |
| 30/06/2017 | 3.5 |
| 30/06/2017 | 3.4 |
| 30/06/2017 | 3.1 |
| 30/06/2017 | 2.8 |
| 01/07/2017 | 2.6 |
| 01/07/2017 | 2.5 |
| 01/07/2017 | 2.4 |
| 01/07/2017 | 2.4 |
| 01/07/2017 | 2.4 |
| 01/07/2017 | 2.5 |
| 01/07/2017 | 2.8 |
| 01/07/2017 | 3.1 |
| 01/07/2017 | 3.5 |
| 01/07/2017 | 3.7 |
| 01/07/2017 | 3.8 |
| 01/07/2017 | 3.8 |
| 01/07/2017 | 3.7 |
| 01/07/2017 | 3.6 |
| 01/07/2017 | 3.6 |
| 01/07/2017 | 3.6 |
| 01/07/2017 | 3.6 |
| 01/07/2017 | 3.6 |
| 01/07/2017 | 3.6 |
| 01/07/2017 | 3.4 |
| 01/07/2017 | 3.2 |
| 01/07/2017 | 3.1 |
| 01/07/2017 | 2.9 |
| 01/07/2017 | 2.7 |
| 02/07/2017 | 2.5 |
| 02/07/2017 | 2.4 |
| 02/07/2017 | 2.4 |
| 02/07/2017 | 2.3 |
| 02/07/2017 | 2.3 |
| 02/07/2017 | 2.3 |
| 02/07/2017 | 2.5 |
| 02/07/2017 | 2.7 |
| 02/07/2017 | 3 |
| 02/07/2017 | 3.2 |
| 02/07/2017 | 3.4 |
| 02/07/2017 | 3.5 |
| 02/07/2017 | 3.4 |
| 02/07/2017 | 3.3 |
| 02/07/2017 | 3.3 |
| 02/07/2017 | 3.3 |
| 02/07/2017 | 3.3 |
| 02/07/2017 | 3.4 |
| 02/07/2017 | 3.4 |
| 02/07/2017 | 3.3 |
| 02/07/2017 | 3.2 |
| 02/07/2017 | 3.2 |
| 02/07/2017 | 2.9 |
| 02/07/2017 | 2.7 |
| 03/07/2017 | 2.5 |
| 03/07/2017 | 2.4 |
| 03/07/2017 | 2.4 |
| 03/07/2017 | 2.5 |
| 03/07/2017 | 2.7 |
| 03/07/2017 | 3.2 |
| 03/07/2017 | 3.8 |
| 03/07/2017 | 4.1 |
| 03/07/2017 | 4.3 |
| 03/07/2017 | 4.5 |
| 03/07/2017 | 4.6 |
| 03/07/2017 | 4.6 |
| 03/07/2017 | 4.6 |
| 03/07/2017 | 4.5 |
| 03/07/2017 | 4.5 |
| 03/07/2017 | 4.4 |
| 03/07/2017 | 4.4 |
| 03/07/2017 | 4.3 |
| 03/07/2017 | 4.3 |
| 03/07/2017 | 4 |
| 03/07/2017 | 3.7 |
| 03/07/2017 | 3.4 |
| 03/07/2017 | 3.1 |
| 03/07/2017 | 2.8 |
| 04/07/2017 | 2.6 |
| 04/07/2017 | 2.5 |
| 04/07/2017 | 2.5 |
| 04/07/2017 | 2.6 |
| 04/07/2017 | 2.7 |
| 04/07/2017 | 3.3 |
| 04/07/2017 | 3.8 |
| 04/07/2017 | 4.2 |
| 04/07/2017 | 4.4 |
| 04/07/2017 | 4.5 |
| 04/07/2017 | 4.6 |
| 04/07/2017 | 4.6 |
| 04/07/2017 | 4.6 |
| 04/07/2017 | 4.5 |
| 04/07/2017 | 4.5 |
| 04/07/2017 | 4.4 |
| 04/07/2017 | 4.4 |
| 04/07/2017 | 4.4 |
| 04/07/2017 | 4.3 |
| 04/07/2017 | 4 |
| 04/07/2017 | 3.7 |
| 04/07/2017 | 3.5 |
| 04/07/2017 | 3.1 |
| 04/07/2017 | 2.8 |
| 05/07/2017 | 2.6 |
| 05/07/2017 | 2.5 |
| 05/07/2017 | 2.5 |
| 05/07/2017 | 2.6 |
| 05/07/2017 | 2.8 |
| 05/07/2017 | 3.3 |
| 05/07/2017 | 3.8 |
| 05/07/2017 | 4.2 |
| 05/07/2017 | 4.4 |
| 05/07/2017 | 4.6 |
| 05/07/2017 | 4.6 |
| 05/07/2017 | 4.7 |
| 05/07/2017 | 4.6 |
| 05/07/2017 | 4.6 |
| 05/07/2017 | 4.5 |
| 05/07/2017 | 4.4 |
| 05/07/2017 | 4.4 |
| 05/07/2017 | 4.4 |
| 05/07/2017 | 4.3 |
| 05/07/2017 | 4 |
| 05/07/2017 | 3.7 |
| 05/07/2017 | 3.5 |
| 05/07/2017 | 3.1 |
| 05/07/2017 | 2.8 |
| 06/07/2017 | 2.6 |
| 06/07/2017 | 2.5 |
| 06/07/2017 | 2.5 |
| 06/07/2017 | 2.6 |
| 06/07/2017 | 2.8 |
| 06/07/2017 | 3.3 |
| 06/07/2017 | 3.8 |
| 06/07/2017 | 4.2 |
| 06/07/2017 | 4.4 |
| 06/07/2017 | 4.5 |
| 06/07/2017 | 4.6 |
| 06/07/2017 | 4.6 |
| 06/07/2017 | 4.6 |
| 06/07/2017 | 4.5 |
| 06/07/2017 | 4.5 |
| 06/07/2017 | 4.4 |
| 06/07/2017 | 4.4 |
| 06/07/2017 | 4.3 |
| 06/07/2017 | 4.3 |
| 06/07/2017 | 4 |
| 06/07/2017 | 3.7 |
| 06/07/2017 | 3.5 |
| 06/07/2017 | 3.1 |
| 06/07/2017 | 2.8 |
| 07/07/2017 | 2.6 |
| 07/07/2017 | 2.5 |
| 07/07/2017 | 2.5 |
| 07/07/2017 | 2.6 |
| 07/07/2017 | 2.7 |
| 07/07/2017 | 3.3 |
| 07/07/2017 | 3.8 |
| 07/07/2017 | 4.2 |
| 07/07/2017 | 4.4 |
| 07/07/2017 | 4.5 |
| 07/07/2017 | 4.6 |
| 07/07/2017 | 4.6 |
| 07/07/2017 | 4.5 |
| 07/07/2017 | 4.4 |
| 07/07/2017 | 4.4 |
| 07/07/2017 | 4.3 |
| 07/07/2017 | 4.3 |
| 07/07/2017 | 4.2 |
| 07/07/2017 | 4.1 |
| 07/07/2017 | 3.8 |
| 07/07/2017 | 3.5 |
| 07/07/2017 | 3.4 |
| 07/07/2017 | 3.1 |
| 07/07/2017 | 2.8 |
| 08/07/2017 | 2.6 |
| 08/07/2017 | 2.5 |
| 08/07/2017 | 2.4 |
| 08/07/2017 | 2.4 |
| 08/07/2017 | 2.4 |
| 08/07/2017 | 2.5 |
| 08/07/2017 | 2.8 |
| 08/07/2017 | 3.1 |
| 08/07/2017 | 3.5 |
| 08/07/2017 | 3.7 |
| 08/07/2017 | 3.8 |
| 08/07/2017 | 3.8 |
| 08/07/2017 | 3.7 |
| 08/07/2017 | 3.6 |
| 08/07/2017 | 3.6 |
| 08/07/2017 | 3.5 |
| 08/07/2017 | 3.6 |
| 08/07/2017 | 3.6 |
| 08/07/2017 | 3.6 |
| 08/07/2017 | 3.4 |
| 08/07/2017 | 3.2 |
| 08/07/2017 | 3.1 |
| 08/07/2017 | 2.9 |
| 08/07/2017 | 2.7 |
| 09/07/2017 | 2.5 |
| 09/07/2017 | 2.4 |
| 09/07/2017 | 2.4 |
| 09/07/2017 | 2.3 |
| 09/07/2017 | 2.3 |
| 09/07/2017 | 2.3 |
| 09/07/2017 | 2.5 |
| 09/07/2017 | 2.7 |
| 09/07/2017 | 3 |
| 09/07/2017 | 3.2 |
| 09/07/2017 | 3.4 |
| 09/07/2017 | 3.4 |
| 09/07/2017 | 3.4 |
| 09/07/2017 | 3.3 |
| 09/07/2017 | 3.3 |
| 09/07/2017 | 3.2 |
| 09/07/2017 | 3.3 |
| 09/07/2017 | 3.4 |
| 09/07/2017 | 3.3 |
| 09/07/2017 | 3.3 |
| 09/07/2017 | 3.2 |
| 09/07/2017 | 3.2 |
| 09/07/2017 | 2.9 |
| 09/07/2017 | 2.7 |
| 10/07/2017 | 2.5 |
| 10/07/2017 | 2.4 |
| 10/07/2017 | 2.4 |
| 10/07/2017 | 2.5 |
| 10/07/2017 | 2.7 |
| 10/07/2017 | 3.2 |
| 10/07/2017 | 3.8 |
| 10/07/2017 | 4.1 |
| 10/07/2017 | 4.3 |
| 10/07/2017 | 4.5 |
| 10/07/2017 | 4.5 |
| 10/07/2017 | 4.6 |
| 10/07/2017 | 4.5 |
| 10/07/2017 | 4.5 |
| 10/07/2017 | 4.4 |
| 10/07/2017 | 4.4 |
| 10/07/2017 | 4.4 |
| 10/07/2017 | 4.3 |
| 10/07/2017 | 4.2 |
| 10/07/2017 | 4 |
| 10/07/2017 | 3.7 |
| 10/07/2017 | 3.4 |
| 10/07/2017 | 3.1 |
| 10/07/2017 | 2.8 |
| 11/07/2017 | 2.6 |
| 11/07/2017 | 2.5 |
| 11/07/2017 | 2.5 |
| 11/07/2017 | 2.6 |
| 11/07/2017 | 2.8 |
| 11/07/2017 | 3.3 |
| 11/07/2017 | 3.8 |
| 11/07/2017 | 4.2 |
| 11/07/2017 | 4.4 |
| 11/07/2017 | 4.5 |
| 11/07/2017 | 4.6 |
| 11/07/2017 | 4.6 |
| 11/07/2017 | 4.6 |
| 11/07/2017 | 4.5 |
| 11/07/2017 | 4.5 |
| 11/07/2017 | 4.4 |
| 11/07/2017 | 4.4 |
| 11/07/2017 | 4.4 |
| 11/07/2017 | 4.3 |
| 11/07/2017 | 4 |
| 11/07/2017 | 3.7 |
| 11/07/2017 | 3.4 |
| 11/07/2017 | 3.1 |
| 11/07/2017 | 2.8 |
| 12/07/2017 | 2.6 |
| 12/07/2017 | 2.5 |
| 12/07/2017 | 2.5 |
| 12/07/2017 | 2.6 |
| 12/07/2017 | 2.8 |
| 12/07/2017 | 3.3 |
| 12/07/2017 | 3.8 |
| 12/07/2017 | 4.2 |
| 12/07/2017 | 4.4 |
| 12/07/2017 | 4.6 |
| 12/07/2017 | 4.6 |
| 12/07/2017 | 4.6 |
| 12/07/2017 | 4.6 |
| 12/07/2017 | 4.5 |
| 12/07/2017 | 4.5 |
| 12/07/2017 | 4.4 |
| 12/07/2017 | 4.4 |
| 12/07/2017 | 4.4 |
| 12/07/2017 | 4.3 |
| 12/07/2017 | 4 |
| 12/07/2017 | 3.7 |
| 12/07/2017 | 3.5 |
| 12/07/2017 | 3.1 |
| 12/07/2017 | 2.8 |
| 13/07/2017 | 2.6 |
| 13/07/2017 | 2.5 |
| 13/07/2017 | 2.5 |
| 13/07/2017 | 2.6 |
| 13/07/2017 | 2.8 |
| 13/07/2017 | 3.3 |
| 13/07/2017 | 3.8 |
| 13/07/2017 | 4.2 |
| 13/07/2017 | 4.4 |
| 13/07/2017 | 4.5 |
| 13/07/2017 | 4.6 |
| 13/07/2017 | 4.6 |
| 13/07/2017 | 4.6 |
| 13/07/2017 | 4.5 |
| 13/07/2017 | 4.4 |
| 13/07/2017 | 4.4 |
| 13/07/2017 | 4.3 |
| 13/07/2017 | 4.3 |
| 13/07/2017 | 4.2 |
| 13/07/2017 | 4 |
| 13/07/2017 | 3.7 |
| 13/07/2017 | 3.4 |
| 13/07/2017 | 3.1 |
| 13/07/2017 | 2.8 |
| 14/07/2017 | 2.6 |
| 14/07/2017 | 2.5 |
| 14/07/2017 | 2.5 |
| 14/07/2017 | 2.6 |
| 14/07/2017 | 2.8 |
| 14/07/2017 | 3.3 |
| 14/07/2017 | 3.8 |
| 14/07/2017 | 4.2 |
| 14/07/2017 | 4.4 |
| 14/07/2017 | 4.5 |
| 14/07/2017 | 4.6 |
| 14/07/2017 | 4.6 |
| 14/07/2017 | 4.5 |
| 14/07/2017 | 4.4 |
| 14/07/2017 | 4.3 |
| 14/07/2017 | 4.3 |
| 14/07/2017 | 4.2 |
| 14/07/2017 | 4.2 |
| 14/07/2017 | 4.1 |
| 14/07/2017 | 3.8 |
| 14/07/2017 | 3.6 |
| 14/07/2017 | 3.3 |
| 14/07/2017 | 3 |
| 14/07/2017 | 2.8 |
| 15/07/2017 | 2.6 |
| 15/07/2017 | 2.5 |
| 15/07/2017 | 2.4 |
| 15/07/2017 | 2.4 |
| 15/07/2017 | 2.4 |
| 15/07/2017 | 2.5 |
| 15/07/2017 | 2.8 |
| 15/07/2017 | 3.1 |
| 15/07/2017 | 3.4 |
| 15/07/2017 | 3.7 |
| 15/07/2017 | 3.8 |
| 15/07/2017 | 3.8 |
| 15/07/2017 | 3.7 |
| 15/07/2017 | 3.6 |
| 15/07/2017 | 3.6 |
| 15/07/2017 | 3.5 |
| 15/07/2017 | 3.5 |
| 15/07/2017 | 3.6 |
| 15/07/2017 | 3.5 |
| 15/07/2017 | 3.4 |
| 15/07/2017 | 3.3 |
| 15/07/2017 | 3.1 |
| 15/07/2017 | 2.9 |
| 15/07/2017 | 2.6 |
| 16/07/2017 | 2.5 |
| 16/07/2017 | 2.4 |
| 16/07/2017 | 2.4 |
| 16/07/2017 | 2.3 |
| 16/07/2017 | 2.3 |
| 16/07/2017 | 2.3 |
| 16/07/2017 | 2.5 |
| 16/07/2017 | 2.7 |
| 16/07/2017 | 3 |
| 16/07/2017 | 3.2 |
| 16/07/2017 | 3.3 |
| 16/07/2017 | 3.4 |
| 16/07/2017 | 3.4 |
| 16/07/2017 | 3.3 |
| 16/07/2017 | 3.2 |
| 16/07/2017 | 3.2 |
| 16/07/2017 | 3.3 |
| 16/07/2017 | 3.3 |
| 16/07/2017 | 3.3 |
| 16/07/2017 | 3.3 |
| 16/07/2017 | 3.2 |
| 16/07/2017 | 3.1 |
| 16/07/2017 | 2.9 |
| 16/07/2017 | 2.7 |
| 17/07/2017 | 2.5 |
| 17/07/2017 | 2.4 |
| 17/07/2017 | 2.4 |
| 17/07/2017 | 2.5 |
| 17/07/2017 | 2.7 |
| 17/07/2017 | 3.2 |
| 17/07/2017 | 3.8 |
| 17/07/2017 | 4.1 |
| 17/07/2017 | 4.3 |
| 17/07/2017 | 4.4 |
| 17/07/2017 | 4.5 |
| 17/07/2017 | 4.5 |
| 17/07/2017 | 4.5 |
| 17/07/2017 | 4.5 |
| 17/07/2017 | 4.4 |
| 17/07/2017 | 4.3 |
| 17/07/2017 | 4.3 |
| 17/07/2017 | 4.3 |
| 17/07/2017 | 4.2 |
| 17/07/2017 | 3.9 |
| 17/07/2017 | 3.7 |
| 17/07/2017 | 3.4 |
| 17/07/2017 | 3 |
| 17/07/2017 | 2.8 |
| 18/07/2017 | 2.6 |
| 18/07/2017 | 2.5 |
| 18/07/2017 | 2.5 |
| 18/07/2017 | 2.6 |
| 18/07/2017 | 2.8 |
| 18/07/2017 | 3.3 |
| 18/07/2017 | 3.8 |
| 18/07/2017 | 4.2 |
| 18/07/2017 | 4.3 |
| 18/07/2017 | 4.5 |
| 18/07/2017 | 4.5 |
| 18/07/2017 | 4.6 |
| 18/07/2017 | 4.5 |
| 18/07/2017 | 4.5 |
| 18/07/2017 | 4.4 |
| 18/07/2017 | 4.4 |
| 18/07/2017 | 4.4 |
| 18/07/2017 | 4.3 |
| 18/07/2017 | 4.2 |
| 18/07/2017 | 4 |
| 18/07/2017 | 3.7 |
| 18/07/2017 | 3.4 |
| 18/07/2017 | 3.1 |
| 18/07/2017 | 2.8 |
| 19/07/2017 | 2.6 |
| 19/07/2017 | 2.5 |
| 19/07/2017 | 2.5 |
| 19/07/2017 | 2.6 |
| 19/07/2017 | 2.8 |
| 19/07/2017 | 3.3 |
| 19/07/2017 | 3.8 |
| 19/07/2017 | 4.2 |
| 19/07/2017 | 4.4 |
| 19/07/2017 | 4.5 |
| 19/07/2017 | 4.6 |
| 19/07/2017 | 4.6 |
| 19/07/2017 | 4.6 |
| 19/07/2017 | 4.5 |
| 19/07/2017 | 4.5 |
| 19/07/2017 | 4.4 |
| 19/07/2017 | 4.4 |
| 19/07/2017 | 4.3 |
| 19/07/2017 | 4.2 |
| 19/07/2017 | 4 |
| 19/07/2017 | 3.7 |
| 19/07/2017 | 3.4 |
| 19/07/2017 | 3.1 |
| 19/07/2017 | 2.8 |
| 20/07/2017 | 2.6 |
| 20/07/2017 | 2.5 |
| 20/07/2017 | 2.5 |
| 20/07/2017 | 2.6 |
| 20/07/2017 | 2.7 |
| 20/07/2017 | 3.1 |
| 20/07/2017 | 3.6 |
| 20/07/2017 | 4 |
| 20/07/2017 | 4.2 |
| 20/07/2017 | 4.4 |
| 20/07/2017 | 4.5 |
| 20/07/2017 | 4.5 |
| 20/07/2017 | 4.4 |
| 20/07/2017 | 4.4 |
| 20/07/2017 | 4.3 |
| 20/07/2017 | 4.2 |
| 20/07/2017 | 4.2 |
| 20/07/2017 | 4.2 |
| 20/07/2017 | 4.1 |
| 20/07/2017 | 3.8 |
| 20/07/2017 | 3.6 |
| 20/07/2017 | 3.4 |
| 20/07/2017 | 3 |
| 20/07/2017 | 2.8 |
| 21/07/2017 | 2.6 |
| 21/07/2017 | 2.5 |
| 21/07/2017 | 2.5 |
| 21/07/2017 | 2.5 |
| 21/07/2017 | 2.7 |
| 21/07/2017 | 3.1 |
| 21/07/2017 | 3.6 |
| 21/07/2017 | 4 |
| 21/07/2017 | 4.2 |
| 21/07/2017 | 4.4 |
| 21/07/2017 | 4.5 |
| 21/07/2017 | 4.5 |
| 21/07/2017 | 4.4 |
| 21/07/2017 | 4.3 |
| 21/07/2017 | 4.2 |
| 21/07/2017 | 4.1 |
| 21/07/2017 | 4.1 |
| 21/07/2017 | 4 |
| 21/07/2017 | 3.9 |
| 21/07/2017 | 3.7 |
| 21/07/2017 | 3.5 |
| 21/07/2017 | 3.3 |
| 21/07/2017 | 3 |
| 21/07/2017 | 2.7 |
| 22/07/2017 | 2.6 |
| 22/07/2017 | 2.5 |
| 22/07/2017 | 2.4 |
| 22/07/2017 | 2.4 |
| 22/07/2017 | 2.4 |
| 22/07/2017 | 2.4 |
| 22/07/2017 | 2.6 |
| 22/07/2017 | 3 |
| 22/07/2017 | 3.3 |
| 22/07/2017 | 3.6 |
| 22/07/2017 | 3.7 |
| 22/07/2017 | 3.7 |
| 22/07/2017 | 3.6 |
| 22/07/2017 | 3.5 |
| 22/07/2017 | 3.4 |
| 22/07/2017 | 3.4 |
| 22/07/2017 | 3.4 |
| 22/07/2017 | 3.4 |
| 22/07/2017 | 3.4 |
| 22/07/2017 | 3.3 |
| 22/07/2017 | 3.2 |
| 22/07/2017 | 3.1 |
| 22/07/2017 | 2.8 |
| 22/07/2017 | 2.6 |
| 23/07/2017 | 2.5 |
| 23/07/2017 | 2.4 |
| 23/07/2017 | 2.3 |
| 23/07/2017 | 2.3 |
| 23/07/2017 | 2.3 |
| 23/07/2017 | 2.3 |
| 23/07/2017 | 2.4 |
| 23/07/2017 | 2.6 |
| 23/07/2017 | 2.9 |
| 23/07/2017 | 3.1 |
| 23/07/2017 | 3.3 |
| 23/07/2017 | 3.3 |
| 23/07/2017 | 3.3 |
| 23/07/2017 | 3.2 |
| 23/07/2017 | 3.1 |
| 23/07/2017 | 3.1 |
| 23/07/2017 | 3.2 |
| 23/07/2017 | 3.2 |
| 23/07/2017 | 3.2 |
| 23/07/2017 | 3.2 |
| 23/07/2017 | 3.2 |
| 23/07/2017 | 3.1 |
| 23/07/2017 | 2.8 |
| 23/07/2017 | 2.6 |
| 24/07/2017 | 2.5 |
| 24/07/2017 | 2.4 |
| 24/07/2017 | 2.4 |
| 24/07/2017 | 2.5 |
| 24/07/2017 | 2.7 |
| 24/07/2017 | 3.1 |
| 24/07/2017 | 3.6 |
| 24/07/2017 | 3.9 |
| 24/07/2017 | 4.2 |
| 24/07/2017 | 4.3 |
| 24/07/2017 | 4.4 |
| 24/07/2017 | 4.4 |
| 24/07/2017 | 4.4 |
| 24/07/2017 | 4.3 |
| 24/07/2017 | 4.3 |
| 24/07/2017 | 4.2 |
| 24/07/2017 | 4.2 |
| 24/07/2017 | 4.2 |
| 24/07/2017 | 4.1 |
| 24/07/2017 | 3.8 |
| 24/07/2017 | 3.6 |
| 24/07/2017 | 3.3 |
| 24/07/2017 | 3 |
| 24/07/2017 | 2.7 |
| 25/07/2017 | 2.6 |
| 25/07/2017 | 2.5 |
| 25/07/2017 | 2.5 |
| 25/07/2017 | 2.5 |
| 25/07/2017 | 2.7 |
| 25/07/2017 | 3.1 |
| 25/07/2017 | 3.6 |
| 25/07/2017 | 4 |
| 25/07/2017 | 4.2 |
| 25/07/2017 | 4.4 |
| 25/07/2017 | 4.4 |
| 25/07/2017 | 4.5 |
| 25/07/2017 | 4.4 |
| 25/07/2017 | 4.3 |
| 25/07/2017 | 4.3 |
| 25/07/2017 | 4.2 |
| 25/07/2017 | 4.2 |
| 25/07/2017 | 4.2 |
| 25/07/2017 | 4.1 |
| 25/07/2017 | 3.9 |
| 25/07/2017 | 3.7 |
| 25/07/2017 | 3.4 |
| 25/07/2017 | 3 |
| 25/07/2017 | 2.8 |
| 26/07/2017 | 2.6 |
| 26/07/2017 | 2.5 |
| 26/07/2017 | 2.5 |
| 26/07/2017 | 2.6 |
| 26/07/2017 | 2.7 |
| 26/07/2017 | 3.2 |
| 26/07/2017 | 3.6 |
| 26/07/2017 | 4 |
| 26/07/2017 | 4.3 |
| 26/07/2017 | 4.4 |
| 26/07/2017 | 4.5 |
| 26/07/2017 | 4.5 |
| 26/07/2017 | 4.5 |
| 26/07/2017 | 4.4 |
| 26/07/2017 | 4.3 |
| 26/07/2017 | 4.2 |
| 26/07/2017 | 4.2 |
| 26/07/2017 | 4.2 |
| 26/07/2017 | 4.1 |
| 26/07/2017 | 3.9 |
| 26/07/2017 | 3.7 |
| 26/07/2017 | 3.4 |
| 26/07/2017 | 3 |
| 26/07/2017 | 2.8 |
| 27/07/2017 | 2.6 |
| 27/07/2017 | 2.5 |
| 27/07/2017 | 2.5 |
| 27/07/2017 | 2.6 |
| 27/07/2017 | 2.7 |
| 27/07/2017 | 3.1 |
| 27/07/2017 | 3.6 |
| 27/07/2017 | 4 |
| 27/07/2017 | 4.2 |
| 27/07/2017 | 4.4 |
| 27/07/2017 | 4.5 |
| 27/07/2017 | 4.5 |
| 27/07/2017 | 4.4 |
| 27/07/2017 | 4.3 |
| 27/07/2017 | 4.3 |
| 27/07/2017 | 4.2 |
| 27/07/2017 | 4.2 |
| 27/07/2017 | 4.2 |
| 27/07/2017 | 4.1 |
| 27/07/2017 | 3.8 |
| 27/07/2017 | 3.7 |
| 27/07/2017 | 3.4 |
| 27/07/2017 | 3 |
| 27/07/2017 | 2.8 |
| 28/07/2017 | 2.6 |
| 28/07/2017 | 2.5 |
| 28/07/2017 | 2.5 |
| 28/07/2017 | 2.6 |
| 28/07/2017 | 2.7 |
| 28/07/2017 | 3.1 |
| 28/07/2017 | 3.6 |
| 28/07/2017 | 4 |
| 28/07/2017 | 4.2 |
| 28/07/2017 | 4.4 |
| 28/07/2017 | 4.4 |
| 28/07/2017 | 4.4 |
| 28/07/2017 | 4.4 |
| 28/07/2017 | 4.2 |
| 28/07/2017 | 4.2 |
| 28/07/2017 | 4.1 |
| 28/07/2017 | 4.1 |
| 28/07/2017 | 4 |
| 28/07/2017 | 3.9 |
| 28/07/2017 | 3.7 |
| 28/07/2017 | 3.5 |
| 28/07/2017 | 3.3 |
| 28/07/2017 | 3 |
| 28/07/2017 | 2.7 |
| 29/07/2017 | 2.6 |
| 29/07/2017 | 2.5 |
| 29/07/2017 | 2.4 |
| 29/07/2017 | 2.4 |
| 29/07/2017 | 2.4 |
| 29/07/2017 | 2.4 |
| 29/07/2017 | 2.6 |
| 29/07/2017 | 3 |
| 29/07/2017 | 3.3 |
| 29/07/2017 | 3.6 |
| 29/07/2017 | 3.7 |
| 29/07/2017 | 3.7 |
| 29/07/2017 | 3.6 |
| 29/07/2017 | 3.5 |
| 29/07/2017 | 3.4 |
| 29/07/2017 | 3.4 |
| 29/07/2017 | 3.4 |
| 29/07/2017 | 3.4 |
| 29/07/2017 | 3.4 |
| 29/07/2017 | 3.3 |
| 29/07/2017 | 3.2 |
| 29/07/2017 | 3 |
| 29/07/2017 | 2.8 |
| 29/07/2017 | 2.6 |
| 30/07/2017 | 2.5 |
| 30/07/2017 | 2.4 |
| 30/07/2017 | 2.3 |
| 30/07/2017 | 2.3 |
| 30/07/2017 | 2.3 |
| 30/07/2017 | 2.3 |
| 30/07/2017 | 2.4 |
| 30/07/2017 | 2.6 |
| 30/07/2017 | 2.9 |
| 30/07/2017 | 3.1 |
| 30/07/2017 | 3.3 |
| 30/07/2017 | 3.3 |
| 30/07/2017 | 3.3 |
| 30/07/2017 | 3.2 |
| 30/07/2017 | 3.1 |
| 30/07/2017 | 3.1 |
| 30/07/2017 | 3.1 |
| 30/07/2017 | 3.2 |
| 30/07/2017 | 3.2 |
| 30/07/2017 | 3.2 |
| 30/07/2017 | 3.2 |
| 30/07/2017 | 3.1 |
| 30/07/2017 | 2.8 |
| 30/07/2017 | 2.6 |
| 31/07/2017 | 2.5 |
| 31/07/2017 | 2.4 |
| 31/07/2017 | 2.4 |
| 31/07/2017 | 2.5 |
| 31/07/2017 | 2.7 |
| 31/07/2017 | 3.1 |
| 31/07/2017 | 3.6 |
| 31/07/2017 | 3.9 |
| 31/07/2017 | 4.2 |
| 31/07/2017 | 4.3 |
| 31/07/2017 | 4.4 |
| 31/07/2017 | 4.4 |
| 31/07/2017 | 4.4 |
| 31/07/2017 | 4.3 |
| 31/07/2017 | 4.2 |
| 31/07/2017 | 4.2 |
| 31/07/2017 | 4.2 |
| 31/07/2017 | 4.1 |
| 31/07/2017 | 4 |
| 31/07/2017 | 3.8 |
| 31/07/2017 | 3.7 |
| 31/07/2017 | 3.3 |
| 31/07/2017 | 3 |
| 31/07/2017 | 2.7 |
| 01/08/2017 | 2.5 |
| 01/08/2017 | 2.5 |
| 01/08/2017 | 2.5 |
| 01/08/2017 | 2.6 |
| 01/08/2017 | 2.7 |
| 01/08/2017 | 3.1 |
| 01/08/2017 | 3.6 |
| 01/08/2017 | 4 |
| 01/08/2017 | 4.2 |
| 01/08/2017 | 4.4 |
| 01/08/2017 | 4.4 |
| 01/08/2017 | 4.4 |
| 01/08/2017 | 4.4 |
| 01/08/2017 | 4.3 |
| 01/08/2017 | 4.3 |
| 01/08/2017 | 4.2 |
| 01/08/2017 | 4.2 |
| 01/08/2017 | 4.2 |
| 01/08/2017 | 4.1 |
| 01/08/2017 | 3.9 |
| 01/08/2017 | 3.7 |
| 01/08/2017 | 3.3 |
| 01/08/2017 | 3 |
| 01/08/2017 | 2.7 |
| 02/08/2017 | 2.6 |
| 02/08/2017 | 2.5 |
| 02/08/2017 | 2.5 |
| 02/08/2017 | 2.6 |
| 02/08/2017 | 2.8 |
| 02/08/2017 | 3.2 |
| 02/08/2017 | 3.6 |
| 02/08/2017 | 4 |
| 02/08/2017 | 4.2 |
| 02/08/2017 | 4.4 |
| 02/08/2017 | 4.5 |
| 02/08/2017 | 4.5 |
| 02/08/2017 | 4.4 |
| 02/08/2017 | 4.4 |
| 02/08/2017 | 4.3 |
| 02/08/2017 | 4.2 |
| 02/08/2017 | 4.2 |
| 02/08/2017 | 4.2 |
| 02/08/2017 | 4.1 |
| 02/08/2017 | 3.9 |
| 02/08/2017 | 3.7 |
| 02/08/2017 | 3.3 |
| 02/08/2017 | 3 |
| 02/08/2017 | 2.7 |
| 03/08/2017 | 2.6 |
| 03/08/2017 | 2.5 |
| 03/08/2017 | 2.5 |
| 03/08/2017 | 2.6 |
| 03/08/2017 | 2.8 |
| 03/08/2017 | 3.1 |
| 03/08/2017 | 3.6 |
| 03/08/2017 | 4 |
| 03/08/2017 | 4.2 |
| 03/08/2017 | 4.4 |
| 03/08/2017 | 4.4 |
| 03/08/2017 | 4.4 |
| 03/08/2017 | 4.4 |
| 03/08/2017 | 4.3 |
| 03/08/2017 | 4.2 |
| 03/08/2017 | 4.2 |
| 03/08/2017 | 4.1 |
| 03/08/2017 | 4.1 |
| 03/08/2017 | 4 |
| 03/08/2017 | 3.8 |
| 03/08/2017 | 3.7 |
| 03/08/2017 | 3.3 |
| 03/08/2017 | 3 |
| 03/08/2017 | 2.7 |
| 04/08/2017 | 2.6 |
| 04/08/2017 | 2.5 |
| 04/08/2017 | 2.5 |
| 04/08/2017 | 2.6 |
| 04/08/2017 | 2.7 |
| 04/08/2017 | 3.1 |
| 04/08/2017 | 3.6 |
| 04/08/2017 | 4 |
| 04/08/2017 | 4.2 |
| 04/08/2017 | 4.4 |
| 04/08/2017 | 4.4 |
| 04/08/2017 | 4.4 |
| 04/08/2017 | 4.3 |
| 04/08/2017 | 4.2 |
| 04/08/2017 | 4.1 |
| 04/08/2017 | 4.1 |
| 04/08/2017 | 4 |
| 04/08/2017 | 4 |
| 04/08/2017 | 3.9 |
| 04/08/2017 | 3.7 |
| 04/08/2017 | 3.5 |
| 04/08/2017 | 3.2 |
| 04/08/2017 | 2.9 |
| 04/08/2017 | 2.7 |
| 05/08/2017 | 2.5 |
| 05/08/2017 | 2.5 |
| 05/08/2017 | 2.4 |
| 05/08/2017 | 2.4 |
| 05/08/2017 | 2.4 |
| 05/08/2017 | 2.4 |
| 05/08/2017 | 2.6 |
| 05/08/2017 | 3 |
| 05/08/2017 | 3.3 |
| 05/08/2017 | 3.6 |
| 05/08/2017 | 3.7 |
| 05/08/2017 | 3.7 |
| 05/08/2017 | 3.6 |
| 05/08/2017 | 3.5 |
| 05/08/2017 | 3.4 |
| 05/08/2017 | 3.4 |
| 05/08/2017 | 3.4 |
| 05/08/2017 | 3.4 |
| 05/08/2017 | 3.4 |
| 05/08/2017 | 3.3 |
| 05/08/2017 | 3.2 |
| 05/08/2017 | 3 |
| 05/08/2017 | 2.8 |
| 05/08/2017 | 2.6 |
| 06/08/2017 | 2.5 |
| 06/08/2017 | 2.4 |
| 06/08/2017 | 2.3 |
| 06/08/2017 | 2.3 |
| 06/08/2017 | 2.3 |
| 06/08/2017 | 2.3 |
| 06/08/2017 | 2.4 |
| 06/08/2017 | 2.6 |
| 06/08/2017 | 2.9 |
| 06/08/2017 | 3.1 |
| 06/08/2017 | 3.2 |
| 06/08/2017 | 3.3 |
| 06/08/2017 | 3.2 |
| 06/08/2017 | 3.1 |
| 06/08/2017 | 3.1 |
| 06/08/2017 | 3.1 |
| 06/08/2017 | 3.1 |
| 06/08/2017 | 3.2 |
| 06/08/2017 | 3.2 |
| 06/08/2017 | 3.2 |
| 06/08/2017 | 3.2 |
| 06/08/2017 | 3 |
| 06/08/2017 | 2.8 |
| 06/08/2017 | 2.6 |
| 07/08/2017 | 2.4 |
| 07/08/2017 | 2.4 |
| 07/08/2017 | 2.4 |
| 07/08/2017 | 2.5 |
| 07/08/2017 | 2.7 |
| 07/08/2017 | 3.1 |
| 07/08/2017 | 3.6 |
| 07/08/2017 | 3.9 |
| 07/08/2017 | 4.1 |
| 07/08/2017 | 4.3 |
| 07/08/2017 | 4.4 |
| 07/08/2017 | 4.4 |
| 07/08/2017 | 4.3 |
| 07/08/2017 | 4.3 |
| 07/08/2017 | 4.2 |
| 07/08/2017 | 4.1 |
| 07/08/2017 | 4.1 |
| 07/08/2017 | 4.1 |
| 07/08/2017 | 4 |
| 07/08/2017 | 3.8 |
| 07/08/2017 | 3.7 |
| 07/08/2017 | 3.3 |
| 07/08/2017 | 2.9 |
| 07/08/2017 | 2.7 |
| 08/08/2017 | 2.5 |
| 08/08/2017 | 2.5 |
| 08/08/2017 | 2.4 |
| 08/08/2017 | 2.6 |
| 08/08/2017 | 2.8 |
| 08/08/2017 | 3.1 |
| 08/08/2017 | 3.6 |
| 08/08/2017 | 4 |
| 08/08/2017 | 4.2 |
| 08/08/2017 | 4.3 |
| 08/08/2017 | 4.4 |
| 08/08/2017 | 4.4 |
| 08/08/2017 | 4.4 |
| 08/08/2017 | 4.3 |
| 08/08/2017 | 4.2 |
| 08/08/2017 | 4.2 |
| 08/08/2017 | 4.2 |
| 08/08/2017 | 4.1 |
| 08/08/2017 | 4 |
| 08/08/2017 | 3.9 |
| 08/08/2017 | 3.7 |
| 08/08/2017 | 3.3 |
| 08/08/2017 | 3 |
| 08/08/2017 | 2.7 |
| 09/08/2017 | 2.6 |
| 09/08/2017 | 2.5 |
| 09/08/2017 | 2.5 |
| 09/08/2017 | 2.6 |
| 09/08/2017 | 2.8 |
| 09/08/2017 | 3.2 |
| 09/08/2017 | 3.6 |
| 09/08/2017 | 4 |
| 09/08/2017 | 4.2 |
| 09/08/2017 | 4.4 |
| 09/08/2017 | 4.4 |
| 09/08/2017 | 4.5 |
| 09/08/2017 | 4.4 |
| 09/08/2017 | 4.3 |
| 09/08/2017 | 4.3 |
| 09/08/2017 | 4.2 |
| 09/08/2017 | 4.2 |
| 09/08/2017 | 4.1 |
| 09/08/2017 | 4 |
| 09/08/2017 | 3.9 |
| 09/08/2017 | 3.7 |
| 09/08/2017 | 3.3 |
| 09/08/2017 | 3 |
| 09/08/2017 | 2.7 |
| 10/08/2017 | 2.6 |
| 10/08/2017 | 2.5 |
| 10/08/2017 | 2.5 |
| 10/08/2017 | 2.6 |
| 10/08/2017 | 2.8 |
| 10/08/2017 | 3.1 |
| 10/08/2017 | 3.6 |
| 10/08/2017 | 4 |
| 10/08/2017 | 4.2 |
| 10/08/2017 | 4.3 |
| 10/08/2017 | 4.4 |
| 10/08/2017 | 4.4 |
| 10/08/2017 | 4.4 |
| 10/08/2017 | 4.3 |
| 10/08/2017 | 4.2 |
| 10/08/2017 | 4.2 |
| 10/08/2017 | 4.1 |
| 10/08/2017 | 4.1 |
| 10/08/2017 | 4 |
| 10/08/2017 | 3.8 |
| 10/08/2017 | 3.7 |
| 10/08/2017 | 3.3 |
| 10/08/2017 | 3 |
| 10/08/2017 | 2.7 |
| 11/08/2017 | 2.5 |
| 11/08/2017 | 2.5 |
| 11/08/2017 | 2.5 |
| 11/08/2017 | 2.6 |
| 11/08/2017 | 2.7 |
| 11/08/2017 | 3.1 |
| 11/08/2017 | 3.6 |
| 11/08/2017 | 4 |
| 11/08/2017 | 4.2 |
| 11/08/2017 | 4.4 |
| 11/08/2017 | 4.4 |
| 11/08/2017 | 4.4 |
| 11/08/2017 | 4.3 |
| 11/08/2017 | 4.2 |
| 11/08/2017 | 4.1 |
| 11/08/2017 | 4.1 |
| 11/08/2017 | 4 |
| 11/08/2017 | 4 |
| 11/08/2017 | 3.9 |
| 11/08/2017 | 3.7 |
| 11/08/2017 | 3.5 |
| 11/08/2017 | 3.2 |
| 11/08/2017 | 2.9 |
| 11/08/2017 | 2.7 |
| 12/08/2017 | 2.5 |
| 12/08/2017 | 2.4 |
| 12/08/2017 | 2.4 |
| 12/08/2017 | 2.4 |
| 12/08/2017 | 2.4 |
| 12/08/2017 | 2.4 |
| 12/08/2017 | 2.6 |
| 12/08/2017 | 3 |
| 12/08/2017 | 3.3 |
| 12/08/2017 | 3.5 |
| 12/08/2017 | 3.6 |
| 12/08/2017 | 3.6 |
| 12/08/2017 | 3.5 |
| 12/08/2017 | 3.4 |
| 12/08/2017 | 3.4 |
| 12/08/2017 | 3.3 |
| 12/08/2017 | 3.3 |
| 12/08/2017 | 3.4 |
| 12/08/2017 | 3.4 |
| 12/08/2017 | 3.3 |
| 12/08/2017 | 3.2 |
| 12/08/2017 | 3 |
| 12/08/2017 | 2.8 |
| 12/08/2017 | 2.6 |
| 13/08/2017 | 2.4 |
| 13/08/2017 | 2.4 |
| 13/08/2017 | 2.3 |
| 13/08/2017 | 2.3 |
| 13/08/2017 | 2.3 |
| 13/08/2017 | 2.3 |
| 13/08/2017 | 2.4 |
| 13/08/2017 | 2.6 |
| 13/08/2017 | 2.9 |
| 13/08/2017 | 3.1 |
| 13/08/2017 | 3.2 |
| 13/08/2017 | 3.3 |
| 13/08/2017 | 3.2 |
| 13/08/2017 | 3.1 |
| 13/08/2017 | 3.1 |
| 13/08/2017 | 3.1 |
| 13/08/2017 | 3.1 |
| 13/08/2017 | 3.2 |
| 13/08/2017 | 3.2 |
| 13/08/2017 | 3.2 |
| 13/08/2017 | 3.2 |
| 13/08/2017 | 3 |
| 13/08/2017 | 2.8 |
| 13/08/2017 | 2.6 |
| 14/08/2017 | 2.4 |
| 14/08/2017 | 2.4 |
| 14/08/2017 | 2.4 |
| 14/08/2017 | 2.5 |
| 14/08/2017 | 2.7 |
| 14/08/2017 | 3.1 |
| 14/08/2017 | 3.6 |
| 14/08/2017 | 3.9 |
| 14/08/2017 | 4.1 |
| 14/08/2017 | 4.3 |
| 14/08/2017 | 4.3 |
| 14/08/2017 | 4.4 |
| 14/08/2017 | 4.3 |
| 14/08/2017 | 4.3 |
| 14/08/2017 | 4.2 |
| 14/08/2017 | 4.1 |
| 14/08/2017 | 4.1 |
| 14/08/2017 | 4.1 |
| 14/08/2017 | 4.1 |
| 14/08/2017 | 3.9 |
| 14/08/2017 | 3.7 |
| 14/08/2017 | 3.3 |
| 14/08/2017 | 2.9 |
| 14/08/2017 | 2.7 |
| 15/08/2017 | 2.5 |
| 15/08/2017 | 2.4 |
| 15/08/2017 | 2.4 |
| 15/08/2017 | 2.5 |
| 15/08/2017 | 2.7 |
| 15/08/2017 | 3.1 |
| 15/08/2017 | 3.6 |
| 15/08/2017 | 4 |
| 15/08/2017 | 4.2 |
| 15/08/2017 | 4.3 |
| 15/08/2017 | 4.4 |
| 15/08/2017 | 4.4 |
| 15/08/2017 | 4.4 |
| 15/08/2017 | 4.3 |
| 15/08/2017 | 4.2 |
| 15/08/2017 | 4.2 |
| 15/08/2017 | 4.2 |
| 15/08/2017 | 4.2 |
| 15/08/2017 | 4.1 |
| 15/08/2017 | 3.9 |
| 15/08/2017 | 3.7 |
| 15/08/2017 | 3.3 |
| 15/08/2017 | 2.9 |
| 15/08/2017 | 2.7 |
| 16/08/2017 | 2.5 |
| 16/08/2017 | 2.5 |
| 16/08/2017 | 2.4 |
| 16/08/2017 | 2.6 |
| 16/08/2017 | 2.8 |
| 16/08/2017 | 3.2 |
| 16/08/2017 | 3.6 |
| 16/08/2017 | 4 |
| 16/08/2017 | 4.2 |
| 16/08/2017 | 4.4 |
| 16/08/2017 | 4.4 |
| 16/08/2017 | 4.5 |
| 16/08/2017 | 4.4 |
| 16/08/2017 | 4.3 |
| 16/08/2017 | 4.3 |
| 16/08/2017 | 4.2 |
| 16/08/2017 | 4.2 |
| 16/08/2017 | 4.1 |
| 16/08/2017 | 4.1 |
| 16/08/2017 | 3.9 |
| 16/08/2017 | 3.7 |
| 16/08/2017 | 3.3 |
| 16/08/2017 | 3 |
| 16/08/2017 | 2.7 |
| 17/08/2017 | 2.5 |
| 17/08/2017 | 2.5 |
| 17/08/2017 | 2.4 |
| 17/08/2017 | 2.5 |
| 17/08/2017 | 2.8 |
| 17/08/2017 | 3.2 |
| 17/08/2017 | 3.6 |
| 17/08/2017 | 4 |
| 17/08/2017 | 4.2 |
| 17/08/2017 | 4.3 |
| 17/08/2017 | 4.4 |
| 17/08/2017 | 4.4 |
| 17/08/2017 | 4.4 |
| 17/08/2017 | 4.3 |
| 17/08/2017 | 4.2 |
| 17/08/2017 | 4.1 |
| 17/08/2017 | 4.1 |
| 17/08/2017 | 4.1 |
| 17/08/2017 | 4.1 |
| 17/08/2017 | 3.9 |
| 17/08/2017 | 3.7 |
| 17/08/2017 | 3.3 |
| 17/08/2017 | 2.9 |
| 17/08/2017 | 2.7 |
| 18/08/2017 | 2.5 |
| 18/08/2017 | 2.4 |
| 18/08/2017 | 2.4 |
| 18/08/2017 | 2.5 |
| 18/08/2017 | 2.7 |
| 18/08/2017 | 3.1 |
| 18/08/2017 | 3.6 |
| 18/08/2017 | 4 |
| 18/08/2017 | 4.2 |
| 18/08/2017 | 4.4 |
| 18/08/2017 | 4.4 |
| 18/08/2017 | 4.4 |
| 18/08/2017 | 4.3 |
| 18/08/2017 | 4.2 |
| 18/08/2017 | 4.1 |
| 18/08/2017 | 4 |
| 18/08/2017 | 4 |
| 18/08/2017 | 4 |
| 18/08/2017 | 3.9 |
| 18/08/2017 | 3.8 |
| 18/08/2017 | 3.5 |
| 18/08/2017 | 3.2 |
| 18/08/2017 | 2.9 |
| 18/08/2017 | 2.7 |
| 19/08/2017 | 2.5 |
| 19/08/2017 | 2.4 |
| 19/08/2017 | 2.4 |
| 19/08/2017 | 2.4 |
| 19/08/2017 | 2.4 |
| 19/08/2017 | 2.4 |
| 19/08/2017 | 2.6 |
| 19/08/2017 | 2.9 |
| 19/08/2017 | 3.3 |
| 19/08/2017 | 3.6 |
| 19/08/2017 | 3.6 |
| 19/08/2017 | 3.6 |
| 19/08/2017 | 3.5 |
| 19/08/2017 | 3.4 |
| 19/08/2017 | 3.4 |
| 19/08/2017 | 3.3 |
| 19/08/2017 | 3.3 |
| 19/08/2017 | 3.4 |
| 19/08/2017 | 3.4 |
| 19/08/2017 | 3.4 |
| 19/08/2017 | 3.2 |
| 19/08/2017 | 3 |
| 19/08/2017 | 2.8 |
| 19/08/2017 | 2.6 |
| 20/08/2017 | 2.4 |
| 20/08/2017 | 2.4 |
| 20/08/2017 | 2.3 |
| 20/08/2017 | 2.3 |
| 20/08/2017 | 2.3 |
| 20/08/2017 | 2.3 |
| 20/08/2017 | 2.3 |
| 20/08/2017 | 2.6 |
| 20/08/2017 | 2.9 |
| 20/08/2017 | 3.1 |
| 20/08/2017 | 3.2 |
| 20/08/2017 | 3.3 |
| 20/08/2017 | 3.2 |
| 20/08/2017 | 3.1 |
| 20/08/2017 | 3.1 |
| 20/08/2017 | 3.1 |
| 20/08/2017 | 3.1 |
| 20/08/2017 | 3.2 |
| 20/08/2017 | 3.2 |
| 20/08/2017 | 3.3 |
| 20/08/2017 | 3.2 |
| 20/08/2017 | 3 |
| 20/08/2017 | 2.8 |
| 20/08/2017 | 2.6 |
| 21/08/2017 | 2.4 |
| 21/08/2017 | 2.4 |
| 21/08/2017 | 2.3 |
| 21/08/2017 | 2.5 |
| 21/08/2017 | 2.7 |
| 21/08/2017 | 3.1 |
| 21/08/2017 | 3.5 |
| 21/08/2017 | 3.9 |
| 21/08/2017 | 4.1 |
| 21/08/2017 | 4.3 |
| 21/08/2017 | 4.4 |
| 21/08/2017 | 4.4 |
| 21/08/2017 | 4.3 |
| 21/08/2017 | 4.3 |
| 21/08/2017 | 4.2 |
| 21/08/2017 | 4.1 |
| 21/08/2017 | 4.1 |
| 21/08/2017 | 4.1 |
| 21/08/2017 | 4.1 |
| 21/08/2017 | 3.9 |
| 21/08/2017 | 3.7 |
| 21/08/2017 | 3.3 |
| 21/08/2017 | 2.9 |
| 21/08/2017 | 2.7 |
| 22/08/2017 | 2.5 |
| 22/08/2017 | 2.4 |
| 22/08/2017 | 2.4 |
| 22/08/2017 | 2.5 |
| 22/08/2017 | 2.7 |
| 22/08/2017 | 3.2 |
| 22/08/2017 | 3.6 |
| 22/08/2017 | 4 |
| 22/08/2017 | 4.2 |
| 22/08/2017 | 4.3 |
| 22/08/2017 | 4.4 |
| 22/08/2017 | 4.4 |
| 22/08/2017 | 4.4 |
| 22/08/2017 | 4.3 |
| 22/08/2017 | 4.2 |
| 22/08/2017 | 4.2 |
| 22/08/2017 | 4.2 |
| 22/08/2017 | 4.2 |
| 22/08/2017 | 4.2 |
| 22/08/2017 | 4 |
| 22/08/2017 | 3.7 |
| 22/08/2017 | 3.3 |
| 22/08/2017 | 2.9 |
| 22/08/2017 | 2.7 |
| 23/08/2017 | 2.5 |
| 23/08/2017 | 2.4 |
| 23/08/2017 | 2.4 |
| 23/08/2017 | 2.5 |
| 23/08/2017 | 2.8 |
| 23/08/2017 | 3.2 |
| 23/08/2017 | 3.6 |
| 23/08/2017 | 4 |
| 23/08/2017 | 4.2 |
| 23/08/2017 | 4.4 |
| 23/08/2017 | 4.4 |
| 23/08/2017 | 4.5 |
| 23/08/2017 | 4.4 |
| 23/08/2017 | 4.3 |
| 23/08/2017 | 4.2 |
| 23/08/2017 | 4.2 |
| 23/08/2017 | 4.2 |
| 23/08/2017 | 4.2 |
| 23/08/2017 | 4.2 |
| 23/08/2017 | 4 |
| 23/08/2017 | 3.7 |
| 23/08/2017 | 3.3 |
| 23/08/2017 | 2.9 |
| 23/08/2017 | 2.7 |
| 24/08/2017 | 2.5 |
| 24/08/2017 | 2.4 |
| 24/08/2017 | 2.4 |
| 24/08/2017 | 2.5 |
| 24/08/2017 | 2.8 |
| 24/08/2017 | 3.2 |
| 24/08/2017 | 3.6 |
| 24/08/2017 | 4 |
| 24/08/2017 | 4.2 |
| 24/08/2017 | 4.4 |
| 24/08/2017 | 4.4 |
| 24/08/2017 | 4.4 |
| 24/08/2017 | 4.4 |
| 24/08/2017 | 4.3 |
| 24/08/2017 | 4.2 |
| 24/08/2017 | 4.1 |
| 24/08/2017 | 4.1 |
| 24/08/2017 | 4.1 |
| 24/08/2017 | 4.2 |
| 24/08/2017 | 4 |
| 24/08/2017 | 3.7 |
| 24/08/2017 | 3.3 |
| 24/08/2017 | 2.9 |
| 24/08/2017 | 2.7 |
| 25/08/2017 | 2.5 |
| 25/08/2017 | 2.4 |
| 25/08/2017 | 2.4 |
| 25/08/2017 | 2.5 |
| 25/08/2017 | 2.7 |
| 25/08/2017 | 3.1 |
| 25/08/2017 | 3.6 |
| 25/08/2017 | 4 |
| 25/08/2017 | 4.2 |
| 25/08/2017 | 4.4 |
| 25/08/2017 | 4.4 |
| 25/08/2017 | 4.4 |
| 25/08/2017 | 4.3 |
| 25/08/2017 | 4.2 |
| 25/08/2017 | 4.1 |
| 25/08/2017 | 4 |
| 25/08/2017 | 4 |
| 25/08/2017 | 4 |
| 25/08/2017 | 4 |
| 25/08/2017 | 3.8 |
| 25/08/2017 | 3.5 |
| 25/08/2017 | 3.2 |
| 25/08/2017 | 2.9 |
| 25/08/2017 | 2.7 |
| 26/08/2017 | 2.5 |
| 26/08/2017 | 2.4 |
| 26/08/2017 | 2.4 |
| 26/08/2017 | 2.4 |
| 26/08/2017 | 2.4 |
| 26/08/2017 | 2.4 |
| 26/08/2017 | 2.6 |
| 26/08/2017 | 2.9 |
| 26/08/2017 | 3.3 |
| 26/08/2017 | 3.6 |
| 26/08/2017 | 3.6 |
| 26/08/2017 | 3.6 |
| 26/08/2017 | 3.5 |
| 26/08/2017 | 3.4 |
| 26/08/2017 | 3.4 |
| 26/08/2017 | 3.3 |
| 26/08/2017 | 3.3 |
| 26/08/2017 | 3.4 |
| 26/08/2017 | 3.5 |
| 26/08/2017 | 3.4 |
| 26/08/2017 | 3.2 |
| 26/08/2017 | 3 |
| 26/08/2017 | 2.7 |
| 26/08/2017 | 2.6 |
| 27/08/2017 | 2.4 |
| 27/08/2017 | 2.3 |
| 27/08/2017 | 2.3 |
| 27/08/2017 | 2.3 |
| 27/08/2017 | 2.3 |
| 27/08/2017 | 2.3 |
| 27/08/2017 | 2.3 |
| 27/08/2017 | 2.6 |
| 27/08/2017 | 2.9 |
| 27/08/2017 | 3.1 |
| 27/08/2017 | 3.2 |
| 27/08/2017 | 3.3 |
| 27/08/2017 | 3.2 |
| 27/08/2017 | 3.1 |
| 27/08/2017 | 3.1 |
| 27/08/2017 | 3 |
| 27/08/2017 | 3.1 |
| 27/08/2017 | 3.2 |
| 27/08/2017 | 3.3 |
| 27/08/2017 | 3.3 |
| 27/08/2017 | 3.2 |
| 27/08/2017 | 3 |
| 27/08/2017 | 2.8 |
| 27/08/2017 | 2.6 |
| 28/08/2017 | 2.4 |
| 28/08/2017 | 2.3 |
| 28/08/2017 | 2.3 |
| 28/08/2017 | 2.4 |
| 28/08/2017 | 2.7 |
| 28/08/2017 | 3.1 |
| 28/08/2017 | 3.5 |
| 28/08/2017 | 3.9 |
| 28/08/2017 | 4.1 |
| 28/08/2017 | 4.3 |
| 28/08/2017 | 4.4 |
| 28/08/2017 | 4.4 |
| 28/08/2017 | 4.3 |
| 28/08/2017 | 4.3 |
| 28/08/2017 | 4.2 |
| 28/08/2017 | 4.1 |
| 28/08/2017 | 4.1 |
| 28/08/2017 | 4.1 |
| 28/08/2017 | 4.2 |
| 28/08/2017 | 4 |
| 28/08/2017 | 3.7 |
| 28/08/2017 | 3.3 |
| 28/08/2017 | 2.9 |
| 28/08/2017 | 2.7 |
| 29/08/2017 | 2.5 |
| 29/08/2017 | 2.4 |
| 29/08/2017 | 2.4 |
| 29/08/2017 | 2.5 |
| 29/08/2017 | 2.7 |
| 29/08/2017 | 3.2 |
| 29/08/2017 | 3.6 |
| 29/08/2017 | 4 |
| 29/08/2017 | 4.2 |
| 29/08/2017 | 4.3 |
| 29/08/2017 | 4.4 |
| 29/08/2017 | 4.4 |
| 29/08/2017 | 4.3 |
| 29/08/2017 | 4.3 |
| 29/08/2017 | 4.2 |
| 29/08/2017 | 4.2 |
| 29/08/2017 | 4.2 |
| 29/08/2017 | 4.2 |
| 29/08/2017 | 4.2 |
| 29/08/2017 | 4.1 |
| 29/08/2017 | 3.7 |
| 29/08/2017 | 3.3 |
| 29/08/2017 | 2.9 |
| 29/08/2017 | 2.7 |
| 30/08/2017 | 2.5 |
| 30/08/2017 | 2.4 |
| 30/08/2017 | 2.4 |
| 30/08/2017 | 2.5 |
| 30/08/2017 | 2.8 |
| 30/08/2017 | 3.2 |
| 30/08/2017 | 3.6 |
| 30/08/2017 | 4 |
| 30/08/2017 | 4.2 |
| 30/08/2017 | 4.4 |
| 30/08/2017 | 4.4 |
| 30/08/2017 | 4.5 |
| 30/08/2017 | 4.4 |
| 30/08/2017 | 4.3 |
| 30/08/2017 | 4.2 |
| 30/08/2017 | 4.2 |
| 30/08/2017 | 4.2 |
| 30/08/2017 | 4.2 |
| 30/08/2017 | 4.2 |
| 30/08/2017 | 4.1 |
| 30/08/2017 | 3.7 |
| 30/08/2017 | 3.3 |
| 30/08/2017 | 2.9 |
| 30/08/2017 | 2.7 |
| 31/08/2017 | 2.5 |
| 31/08/2017 | 2.4 |
| 31/08/2017 | 2.4 |
| 31/08/2017 | 2.5 |
| 31/08/2017 | 2.7 |
| 31/08/2017 | 3.2 |
| 31/08/2017 | 3.6 |
| 31/08/2017 | 4 |
| 31/08/2017 | 4.2 |
| 31/08/2017 | 4.4 |
| 31/08/2017 | 4.4 |
| 31/08/2017 | 4.4 |
| 31/08/2017 | 4.3 |
| 31/08/2017 | 4.3 |
| 31/08/2017 | 4.2 |
| 31/08/2017 | 4.1 |
| 31/08/2017 | 4.1 |
| 31/08/2017 | 4.1 |
| 31/08/2017 | 4.2 |
| 31/08/2017 | 4 |
| 31/08/2017 | 3.7 |
| 31/08/2017 | 3.3 |
| 31/08/2017 | 2.9 |
| 31/08/2017 | 2.7 |
| 01/09/2017 | 2.5 |
| 01/09/2017 | 2.4 |
| 01/09/2017 | 2.4 |
| 01/09/2017 | 2.5 |
| 01/09/2017 | 2.7 |
| 01/09/2017 | 3.1 |
| 01/09/2017 | 3.6 |
| 01/09/2017 | 3.9 |
| 01/09/2017 | 4.2 |
| 01/09/2017 | 4.4 |
| 01/09/2017 | 4.4 |
| 01/09/2017 | 4.4 |
| 01/09/2017 | 4.3 |
| 01/09/2017 | 4.2 |
| 01/09/2017 | 4.1 |
| 01/09/2017 | 4 |
| 01/09/2017 | 4 |
| 01/09/2017 | 4 |
| 01/09/2017 | 4.1 |
| 01/09/2017 | 3.9 |
| 01/09/2017 | 3.5 |
| 01/09/2017 | 3.2 |
| 01/09/2017 | 2.9 |
| 01/09/2017 | 2.6 |
| 02/09/2017 | 2.5 |
| 02/09/2017 | 2.4 |
| 02/09/2017 | 2.4 |
| 02/09/2017 | 2.4 |
| 02/09/2017 | 2.4 |
| 02/09/2017 | 2.5 |
| 02/09/2017 | 2.7 |
| 02/09/2017 | 3.1 |
| 02/09/2017 | 3.4 |
| 02/09/2017 | 3.6 |
| 02/09/2017 | 3.7 |
| 02/09/2017 | 3.7 |
| 02/09/2017 | 3.6 |
| 02/09/2017 | 3.5 |
| 02/09/2017 | 3.5 |
| 02/09/2017 | 3.4 |
| 02/09/2017 | 3.4 |
| 02/09/2017 | 3.5 |
| 02/09/2017 | 3.6 |
| 02/09/2017 | 3.6 |
| 02/09/2017 | 3.3 |
| 02/09/2017 | 3 |
| 02/09/2017 | 2.8 |
| 02/09/2017 | 2.5 |
| 03/09/2017 | 2.4 |
| 03/09/2017 | 2.3 |
| 03/09/2017 | 2.3 |
| 03/09/2017 | 2.3 |
| 03/09/2017 | 2.3 |
| 03/09/2017 | 2.4 |
| 03/09/2017 | 2.5 |
| 03/09/2017 | 2.7 |
| 03/09/2017 | 2.9 |
| 03/09/2017 | 3.1 |
| 03/09/2017 | 3.3 |
| 03/09/2017 | 3.3 |
| 03/09/2017 | 3.3 |
| 03/09/2017 | 3.2 |
| 03/09/2017 | 3.2 |
| 03/09/2017 | 3.1 |
| 03/09/2017 | 3.2 |
| 03/09/2017 | 3.3 |
| 03/09/2017 | 3.4 |
| 03/09/2017 | 3.5 |
| 03/09/2017 | 3.3 |
| 03/09/2017 | 3 |
| 03/09/2017 | 2.8 |
| 03/09/2017 | 2.5 |
| 04/09/2017 | 2.4 |
| 04/09/2017 | 2.3 |
| 04/09/2017 | 2.3 |
| 04/09/2017 | 2.4 |
| 04/09/2017 | 2.7 |
| 04/09/2017 | 3.2 |
| 04/09/2017 | 3.7 |
| 04/09/2017 | 4 |
| 04/09/2017 | 4.2 |
| 04/09/2017 | 4.4 |
| 04/09/2017 | 4.4 |
| 04/09/2017 | 4.5 |
| 04/09/2017 | 4.4 |
| 04/09/2017 | 4.4 |
| 04/09/2017 | 4.3 |
| 04/09/2017 | 4.2 |
| 04/09/2017 | 4.2 |
| 04/09/2017 | 4.2 |
| 04/09/2017 | 4.4 |
| 04/09/2017 | 4.2 |
| 04/09/2017 | 3.8 |
| 04/09/2017 | 3.3 |
| 04/09/2017 | 2.9 |
| 04/09/2017 | 2.7 |
| 05/09/2017 | 2.5 |
| 05/09/2017 | 2.4 |
| 05/09/2017 | 2.4 |
| 05/09/2017 | 2.5 |
| 05/09/2017 | 2.8 |
| 05/09/2017 | 3.3 |
| 05/09/2017 | 3.8 |
| 05/09/2017 | 4.1 |
| 05/09/2017 | 4.3 |
| 05/09/2017 | 4.4 |
| 05/09/2017 | 4.5 |
| 05/09/2017 | 4.5 |
| 05/09/2017 | 4.4 |
| 05/09/2017 | 4.4 |
| 05/09/2017 | 4.3 |
| 05/09/2017 | 4.3 |
| 05/09/2017 | 4.3 |
| 05/09/2017 | 4.3 |
| 05/09/2017 | 4.4 |
| 05/09/2017 | 4.2 |
| 05/09/2017 | 3.8 |
| 05/09/2017 | 3.3 |
| 05/09/2017 | 2.9 |
| 05/09/2017 | 2.7 |
| 06/09/2017 | 2.5 |
| 06/09/2017 | 2.4 |
| 06/09/2017 | 2.4 |
| 06/09/2017 | 2.5 |
| 06/09/2017 | 2.8 |
| 06/09/2017 | 3.3 |
| 06/09/2017 | 3.8 |
| 06/09/2017 | 4.1 |
| 06/09/2017 | 4.3 |
| 06/09/2017 | 4.5 |
| 06/09/2017 | 4.5 |
| 06/09/2017 | 4.5 |
| 06/09/2017 | 4.5 |
| 06/09/2017 | 4.4 |
| 06/09/2017 | 4.3 |
| 06/09/2017 | 4.3 |
| 06/09/2017 | 4.3 |
| 06/09/2017 | 4.3 |
| 06/09/2017 | 4.4 |
| 06/09/2017 | 4.3 |
| 06/09/2017 | 3.8 |
| 06/09/2017 | 3.3 |
| 06/09/2017 | 2.9 |
| 06/09/2017 | 2.7 |
| 07/09/2017 | 2.5 |
| 07/09/2017 | 2.4 |
| 07/09/2017 | 2.4 |
| 07/09/2017 | 2.5 |
| 07/09/2017 | 2.8 |
| 07/09/2017 | 3.3 |
| 07/09/2017 | 3.8 |
| 07/09/2017 | 4.1 |
| 07/09/2017 | 4.3 |
| 07/09/2017 | 4.4 |
| 07/09/2017 | 4.5 |
| 07/09/2017 | 4.5 |
| 07/09/2017 | 4.4 |
| 07/09/2017 | 4.4 |
| 07/09/2017 | 4.3 |
| 07/09/2017 | 4.2 |
| 07/09/2017 | 4.2 |
| 07/09/2017 | 4.2 |
| 07/09/2017 | 4.4 |
| 07/09/2017 | 4.2 |
| 07/09/2017 | 3.8 |
| 07/09/2017 | 3.3 |
| 07/09/2017 | 2.9 |
| 07/09/2017 | 2.7 |
| 08/09/2017 | 2.5 |
| 08/09/2017 | 2.4 |
| 08/09/2017 | 2.4 |
| 08/09/2017 | 2.5 |
| 08/09/2017 | 2.8 |
| 08/09/2017 | 3.3 |
| 08/09/2017 | 3.7 |
| 08/09/2017 | 4.1 |
| 08/09/2017 | 4.3 |
| 08/09/2017 | 4.4 |
| 08/09/2017 | 4.5 |
| 08/09/2017 | 4.5 |
| 08/09/2017 | 4.4 |
| 08/09/2017 | 4.3 |
| 08/09/2017 | 4.2 |
| 08/09/2017 | 4.1 |
| 08/09/2017 | 4.1 |
| 08/09/2017 | 4.1 |
| 08/09/2017 | 4.2 |
| 08/09/2017 | 4.1 |
| 08/09/2017 | 3.6 |
| 08/09/2017 | 3.2 |
| 08/09/2017 | 2.9 |
| 08/09/2017 | 2.6 |
| 09/09/2017 | 2.5 |
| 09/09/2017 | 2.4 |
| 09/09/2017 | 2.4 |
| 09/09/2017 | 2.4 |
| 09/09/2017 | 2.4 |
| 09/09/2017 | 2.6 |
| 09/09/2017 | 2.7 |
| 09/09/2017 | 3.1 |
| 09/09/2017 | 3.4 |
| 09/09/2017 | 3.6 |
| 09/09/2017 | 3.7 |
| 09/09/2017 | 3.7 |
| 09/09/2017 | 3.6 |
| 09/09/2017 | 3.5 |
| 09/09/2017 | 3.5 |
| 09/09/2017 | 3.4 |
| 09/09/2017 | 3.4 |
| 09/09/2017 | 3.5 |
| 09/09/2017 | 3.7 |
| 09/09/2017 | 3.7 |
| 09/09/2017 | 3.3 |
| 09/09/2017 | 3 |
| 09/09/2017 | 2.7 |
| 09/09/2017 | 2.5 |
| 10/09/2017 | 2.4 |
| 10/09/2017 | 2.3 |
| 10/09/2017 | 2.3 |
| 10/09/2017 | 2.3 |
| 10/09/2017 | 2.3 |
| 10/09/2017 | 2.4 |
| 10/09/2017 | 2.4 |
| 10/09/2017 | 2.7 |
| 10/09/2017 | 2.9 |
| 10/09/2017 | 3.1 |
| 10/09/2017 | 3.3 |
| 10/09/2017 | 3.3 |
| 10/09/2017 | 3.3 |
| 10/09/2017 | 3.2 |
| 10/09/2017 | 3.1 |
| 10/09/2017 | 3.1 |
| 10/09/2017 | 3.2 |
| 10/09/2017 | 3.3 |
| 10/09/2017 | 3.5 |
| 10/09/2017 | 3.5 |
| 10/09/2017 | 3.3 |
| 10/09/2017 | 3 |
| 10/09/2017 | 2.7 |
| 10/09/2017 | 2.5 |
| 11/09/2017 | 2.4 |
| 11/09/2017 | 2.3 |
| 11/09/2017 | 2.3 |
| 11/09/2017 | 2.4 |
| 11/09/2017 | 2.7 |
| 11/09/2017 | 3.3 |
| 11/09/2017 | 3.7 |
| 11/09/2017 | 4 |
| 11/09/2017 | 4.2 |
| 11/09/2017 | 4.4 |
| 11/09/2017 | 4.4 |
| 11/09/2017 | 4.5 |
| 11/09/2017 | 4.4 |
| 11/09/2017 | 4.4 |
| 11/09/2017 | 4.3 |
| 11/09/2017 | 4.2 |
| 11/09/2017 | 4.2 |
| 11/09/2017 | 4.2 |
| 11/09/2017 | 4.4 |
| 11/09/2017 | 4.3 |
| 11/09/2017 | 3.8 |
| 11/09/2017 | 3.3 |
| 11/09/2017 | 2.9 |
| 11/09/2017 | 2.6 |
| 12/09/2017 | 2.5 |
| 12/09/2017 | 2.4 |
| 12/09/2017 | 2.4 |
| 12/09/2017 | 2.5 |
| 12/09/2017 | 2.8 |
| 12/09/2017 | 3.3 |
| 12/09/2017 | 3.8 |
| 12/09/2017 | 4.1 |
| 12/09/2017 | 4.3 |
| 12/09/2017 | 4.4 |
| 12/09/2017 | 4.5 |
| 12/09/2017 | 4.5 |
| 12/09/2017 | 4.4 |
| 12/09/2017 | 4.4 |
| 12/09/2017 | 4.3 |
| 12/09/2017 | 4.3 |
| 12/09/2017 | 4.3 |
| 12/09/2017 | 4.3 |
| 12/09/2017 | 4.5 |
| 12/09/2017 | 4.3 |
| 12/09/2017 | 3.8 |
| 12/09/2017 | 3.3 |
| 12/09/2017 | 2.9 |
| 12/09/2017 | 2.7 |
| 13/09/2017 | 2.5 |
| 13/09/2017 | 2.4 |
| 13/09/2017 | 2.4 |
| 13/09/2017 | 2.5 |
| 13/09/2017 | 2.8 |
| 13/09/2017 | 3.3 |
| 13/09/2017 | 3.8 |
| 13/09/2017 | 4.1 |
| 13/09/2017 | 4.3 |
| 13/09/2017 | 4.5 |
| 13/09/2017 | 4.5 |
| 13/09/2017 | 4.5 |
| 13/09/2017 | 4.5 |
| 13/09/2017 | 4.4 |
| 13/09/2017 | 4.3 |
| 13/09/2017 | 4.3 |
| 13/09/2017 | 4.2 |
| 13/09/2017 | 4.3 |
| 13/09/2017 | 4.5 |
| 13/09/2017 | 4.3 |
| 13/09/2017 | 3.8 |
| 13/09/2017 | 3.3 |
| 13/09/2017 | 2.9 |
| 13/09/2017 | 2.7 |
| 14/09/2017 | 2.5 |
| 14/09/2017 | 2.4 |
| 14/09/2017 | 2.4 |
| 14/09/2017 | 2.5 |
| 14/09/2017 | 2.8 |
| 14/09/2017 | 3.3 |
| 14/09/2017 | 3.8 |
| 14/09/2017 | 4.1 |
| 14/09/2017 | 4.3 |
| 14/09/2017 | 4.4 |
| 14/09/2017 | 4.5 |
| 14/09/2017 | 4.5 |
| 14/09/2017 | 4.4 |
| 14/09/2017 | 4.4 |
| 14/09/2017 | 4.3 |
| 14/09/2017 | 4.2 |
| 14/09/2017 | 4.2 |
| 14/09/2017 | 4.3 |
| 14/09/2017 | 4.5 |
| 14/09/2017 | 4.3 |
| 14/09/2017 | 3.8 |
| 14/09/2017 | 3.3 |
| 14/09/2017 | 2.9 |
| 14/09/2017 | 2.7 |
| 15/09/2017 | 2.5 |
| 15/09/2017 | 2.4 |
| 15/09/2017 | 2.4 |
| 15/09/2017 | 2.5 |
| 15/09/2017 | 2.8 |
| 15/09/2017 | 3.3 |
| 15/09/2017 | 3.7 |
| 15/09/2017 | 4.1 |
| 15/09/2017 | 4.3 |
| 15/09/2017 | 4.4 |
| 15/09/2017 | 4.5 |
| 15/09/2017 | 4.5 |
| 15/09/2017 | 4.4 |
| 15/09/2017 | 4.3 |
| 15/09/2017 | 4.2 |
| 15/09/2017 | 4.1 |
| 15/09/2017 | 4.1 |
| 15/09/2017 | 4.1 |
| 15/09/2017 | 4.3 |
| 15/09/2017 | 4.1 |
| 15/09/2017 | 3.6 |
| 15/09/2017 | 3.2 |
| 15/09/2017 | 2.9 |
| 15/09/2017 | 2.6 |
| 16/09/2017 | 2.5 |
| 16/09/2017 | 2.4 |
| 16/09/2017 | 2.4 |
| 16/09/2017 | 2.4 |
| 16/09/2017 | 2.4 |
| 16/09/2017 | 2.6 |
| 16/09/2017 | 2.7 |
| 16/09/2017 | 3.1 |
| 16/09/2017 | 3.4 |
| 16/09/2017 | 3.6 |
| 16/09/2017 | 3.7 |
| 16/09/2017 | 3.7 |
| 16/09/2017 | 3.6 |
| 16/09/2017 | 3.5 |
| 16/09/2017 | 3.4 |
| 16/09/2017 | 3.4 |
| 16/09/2017 | 3.4 |
| 16/09/2017 | 3.5 |
| 16/09/2017 | 3.8 |
| 16/09/2017 | 3.7 |
| 16/09/2017 | 3.3 |
| 16/09/2017 | 3 |
| 16/09/2017 | 2.7 |
| 16/09/2017 | 2.5 |
| 17/09/2017 | 2.4 |
| 17/09/2017 | 2.3 |
| 17/09/2017 | 2.3 |
| 17/09/2017 | 2.3 |
| 17/09/2017 | 2.3 |
| 17/09/2017 | 2.4 |
| 17/09/2017 | 2.5 |
| 17/09/2017 | 2.7 |
| 17/09/2017 | 3 |
| 17/09/2017 | 3.1 |
| 17/09/2017 | 3.3 |
| 17/09/2017 | 3.4 |
| 17/09/2017 | 3.3 |
| 17/09/2017 | 3.2 |
| 17/09/2017 | 3.1 |
| 17/09/2017 | 3.1 |
| 17/09/2017 | 3.2 |
| 17/09/2017 | 3.3 |
| 17/09/2017 | 3.6 |
| 17/09/2017 | 3.6 |
| 17/09/2017 | 3.3 |
| 17/09/2017 | 3 |
| 17/09/2017 | 2.7 |
| 17/09/2017 | 2.5 |
| 18/09/2017 | 2.4 |
| 18/09/2017 | 2.3 |
| 18/09/2017 | 2.3 |
| 18/09/2017 | 2.4 |
| 18/09/2017 | 2.7 |
| 18/09/2017 | 3.3 |
| 18/09/2017 | 3.7 |
| 18/09/2017 | 4.1 |
| 18/09/2017 | 4.3 |
| 18/09/2017 | 4.4 |
| 18/09/2017 | 4.4 |
| 18/09/2017 | 4.5 |
| 18/09/2017 | 4.4 |
| 18/09/2017 | 4.4 |
| 18/09/2017 | 4.3 |
| 18/09/2017 | 4.2 |
| 18/09/2017 | 4.2 |
| 18/09/2017 | 4.3 |
| 18/09/2017 | 4.5 |
| 18/09/2017 | 4.3 |
| 18/09/2017 | 3.8 |
| 18/09/2017 | 3.3 |
| 18/09/2017 | 2.9 |
| 18/09/2017 | 2.6 |
| 19/09/2017 | 2.5 |
| 19/09/2017 | 2.4 |
| 19/09/2017 | 2.4 |
| 19/09/2017 | 2.5 |
| 19/09/2017 | 2.8 |
| 19/09/2017 | 3.3 |
| 19/09/2017 | 3.8 |
| 19/09/2017 | 4.1 |
| 19/09/2017 | 4.3 |
| 19/09/2017 | 4.4 |
| 19/09/2017 | 4.5 |
| 19/09/2017 | 4.5 |
| 19/09/2017 | 4.4 |
| 19/09/2017 | 4.4 |
| 19/09/2017 | 4.3 |
| 19/09/2017 | 4.3 |
| 19/09/2017 | 4.3 |
| 19/09/2017 | 4.4 |
| 19/09/2017 | 4.6 |
| 19/09/2017 | 4.3 |
| 19/09/2017 | 3.8 |
| 19/09/2017 | 3.3 |
| 19/09/2017 | 2.9 |
| 19/09/2017 | 2.7 |
| 20/09/2017 | 2.5 |
| 20/09/2017 | 2.4 |
| 20/09/2017 | 2.4 |
| 20/09/2017 | 2.5 |
| 20/09/2017 | 2.8 |
| 20/09/2017 | 3.4 |
| 20/09/2017 | 3.8 |
| 20/09/2017 | 4.2 |
| 20/09/2017 | 4.4 |
| 20/09/2017 | 4.5 |
| 20/09/2017 | 4.5 |
| 20/09/2017 | 4.5 |
| 20/09/2017 | 4.5 |
| 20/09/2017 | 4.4 |
| 20/09/2017 | 4.3 |
| 20/09/2017 | 4.3 |
| 20/09/2017 | 4.3 |
| 20/09/2017 | 4.4 |
| 20/09/2017 | 4.6 |
| 20/09/2017 | 4.3 |
| 20/09/2017 | 3.8 |
| 20/09/2017 | 3.3 |
| 20/09/2017 | 2.9 |
| 20/09/2017 | 2.7 |
| 21/09/2017 | 2.5 |
| 21/09/2017 | 2.4 |
| 21/09/2017 | 2.4 |
| 21/09/2017 | 2.5 |
| 21/09/2017 | 2.8 |
| 21/09/2017 | 3.3 |
| 21/09/2017 | 3.8 |
| 21/09/2017 | 4.2 |
| 21/09/2017 | 4.3 |
| 21/09/2017 | 4.5 |
| 21/09/2017 | 4.5 |
| 21/09/2017 | 4.5 |
| 21/09/2017 | 4.5 |
| 21/09/2017 | 4.4 |
| 21/09/2017 | 4.3 |
| 21/09/2017 | 4.2 |
| 21/09/2017 | 4.3 |
| 21/09/2017 | 4.4 |
| 21/09/2017 | 4.6 |
| 21/09/2017 | 4.3 |
| 21/09/2017 | 3.8 |
| 21/09/2017 | 3.3 |
| 21/09/2017 | 2.9 |
| 21/09/2017 | 2.7 |
| 22/09/2017 | 2.5 |
| 22/09/2017 | 2.4 |
| 22/09/2017 | 2.4 |
| 22/09/2017 | 2.5 |
| 22/09/2017 | 2.8 |
| 22/09/2017 | 3.3 |
| 22/09/2017 | 3.8 |
| 22/09/2017 | 4.1 |
| 22/09/2017 | 4.3 |
| 22/09/2017 | 4.5 |
| 22/09/2017 | 4.5 |
| 22/09/2017 | 4.5 |
| 22/09/2017 | 4.4 |
| 22/09/2017 | 4.3 |
| 22/09/2017 | 4.2 |
| 22/09/2017 | 4.1 |
| 22/09/2017 | 4.2 |
| 22/09/2017 | 4.3 |
| 22/09/2017 | 4.4 |
| 22/09/2017 | 4.1 |
| 22/09/2017 | 3.6 |
| 22/09/2017 | 3.2 |
| 22/09/2017 | 2.9 |
| 22/09/2017 | 2.6 |
| 23/09/2017 | 2.5 |
| 23/09/2017 | 2.4 |
| 23/09/2017 | 2.4 |
| 23/09/2017 | 2.4 |
| 23/09/2017 | 2.4 |
| 23/09/2017 | 2.6 |
| 23/09/2017 | 2.8 |
| 23/09/2017 | 3.1 |
| 23/09/2017 | 3.4 |
| 23/09/2017 | 3.7 |
| 23/09/2017 | 3.7 |
| 23/09/2017 | 3.7 |
| 23/09/2017 | 3.6 |
| 23/09/2017 | 3.5 |
| 23/09/2017 | 3.5 |
| 23/09/2017 | 3.4 |
| 23/09/2017 | 3.5 |
| 23/09/2017 | 3.6 |
| 23/09/2017 | 3.8 |
| 23/09/2017 | 3.7 |
| 23/09/2017 | 3.3 |
| 23/09/2017 | 3 |
| 23/09/2017 | 2.8 |
| 23/09/2017 | 2.5 |
| 24/09/2017 | 2.4 |
| 24/09/2017 | 2.3 |
| 24/09/2017 | 2.3 |
| 24/09/2017 | 2.3 |
| 24/09/2017 | 2.3 |
| 24/09/2017 | 2.4 |
| 24/09/2017 | 2.5 |
| 24/09/2017 | 2.7 |
| 24/09/2017 | 3 |
| 24/09/2017 | 3.2 |
| 24/09/2017 | 3.3 |
| 24/09/2017 | 3.4 |
| 24/09/2017 | 3.3 |
| 24/09/2017 | 3.2 |
| 24/09/2017 | 3.2 |
| 24/09/2017 | 3.1 |
| 24/09/2017 | 3.2 |
| 24/09/2017 | 3.4 |
| 24/09/2017 | 3.6 |
| 24/09/2017 | 3.6 |
| 24/09/2017 | 3.3 |
| 24/09/2017 | 3 |
| 24/09/2017 | 2.8 |
| 24/09/2017 | 2.5 |
| 25/09/2017 | 2.4 |
| 25/09/2017 | 2.3 |
| 25/09/2017 | 2.3 |
| 25/09/2017 | 2.4 |
| 25/09/2017 | 2.7 |
| 25/09/2017 | 3.3 |
| 25/09/2017 | 3.8 |
| 25/09/2017 | 4.1 |
| 25/09/2017 | 4.3 |
| 25/09/2017 | 4.4 |
| 25/09/2017 | 4.5 |
| 25/09/2017 | 4.5 |
| 25/09/2017 | 4.4 |
| 25/09/2017 | 4.4 |
| 25/09/2017 | 4.3 |
| 25/09/2017 | 4.2 |
| 25/09/2017 | 4.3 |
| 25/09/2017 | 4.4 |
| 25/09/2017 | 4.6 |
| 25/09/2017 | 4.3 |
| 25/09/2017 | 3.8 |
| 25/09/2017 | 3.3 |
| 25/09/2017 | 2.9 |
| 25/09/2017 | 2.7 |
| 26/09/2017 | 2.5 |
| 26/09/2017 | 2.4 |
| 26/09/2017 | 2.4 |
| 26/09/2017 | 2.5 |
| 26/09/2017 | 2.8 |
| 26/09/2017 | 3.4 |
| 26/09/2017 | 3.8 |
| 26/09/2017 | 4.2 |
| 26/09/2017 | 4.4 |
| 26/09/2017 | 4.5 |
| 26/09/2017 | 4.5 |
| 26/09/2017 | 4.5 |
| 26/09/2017 | 4.5 |
| 26/09/2017 | 4.4 |
| 26/09/2017 | 4.3 |
| 26/09/2017 | 4.3 |
| 26/09/2017 | 4.4 |
| 26/09/2017 | 4.5 |
| 26/09/2017 | 4.7 |
| 26/09/2017 | 4.3 |
| 26/09/2017 | 3.8 |
| 26/09/2017 | 3.3 |
| 26/09/2017 | 2.9 |
| 26/09/2017 | 2.7 |
| 27/09/2017 | 2.5 |
| 27/09/2017 | 2.4 |
| 27/09/2017 | 2.4 |
| 27/09/2017 | 2.5 |
| 27/09/2017 | 2.8 |
| 27/09/2017 | 3.4 |
| 27/09/2017 | 3.9 |
| 27/09/2017 | 4.2 |
| 27/09/2017 | 4.4 |
| 27/09/2017 | 4.5 |
| 27/09/2017 | 4.6 |
| 27/09/2017 | 4.6 |
| 27/09/2017 | 4.5 |
| 27/09/2017 | 4.4 |
| 27/09/2017 | 4.4 |
| 27/09/2017 | 4.3 |
| 27/09/2017 | 4.4 |
| 27/09/2017 | 4.5 |
| 27/09/2017 | 4.7 |
| 27/09/2017 | 4.3 |
| 27/09/2017 | 3.8 |
| 27/09/2017 | 3.3 |
| 27/09/2017 | 2.9 |
| 27/09/2017 | 2.7 |
| 28/09/2017 | 2.5 |
| 28/09/2017 | 2.4 |
| 28/09/2017 | 2.4 |
| 28/09/2017 | 2.5 |
| 28/09/2017 | 2.8 |
| 28/09/2017 | 3.4 |
| 28/09/2017 | 3.9 |
| 28/09/2017 | 4.2 |
| 28/09/2017 | 4.4 |
| 28/09/2017 | 4.5 |
| 28/09/2017 | 4.5 |
| 28/09/2017 | 4.5 |
| 28/09/2017 | 4.5 |
| 28/09/2017 | 4.4 |
| 28/09/2017 | 4.3 |
| 28/09/2017 | 4.3 |
| 28/09/2017 | 4.3 |
| 28/09/2017 | 4.5 |
| 28/09/2017 | 4.6 |
| 28/09/2017 | 4.3 |
| 28/09/2017 | 3.8 |
| 28/09/2017 | 3.3 |
| 28/09/2017 | 2.9 |
| 28/09/2017 | 2.7 |
| 29/09/2017 | 2.5 |
| 29/09/2017 | 2.4 |
| 29/09/2017 | 2.4 |
| 29/09/2017 | 2.5 |
| 29/09/2017 | 2.8 |
| 29/09/2017 | 3.3 |
| 29/09/2017 | 3.8 |
| 29/09/2017 | 4.2 |
| 29/09/2017 | 4.4 |
| 29/09/2017 | 4.5 |
| 29/09/2017 | 4.5 |
| 29/09/2017 | 4.5 |
| 29/09/2017 | 4.4 |
| 29/09/2017 | 4.3 |
| 29/09/2017 | 4.2 |
| 29/09/2017 | 4.2 |
| 29/09/2017 | 4.2 |
| 29/09/2017 | 4.4 |
| 29/09/2017 | 4.5 |
| 29/09/2017 | 4.1 |
| 29/09/2017 | 3.6 |
| 29/09/2017 | 3.2 |
| 29/09/2017 | 2.9 |
| 29/09/2017 | 2.6 |
| 30/09/2017 | 2.5 |
| 30/09/2017 | 2.4 |
| 30/09/2017 | 2.4 |
| 30/09/2017 | 2.4 |
| 30/09/2017 | 2.5 |
| 30/09/2017 | 2.6 |
| 30/09/2017 | 2.8 |
| 30/09/2017 | 3.1 |
| 30/09/2017 | 3.4 |
| 30/09/2017 | 3.7 |
| 30/09/2017 | 3.7 |
| 30/09/2017 | 3.7 |
| 30/09/2017 | 3.6 |
| 30/09/2017 | 3.5 |
| 30/09/2017 | 3.5 |
| 30/09/2017 | 3.4 |
| 30/09/2017 | 3.5 |
| 30/09/2017 | 3.7 |
| 30/09/2017 | 3.9 |
| 30/09/2017 | 3.7 |
| 30/09/2017 | 3.3 |
| 30/09/2017 | 3 |
| 30/09/2017 | 2.8 |
| 30/09/2017 | 2.5 |
| 01/10/2017 | 2.4 |
| 01/10/2017 | 2.3 |
| 01/10/2017 | 2.3 |
| 01/10/2017 | 2.3 |
| 01/10/2017 | 2.3 |
| 01/10/2017 | 2.4 |
| 01/10/2017 | 2.5 |
| 01/10/2017 | 2.7 |
| 01/10/2017 | 3 |
| 01/10/2017 | 3.2 |
| 01/10/2017 | 3.3 |
| 01/10/2017 | 3.4 |
| 01/10/2017 | 3.3 |
| 01/10/2017 | 3.2 |
| 01/10/2017 | 3.2 |
| 01/10/2017 | 3.2 |
| 01/10/2017 | 3.3 |
| 01/10/2017 | 3.5 |
| 01/10/2017 | 3.7 |
| 01/10/2017 | 3.6 |
| 01/10/2017 | 3.3 |
| 01/10/2017 | 3 |
| 01/10/2017 | 2.8 |
| 01/10/2017 | 2.5 |
| 02/10/2017 | 2.4 |
| 02/10/2017 | 2.3 |
| 02/10/2017 | 2.3 |
| 02/10/2017 | 2.3 |
| 02/10/2017 | 2.5 |
| 02/10/2017 | 2.8 |
| 02/10/2017 | 3.1 |
| 02/10/2017 | 3.4 |
| 02/10/2017 | 3.7 |
| 02/10/2017 | 3.8 |
| 02/10/2017 | 3.9 |
| 02/10/2017 | 3.9 |
| 02/10/2017 | 3.8 |
| 02/10/2017 | 3.7 |
| 02/10/2017 | 3.6 |
| 02/10/2017 | 3.7 |
| 02/10/2017 | 3.8 |
| 02/10/2017 | 4 |
| 02/10/2017 | 4.1 |
| 02/10/2017 | 3.9 |
| 02/10/2017 | 3.4 |
| 02/10/2017 | 3.1 |
| 02/10/2017 | 2.9 |
| 02/10/2017 | 2.6 |
| 03/10/2017 | 2.5 |
| 03/10/2017 | 2.4 |
| 03/10/2017 | 2.3 |
| 03/10/2017 | 2.3 |
| 03/10/2017 | 2.4 |
| 03/10/2017 | 2.5 |
| 03/10/2017 | 2.6 |
| 03/10/2017 | 2.9 |
| 03/10/2017 | 3.1 |
| 03/10/2017 | 3.3 |
| 03/10/2017 | 3.4 |
| 03/10/2017 | 3.4 |
| 03/10/2017 | 3.3 |
| 03/10/2017 | 3.2 |
| 03/10/2017 | 3.2 |
| 03/10/2017 | 3.2 |
| 03/10/2017 | 3.2 |
| 03/10/2017 | 3.5 |
| 03/10/2017 | 3.6 |
| 03/10/2017 | 3.5 |
| 03/10/2017 | 3.2 |
| 03/10/2017 | 2.9 |
| 03/10/2017 | 2.7 |
| 03/10/2017 | 2.7 |
| 04/10/2017 | 2.5 |
| 04/10/2017 | 2.4 |
| 04/10/2017 | 2.4 |
| 04/10/2017 | 2.5 |
| 04/10/2017 | 2.8 |
| 04/10/2017 | 3.4 |
| 04/10/2017 | 3.9 |
| 04/10/2017 | 4.3 |
| 04/10/2017 | 4.4 |
| 04/10/2017 | 4.5 |
| 04/10/2017 | 4.6 |
| 04/10/2017 | 4.6 |
| 04/10/2017 | 4.5 |
| 04/10/2017 | 4.4 |
| 04/10/2017 | 4.4 |
| 04/10/2017 | 4.3 |
| 04/10/2017 | 4.4 |
| 04/10/2017 | 4.6 |
| 04/10/2017 | 4.8 |
| 04/10/2017 | 4.4 |
| 04/10/2017 | 3.8 |
| 04/10/2017 | 3.3 |
| 04/10/2017 | 3 |
| 04/10/2017 | 2.7 |
| 05/10/2017 | 2.5 |
| 05/10/2017 | 2.4 |
| 05/10/2017 | 2.4 |
| 05/10/2017 | 2.5 |
| 05/10/2017 | 2.8 |
| 05/10/2017 | 3.4 |
| 05/10/2017 | 3.9 |
| 05/10/2017 | 4.2 |
| 05/10/2017 | 4.4 |
| 05/10/2017 | 4.5 |
| 05/10/2017 | 4.5 |
| 05/10/2017 | 4.5 |
| 05/10/2017 | 4.5 |
| 05/10/2017 | 4.4 |
| 05/10/2017 | 4.3 |
| 05/10/2017 | 4.3 |
| 05/10/2017 | 4.4 |
| 05/10/2017 | 4.6 |
| 05/10/2017 | 4.7 |
| 05/10/2017 | 4.3 |
| 05/10/2017 | 3.8 |
| 05/10/2017 | 3.3 |
| 05/10/2017 | 3 |
| 05/10/2017 | 2.7 |
| 06/10/2017 | 2.5 |
| 06/10/2017 | 2.4 |
| 06/10/2017 | 2.4 |
| 06/10/2017 | 2.5 |
| 06/10/2017 | 2.8 |
| 06/10/2017 | 3.4 |
| 06/10/2017 | 3.9 |
| 06/10/2017 | 4.2 |
| 06/10/2017 | 4.4 |
| 06/10/2017 | 4.5 |
| 06/10/2017 | 4.5 |
| 06/10/2017 | 4.5 |
| 06/10/2017 | 4.4 |
| 06/10/2017 | 4.3 |
| 06/10/2017 | 4.2 |
| 06/10/2017 | 4.2 |
| 06/10/2017 | 4.3 |
| 06/10/2017 | 4.5 |
| 06/10/2017 | 4.6 |
| 06/10/2017 | 4.2 |
| 06/10/2017 | 3.6 |
| 06/10/2017 | 3.2 |
| 06/10/2017 | 2.9 |
| 06/10/2017 | 2.7 |
| 07/10/2017 | 2.5 |
| 07/10/2017 | 2.4 |
| 07/10/2017 | 2.4 |
| 07/10/2017 | 2.4 |
| 07/10/2017 | 2.5 |
| 07/10/2017 | 2.6 |
| 07/10/2017 | 2.8 |
| 07/10/2017 | 3.2 |
| 07/10/2017 | 3.5 |
| 07/10/2017 | 3.7 |
| 07/10/2017 | 3.8 |
| 07/10/2017 | 3.8 |
| 07/10/2017 | 3.6 |
| 07/10/2017 | 3.5 |
| 07/10/2017 | 3.5 |
| 07/10/2017 | 3.5 |
| 07/10/2017 | 3.6 |
| 07/10/2017 | 3.8 |
| 07/10/2017 | 4 |
| 07/10/2017 | 3.7 |
| 07/10/2017 | 3.3 |
| 07/10/2017 | 3 |
| 07/10/2017 | 2.8 |
| 07/10/2017 | 2.6 |
| 08/10/2017 | 2.4 |
| 08/10/2017 | 2.3 |
| 08/10/2017 | 2.3 |
| 08/10/2017 | 2.3 |
| 08/10/2017 | 2.3 |
| 08/10/2017 | 2.4 |
| 08/10/2017 | 2.6 |
| 08/10/2017 | 2.8 |
| 08/10/2017 | 3 |
| 08/10/2017 | 3.2 |
| 08/10/2017 | 3.3 |
| 08/10/2017 | 3.4 |
| 08/10/2017 | 3.3 |
| 08/10/2017 | 3.2 |
| 08/10/2017 | 3.2 |
| 08/10/2017 | 3.2 |
| 08/10/2017 | 3.3 |
| 08/10/2017 | 3.6 |
| 08/10/2017 | 3.8 |
| 08/10/2017 | 3.6 |
| 08/10/2017 | 3.3 |
| 08/10/2017 | 3 |
| 08/10/2017 | 2.8 |
| 08/10/2017 | 2.6 |
| 09/10/2017 | 2.4 |
| 09/10/2017 | 2.3 |
| 09/10/2017 | 2.3 |
| 09/10/2017 | 2.5 |
| 09/10/2017 | 2.7 |
| 09/10/2017 | 3.4 |
| 09/10/2017 | 3.9 |
| 09/10/2017 | 4.2 |
| 09/10/2017 | 4.4 |
| 09/10/2017 | 4.5 |
| 09/10/2017 | 4.5 |
| 09/10/2017 | 4.5 |
| 09/10/2017 | 4.5 |
| 09/10/2017 | 4.4 |
| 09/10/2017 | 4.3 |
| 09/10/2017 | 4.3 |
| 09/10/2017 | 4.4 |
| 09/10/2017 | 4.7 |
| 09/10/2017 | 4.8 |
| 09/10/2017 | 4.3 |
| 09/10/2017 | 3.8 |
| 09/10/2017 | 3.3 |
| 09/10/2017 | 2.9 |
| 09/10/2017 | 2.7 |
| 10/10/2017 | 2.5 |
| 10/10/2017 | 2.4 |
| 10/10/2017 | 2.4 |
| 10/10/2017 | 2.5 |
| 10/10/2017 | 2.8 |
| 10/10/2017 | 3.4 |
| 10/10/2017 | 3.9 |
| 10/10/2017 | 4.3 |
| 10/10/2017 | 4.4 |
| 10/10/2017 | 4.5 |
| 10/10/2017 | 4.5 |
| 10/10/2017 | 4.6 |
| 10/10/2017 | 4.5 |
| 10/10/2017 | 4.4 |
| 10/10/2017 | 4.3 |
| 10/10/2017 | 4.4 |
| 10/10/2017 | 4.5 |
| 10/10/2017 | 4.8 |
| 10/10/2017 | 4.8 |
| 10/10/2017 | 4.4 |
| 10/10/2017 | 3.8 |
| 10/10/2017 | 3.3 |
| 10/10/2017 | 3 |
| 10/10/2017 | 2.7 |
| 11/10/2017 | 2.5 |
| 11/10/2017 | 2.4 |
| 11/10/2017 | 2.4 |
| 11/10/2017 | 2.5 |
| 11/10/2017 | 2.8 |
| 11/10/2017 | 3.4 |
| 11/10/2017 | 4 |
| 11/10/2017 | 4.3 |
| 11/10/2017 | 4.5 |
| 11/10/2017 | 4.6 |
| 11/10/2017 | 4.6 |
| 11/10/2017 | 4.6 |
| 11/10/2017 | 4.5 |
| 11/10/2017 | 4.4 |
| 11/10/2017 | 4.4 |
| 11/10/2017 | 4.4 |
| 11/10/2017 | 4.5 |
| 11/10/2017 | 4.8 |
| 11/10/2017 | 4.8 |
| 11/10/2017 | 4.4 |
| 11/10/2017 | 3.8 |
| 11/10/2017 | 3.3 |
| 11/10/2017 | 3 |
| 11/10/2017 | 2.7 |
| 12/10/2017 | 2.5 |
| 12/10/2017 | 2.4 |
| 12/10/2017 | 2.4 |
| 12/10/2017 | 2.5 |
| 12/10/2017 | 2.8 |
| 12/10/2017 | 3.4 |
| 12/10/2017 | 4 |
| 12/10/2017 | 4.3 |
| 12/10/2017 | 4.4 |
| 12/10/2017 | 4.5 |
| 12/10/2017 | 4.6 |
| 12/10/2017 | 4.6 |
| 12/10/2017 | 4.5 |
| 12/10/2017 | 4.4 |
| 12/10/2017 | 4.3 |
| 12/10/2017 | 4.3 |
| 12/10/2017 | 4.5 |
| 12/10/2017 | 4.7 |
| 12/10/2017 | 4.8 |
| 12/10/2017 | 4.3 |
| 12/10/2017 | 3.8 |
| 12/10/2017 | 3.3 |
| 12/10/2017 | 3 |
| 12/10/2017 | 2.7 |
| 13/10/2017 | 2.5 |
| 13/10/2017 | 2.4 |
| 13/10/2017 | 2.4 |
| 13/10/2017 | 2.5 |
| 13/10/2017 | 2.8 |
| 13/10/2017 | 3.4 |
| 13/10/2017 | 3.9 |
| 13/10/2017 | 4.3 |
| 13/10/2017 | 4.4 |
| 13/10/2017 | 4.6 |
| 13/10/2017 | 4.6 |
| 13/10/2017 | 4.6 |
| 13/10/2017 | 4.4 |
| 13/10/2017 | 4.3 |
| 13/10/2017 | 4.2 |
| 13/10/2017 | 4.2 |
| 13/10/2017 | 4.4 |
| 13/10/2017 | 4.6 |
| 13/10/2017 | 4.6 |
| 13/10/2017 | 4.2 |
| 13/10/2017 | 3.6 |
| 13/10/2017 | 3.2 |
| 13/10/2017 | 2.9 |
| 13/10/2017 | 2.7 |
| 14/10/2017 | 2.5 |
| 14/10/2017 | 2.4 |
| 14/10/2017 | 2.4 |
| 14/10/2017 | 2.4 |
| 14/10/2017 | 2.5 |
| 14/10/2017 | 2.7 |
| 14/10/2017 | 2.9 |
| 14/10/2017 | 3.2 |
| 14/10/2017 | 3.5 |
| 14/10/2017 | 3.7 |
| 14/10/2017 | 3.8 |
| 14/10/2017 | 3.8 |
| 14/10/2017 | 3.7 |
| 14/10/2017 | 3.5 |
| 14/10/2017 | 3.5 |
| 14/10/2017 | 3.5 |
| 14/10/2017 | 3.6 |
| 14/10/2017 | 4 |
| 14/10/2017 | 4.1 |
| 14/10/2017 | 3.7 |
| 14/10/2017 | 3.3 |
| 14/10/2017 | 3 |
| 14/10/2017 | 2.8 |
| 14/10/2017 | 2.6 |
| 15/10/2017 | 2.4 |
| 15/10/2017 | 2.4 |
| 15/10/2017 | 2.3 |
| 15/10/2017 | 2.3 |
| 15/10/2017 | 2.3 |
| 15/10/2017 | 2.4 |
| 15/10/2017 | 2.6 |
| 15/10/2017 | 2.8 |
| 15/10/2017 | 3 |
| 15/10/2017 | 3.2 |
| 15/10/2017 | 3.4 |
| 15/10/2017 | 3.4 |
| 15/10/2017 | 3.3 |
| 15/10/2017 | 3.2 |
| 15/10/2017 | 3.2 |
| 15/10/2017 | 3.2 |
| 15/10/2017 | 3.4 |
| 15/10/2017 | 3.7 |
| 15/10/2017 | 3.8 |
| 15/10/2017 | 3.6 |
| 15/10/2017 | 3.3 |
| 15/10/2017 | 3.1 |
| 15/10/2017 | 2.8 |
| 15/10/2017 | 2.6 |
| 16/10/2017 | 2.4 |
| 16/10/2017 | 2.3 |
| 16/10/2017 | 2.3 |
| 16/10/2017 | 2.4 |
| 16/10/2017 | 2.7 |
| 16/10/2017 | 3.2 |
| 16/10/2017 | 3.7 |
| 16/10/2017 | 4.1 |
| 16/10/2017 | 4.3 |
| 16/10/2017 | 4.4 |
| 16/10/2017 | 4.5 |
| 16/10/2017 | 4.5 |
| 16/10/2017 | 4.4 |
| 16/10/2017 | 4.3 |
| 16/10/2017 | 4.2 |
| 16/10/2017 | 4.2 |
| 16/10/2017 | 4.4 |
| 16/10/2017 | 4.7 |
| 16/10/2017 | 4.7 |
| 16/10/2017 | 4.2 |
| 16/10/2017 | 3.7 |
| 16/10/2017 | 3.3 |
| 16/10/2017 | 2.9 |
| 16/10/2017 | 2.7 |
| 17/10/2017 | 2.5 |
| 17/10/2017 | 2.4 |
| 17/10/2017 | 2.4 |
| 17/10/2017 | 2.5 |
| 17/10/2017 | 2.8 |
| 17/10/2017 | 3.3 |
| 17/10/2017 | 3.8 |
| 17/10/2017 | 4.1 |
| 17/10/2017 | 4.3 |
| 17/10/2017 | 4.5 |
| 17/10/2017 | 4.5 |
| 17/10/2017 | 4.5 |
| 17/10/2017 | 4.4 |
| 17/10/2017 | 4.3 |
| 17/10/2017 | 4.2 |
| 17/10/2017 | 4.3 |
| 17/10/2017 | 4.5 |
| 17/10/2017 | 4.8 |
| 17/10/2017 | 4.8 |
| 17/10/2017 | 4.3 |
| 17/10/2017 | 3.7 |
| 17/10/2017 | 3.3 |
| 17/10/2017 | 3 |
| 17/10/2017 | 2.7 |
| 18/10/2017 | 2.5 |
| 18/10/2017 | 2.4 |
| 18/10/2017 | 2.4 |
| 18/10/2017 | 2.5 |
| 18/10/2017 | 2.8 |
| 18/10/2017 | 3.3 |
| 18/10/2017 | 3.8 |
| 18/10/2017 | 4.2 |
| 18/10/2017 | 4.4 |
| 18/10/2017 | 4.5 |
| 18/10/2017 | 4.5 |
| 18/10/2017 | 4.5 |
| 18/10/2017 | 4.4 |
| 18/10/2017 | 4.3 |
| 18/10/2017 | 4.3 |
| 18/10/2017 | 4.3 |
| 18/10/2017 | 4.5 |
| 18/10/2017 | 4.8 |
| 18/10/2017 | 4.8 |
| 18/10/2017 | 4.3 |
| 18/10/2017 | 3.7 |
| 18/10/2017 | 3.3 |
| 18/10/2017 | 3 |
| 18/10/2017 | 2.7 |
| 19/10/2017 | 2.5 |
| 19/10/2017 | 2.4 |
| 19/10/2017 | 2.4 |
| 19/10/2017 | 2.5 |
| 19/10/2017 | 2.8 |
| 19/10/2017 | 3.3 |
| 19/10/2017 | 3.8 |
| 19/10/2017 | 4.2 |
| 19/10/2017 | 4.4 |
| 19/10/2017 | 4.5 |
| 19/10/2017 | 4.5 |
| 19/10/2017 | 4.5 |
| 19/10/2017 | 4.4 |
| 19/10/2017 | 4.3 |
| 19/10/2017 | 4.2 |
| 19/10/2017 | 4.2 |
| 19/10/2017 | 4.4 |
| 19/10/2017 | 4.8 |
| 19/10/2017 | 4.8 |
| 19/10/2017 | 4.2 |
| 19/10/2017 | 3.7 |
| 19/10/2017 | 3.3 |
| 19/10/2017 | 3 |
| 19/10/2017 | 2.7 |
| 20/10/2017 | 2.5 |
| 20/10/2017 | 2.4 |
| 20/10/2017 | 2.4 |
| 20/10/2017 | 2.5 |
| 20/10/2017 | 2.8 |
| 20/10/2017 | 3.3 |
| 20/10/2017 | 3.8 |
| 20/10/2017 | 4.2 |
| 20/10/2017 | 4.4 |
| 20/10/2017 | 4.5 |
| 20/10/2017 | 4.5 |
| 20/10/2017 | 4.5 |
| 20/10/2017 | 4.4 |
| 20/10/2017 | 4.2 |
| 20/10/2017 | 4.1 |
| 20/10/2017 | 4.1 |
| 20/10/2017 | 4.3 |
| 20/10/2017 | 4.6 |
| 20/10/2017 | 4.6 |
| 20/10/2017 | 4.1 |
| 20/10/2017 | 3.6 |
| 20/10/2017 | 3.2 |
| 20/10/2017 | 2.9 |
| 20/10/2017 | 2.7 |
| 21/10/2017 | 2.5 |
| 21/10/2017 | 2.4 |
| 21/10/2017 | 2.4 |
| 21/10/2017 | 2.4 |
| 21/10/2017 | 2.4 |
| 21/10/2017 | 2.6 |
| 21/10/2017 | 2.8 |
| 21/10/2017 | 3.1 |
| 21/10/2017 | 3.4 |
| 21/10/2017 | 3.7 |
| 21/10/2017 | 3.8 |
| 21/10/2017 | 3.7 |
| 21/10/2017 | 3.6 |
| 21/10/2017 | 3.5 |
| 21/10/2017 | 3.4 |
| 21/10/2017 | 3.4 |
| 21/10/2017 | 3.6 |
| 21/10/2017 | 4 |
| 21/10/2017 | 4 |
| 21/10/2017 | 3.6 |
| 21/10/2017 | 3.3 |
| 21/10/2017 | 3 |
| 21/10/2017 | 2.8 |
| 21/10/2017 | 2.6 |
| 22/10/2017 | 2.4 |
| 22/10/2017 | 2.4 |
| 22/10/2017 | 2.3 |
| 22/10/2017 | 2.3 |
| 22/10/2017 | 2.3 |
| 22/10/2017 | 2.4 |
| 22/10/2017 | 2.5 |
| 22/10/2017 | 2.7 |
| 22/10/2017 | 3 |
| 22/10/2017 | 3.2 |
| 22/10/2017 | 3.3 |
| 22/10/2017 | 3.4 |
| 22/10/2017 | 3.3 |
| 22/10/2017 | 3.2 |
| 22/10/2017 | 3.1 |
| 22/10/2017 | 3.2 |
| 22/10/2017 | 3.4 |
| 22/10/2017 | 3.7 |
| 22/10/2017 | 3.8 |
| 22/10/2017 | 3.5 |
| 22/10/2017 | 3.2 |
| 22/10/2017 | 3.1 |
| 22/10/2017 | 2.8 |
| 22/10/2017 | 2.6 |
| 23/10/2017 | 2.4 |
| 23/10/2017 | 2.4 |
| 23/10/2017 | 2.4 |
| 23/10/2017 | 2.5 |
| 23/10/2017 | 2.7 |
| 23/10/2017 | 3.3 |
| 23/10/2017 | 3.8 |
| 23/10/2017 | 4.1 |
| 23/10/2017 | 4.3 |
| 23/10/2017 | 4.5 |
| 23/10/2017 | 4.5 |
| 23/10/2017 | 4.5 |
| 23/10/2017 | 4.4 |
| 23/10/2017 | 4.3 |
| 23/10/2017 | 4.3 |
| 23/10/2017 | 4.3 |
| 23/10/2017 | 4.5 |
| 23/10/2017 | 4.8 |
| 23/10/2017 | 4.8 |
| 23/10/2017 | 4.3 |
| 23/10/2017 | 3.7 |
| 23/10/2017 | 3.3 |
| 23/10/2017 | 3 |
| 23/10/2017 | 2.7 |
| 24/10/2017 | 2.5 |
| 24/10/2017 | 2.5 |
| 24/10/2017 | 2.4 |
| 24/10/2017 | 2.5 |
| 24/10/2017 | 2.8 |
| 24/10/2017 | 3.3 |
| 24/10/2017 | 3.9 |
| 24/10/2017 | 4.2 |
| 24/10/2017 | 4.4 |
| 24/10/2017 | 4.6 |
| 24/10/2017 | 4.6 |
| 24/10/2017 | 4.6 |
| 24/10/2017 | 4.5 |
| 24/10/2017 | 4.4 |
| 24/10/2017 | 4.3 |
| 24/10/2017 | 4.4 |
| 24/10/2017 | 4.6 |
| 24/10/2017 | 4.9 |
| 24/10/2017 | 4.9 |
| 24/10/2017 | 4.3 |
| 24/10/2017 | 3.8 |
| 24/10/2017 | 3.4 |
| 24/10/2017 | 3 |
| 24/10/2017 | 2.7 |
| 25/10/2017 | 2.6 |
| 25/10/2017 | 2.5 |
| 25/10/2017 | 2.5 |
| 25/10/2017 | 2.6 |
| 25/10/2017 | 2.8 |
| 25/10/2017 | 3.4 |
| 25/10/2017 | 3.9 |
| 25/10/2017 | 4.3 |
| 25/10/2017 | 4.5 |
| 25/10/2017 | 4.6 |
| 25/10/2017 | 4.6 |
| 25/10/2017 | 4.6 |
| 25/10/2017 | 4.5 |
| 25/10/2017 | 4.4 |
| 25/10/2017 | 4.4 |
| 25/10/2017 | 4.4 |
| 25/10/2017 | 4.6 |
| 25/10/2017 | 4.9 |
| 25/10/2017 | 4.9 |
| 25/10/2017 | 4.3 |
| 25/10/2017 | 3.8 |
| 25/10/2017 | 3.4 |
| 25/10/2017 | 3 |
| 25/10/2017 | 2.8 |
| 26/10/2017 | 2.6 |
| 26/10/2017 | 2.5 |
| 26/10/2017 | 2.5 |
| 26/10/2017 | 2.6 |
| 26/10/2017 | 2.8 |
| 26/10/2017 | 3.4 |
| 26/10/2017 | 3.9 |
| 26/10/2017 | 4.2 |
| 26/10/2017 | 4.4 |
| 26/10/2017 | 4.6 |
| 26/10/2017 | 4.6 |
| 26/10/2017 | 4.6 |
| 26/10/2017 | 4.5 |
| 26/10/2017 | 4.4 |
| 26/10/2017 | 4.4 |
| 26/10/2017 | 4.4 |
| 26/10/2017 | 4.5 |
| 26/10/2017 | 4.8 |
| 26/10/2017 | 4.8 |
| 26/10/2017 | 4.3 |
| 26/10/2017 | 3.8 |
| 26/10/2017 | 3.4 |
| 26/10/2017 | 3 |
| 26/10/2017 | 2.8 |
| 27/10/2017 | 2.6 |
| 27/10/2017 | 2.5 |
| 27/10/2017 | 2.5 |
| 27/10/2017 | 2.6 |
| 27/10/2017 | 2.8 |
| 27/10/2017 | 3.3 |
| 27/10/2017 | 3.9 |
| 27/10/2017 | 4.2 |
| 27/10/2017 | 4.5 |
| 27/10/2017 | 4.6 |
| 27/10/2017 | 4.6 |
| 27/10/2017 | 4.6 |
| 27/10/2017 | 4.5 |
| 27/10/2017 | 4.3 |
| 27/10/2017 | 4.3 |
| 27/10/2017 | 4.3 |
| 27/10/2017 | 4.4 |
| 27/10/2017 | 4.7 |
| 27/10/2017 | 4.7 |
| 27/10/2017 | 4.2 |
| 27/10/2017 | 3.6 |
| 27/10/2017 | 3.3 |
| 27/10/2017 | 3 |
| 27/10/2017 | 2.7 |
| 28/10/2017 | 2.6 |
| 28/10/2017 | 2.5 |
| 28/10/2017 | 2.4 |
| 28/10/2017 | 2.4 |
| 28/10/2017 | 2.5 |
| 28/10/2017 | 2.7 |
| 28/10/2017 | 3 |
| 28/10/2017 | 3.3 |
| 28/10/2017 | 3.6 |
| 28/10/2017 | 3.9 |
| 28/10/2017 | 3.9 |
| 28/10/2017 | 3.9 |
| 28/10/2017 | 3.8 |
| 28/10/2017 | 3.7 |
| 28/10/2017 | 3.6 |
| 28/10/2017 | 3.7 |
| 28/10/2017 | 3.8 |
| 28/10/2017 | 4.1 |
| 28/10/2017 | 4.2 |
| 28/10/2017 | 3.8 |
| 28/10/2017 | 3.4 |
| 28/10/2017 | 3.1 |
| 28/10/2017 | 2.9 |
| 28/10/2017 | 2.6 |
| 29/10/2017 | 2.5 |
| 29/10/2017 | 2.4 |
| 29/10/2017 | 2.4 |
| 29/10/2017 | 2.3 |
| 29/10/2017 | 2.4 |
| 29/10/2017 | 2.4 |
| 29/10/2017 | 2.5 |
| 29/10/2017 | 2.6 |
| 29/10/2017 | 2.8 |
| 29/10/2017 | 3.1 |
| 29/10/2017 | 3.2 |
| 29/10/2017 | 3.4 |
| 29/10/2017 | 3.4 |
| 29/10/2017 | 3.4 |
| 29/10/2017 | 3.3 |
| 29/10/2017 | 3.3 |
| 29/10/2017 | 3.5 |
| 29/10/2017 | 3.8 |
| 29/10/2017 | 4 |
| 29/10/2017 | 3.9 |
| 29/10/2017 | 3.6 |
| 29/10/2017 | 3.3 |
| 29/10/2017 | 3.1 |
| 29/10/2017 | 2.8 |
| 29/10/2017 | 2.6 |
| 30/10/2017 | 2.5 |
| 30/10/2017 | 2.4 |
| 30/10/2017 | 2.4 |
| 30/10/2017 | 2.5 |
| 30/10/2017 | 2.8 |
| 30/10/2017 | 3.4 |
| 30/10/2017 | 4 |
| 30/10/2017 | 4.3 |
| 30/10/2017 | 4.5 |
| 30/10/2017 | 4.6 |
| 30/10/2017 | 4.6 |
| 30/10/2017 | 4.6 |
| 30/10/2017 | 4.5 |
| 30/10/2017 | 4.5 |
| 30/10/2017 | 4.5 |
| 30/10/2017 | 4.7 |
| 30/10/2017 | 5.1 |
| 30/10/2017 | 5.2 |
| 30/10/2017 | 5 |
| 30/10/2017 | 4.3 |
| 30/10/2017 | 3.8 |
| 30/10/2017 | 3.4 |
| 30/10/2017 | 3 |
| 30/10/2017 | 2.7 |
| 31/10/2017 | 2.6 |
| 31/10/2017 | 2.5 |
| 31/10/2017 | 2.5 |
| 31/10/2017 | 2.6 |
| 31/10/2017 | 2.9 |
| 31/10/2017 | 3.5 |
| 31/10/2017 | 4.1 |
| 31/10/2017 | 4.4 |
| 31/10/2017 | 4.5 |
| 31/10/2017 | 4.6 |
| 31/10/2017 | 4.6 |
| 31/10/2017 | 4.6 |
| 31/10/2017 | 4.6 |
| 31/10/2017 | 4.5 |
| 31/10/2017 | 4.5 |
| 31/10/2017 | 4.8 |
| 31/10/2017 | 5.2 |
| 31/10/2017 | 5.3 |
| 31/10/2017 | 5 |
| 31/10/2017 | 4.4 |
| 31/10/2017 | 3.9 |
| 31/10/2017 | 3.4 |
| 31/10/2017 | 3 |
| 31/10/2017 | 2.8 |
| 01/11/2017 | 2.6 |
| 01/11/2017 | 2.5 |
| 01/11/2017 | 2.5 |
| 01/11/2017 | 2.6 |
| 01/11/2017 | 2.9 |
| 01/11/2017 | 3.5 |
| 01/11/2017 | 4.1 |
| 01/11/2017 | 4.4 |
| 01/11/2017 | 4.6 |
| 01/11/2017 | 4.7 |
| 01/11/2017 | 4.7 |
| 01/11/2017 | 4.7 |
| 01/11/2017 | 4.7 |
| 01/11/2017 | 4.6 |
| 01/11/2017 | 4.6 |
| 01/11/2017 | 4.8 |
| 01/11/2017 | 5.2 |
| 01/11/2017 | 5.3 |
| 01/11/2017 | 5 |
| 01/11/2017 | 4.4 |
| 01/11/2017 | 3.9 |
| 01/11/2017 | 3.4 |
| 01/11/2017 | 3 |
| 01/11/2017 | 2.8 |
| 02/11/2017 | 2.6 |
| 02/11/2017 | 2.5 |
| 02/11/2017 | 2.5 |
| 02/11/2017 | 2.6 |
| 02/11/2017 | 2.9 |
| 02/11/2017 | 3.5 |
| 02/11/2017 | 4.1 |
| 02/11/2017 | 4.4 |
| 02/11/2017 | 4.6 |
| 02/11/2017 | 4.7 |
| 02/11/2017 | 4.7 |
| 02/11/2017 | 4.7 |
| 02/11/2017 | 4.6 |
| 02/11/2017 | 4.6 |
| 02/11/2017 | 4.6 |
| 02/11/2017 | 4.8 |
| 02/11/2017 | 5.1 |
| 02/11/2017 | 5.2 |
| 02/11/2017 | 5 |
| 02/11/2017 | 4.4 |
| 02/11/2017 | 3.9 |
| 02/11/2017 | 3.4 |
| 02/11/2017 | 3 |
| 02/11/2017 | 2.8 |
| 03/11/2017 | 2.6 |
| 03/11/2017 | 2.5 |
| 03/11/2017 | 2.5 |
| 03/11/2017 | 2.6 |
| 03/11/2017 | 2.9 |
| 03/11/2017 | 3.5 |
| 03/11/2017 | 4.1 |
| 03/11/2017 | 4.4 |
| 03/11/2017 | 4.6 |
| 03/11/2017 | 4.7 |
| 03/11/2017 | 4.7 |
| 03/11/2017 | 4.7 |
| 03/11/2017 | 4.6 |
| 03/11/2017 | 4.5 |
| 03/11/2017 | 4.5 |
| 03/11/2017 | 4.7 |
| 03/11/2017 | 5 |
| 03/11/2017 | 5.1 |
| 03/11/2017 | 4.8 |
| 03/11/2017 | 4.2 |
| 03/11/2017 | 3.7 |
| 03/11/2017 | 3.3 |
| 03/11/2017 | 3 |
| 03/11/2017 | 2.8 |
| 04/11/2017 | 2.6 |
| 04/11/2017 | 2.5 |
| 04/11/2017 | 2.5 |
| 04/11/2017 | 2.5 |
| 04/11/2017 | 2.5 |
| 04/11/2017 | 2.7 |
| 04/11/2017 | 3 |
| 04/11/2017 | 3.3 |
| 04/11/2017 | 3.6 |
| 04/11/2017 | 3.8 |
| 04/11/2017 | 3.9 |
| 04/11/2017 | 3.9 |
| 04/11/2017 | 3.8 |
| 04/11/2017 | 3.7 |
| 04/11/2017 | 3.7 |
| 04/11/2017 | 3.9 |
| 04/11/2017 | 4.2 |
| 04/11/2017 | 4.4 |
| 04/11/2017 | 4.2 |
| 04/11/2017 | 3.8 |
| 04/11/2017 | 3.4 |
| 04/11/2017 | 3.1 |
| 04/11/2017 | 2.9 |
| 04/11/2017 | 2.7 |
| 05/11/2017 | 2.5 |
| 05/11/2017 | 2.4 |
| 05/11/2017 | 2.4 |
| 05/11/2017 | 2.4 |
| 05/11/2017 | 2.4 |
| 05/11/2017 | 2.5 |
| 05/11/2017 | 2.7 |
| 05/11/2017 | 2.9 |
| 05/11/2017 | 3.2 |
| 05/11/2017 | 3.3 |
| 05/11/2017 | 3.5 |
| 05/11/2017 | 3.5 |
| 05/11/2017 | 3.5 |
| 05/11/2017 | 3.4 |
| 05/11/2017 | 3.4 |
| 05/11/2017 | 3.6 |
| 05/11/2017 | 4 |
| 05/11/2017 | 4.1 |
| 05/11/2017 | 4 |
| 05/11/2017 | 3.7 |
| 05/11/2017 | 3.4 |
| 05/11/2017 | 3.2 |
| 05/11/2017 | 2.9 |
| 05/11/2017 | 2.7 |
| 06/11/2017 | 2.5 |
| 06/11/2017 | 2.4 |
| 06/11/2017 | 2.4 |
| 06/11/2017 | 2.5 |
| 06/11/2017 | 2.8 |
| 06/11/2017 | 3.5 |
| 06/11/2017 | 4.1 |
| 06/11/2017 | 4.4 |
| 06/11/2017 | 4.6 |
| 06/11/2017 | 4.7 |
| 06/11/2017 | 4.7 |
| 06/11/2017 | 4.7 |
| 06/11/2017 | 4.7 |
| 06/11/2017 | 4.6 |
| 06/11/2017 | 4.7 |
| 06/11/2017 | 4.9 |
| 06/11/2017 | 5.2 |
| 06/11/2017 | 5.3 |
| 06/11/2017 | 5.1 |
| 06/11/2017 | 4.4 |
| 06/11/2017 | 3.9 |
| 06/11/2017 | 3.5 |
| 06/11/2017 | 3.1 |
| 06/11/2017 | 2.8 |
| 07/11/2017 | 2.6 |
| 07/11/2017 | 2.5 |
| 07/11/2017 | 2.5 |
| 07/11/2017 | 2.6 |
| 07/11/2017 | 2.9 |
| 07/11/2017 | 3.5 |
| 07/11/2017 | 4.1 |
| 07/11/2017 | 4.5 |
| 07/11/2017 | 4.6 |
| 07/11/2017 | 4.7 |
| 07/11/2017 | 4.8 |
| 07/11/2017 | 4.8 |
| 07/11/2017 | 4.7 |
| 07/11/2017 | 4.7 |
| 07/11/2017 | 4.7 |
| 07/11/2017 | 5 |
| 07/11/2017 | 5.3 |
| 07/11/2017 | 5.3 |
| 07/11/2017 | 5.1 |
| 07/11/2017 | 4.5 |
| 07/11/2017 | 3.9 |
| 07/11/2017 | 3.5 |
| 07/11/2017 | 3.1 |
| 07/11/2017 | 2.8 |
| 08/11/2017 | 2.6 |
| 08/11/2017 | 2.5 |
| 08/11/2017 | 2.5 |
| 08/11/2017 | 2.6 |
| 08/11/2017 | 2.9 |
| 08/11/2017 | 3.6 |
| 08/11/2017 | 4.2 |
| 08/11/2017 | 4.5 |
| 08/11/2017 | 4.7 |
| 08/11/2017 | 4.8 |
| 08/11/2017 | 4.8 |
| 08/11/2017 | 4.8 |
| 08/11/2017 | 4.8 |
| 08/11/2017 | 4.7 |
| 08/11/2017 | 4.8 |
| 08/11/2017 | 5 |
| 08/11/2017 | 5.3 |
| 08/11/2017 | 5.4 |
| 08/11/2017 | 5.1 |
| 08/11/2017 | 4.5 |
| 08/11/2017 | 4 |
| 08/11/2017 | 3.5 |
| 08/11/2017 | 3.1 |
| 08/11/2017 | 2.8 |
| 09/11/2017 | 2.6 |
| 09/11/2017 | 2.5 |
| 09/11/2017 | 2.5 |
| 09/11/2017 | 2.6 |
| 09/11/2017 | 2.9 |
| 09/11/2017 | 3.6 |
| 09/11/2017 | 4.2 |
| 09/11/2017 | 4.5 |
| 09/11/2017 | 4.7 |
| 09/11/2017 | 4.8 |
| 09/11/2017 | 4.8 |
| 09/11/2017 | 4.8 |
| 09/11/2017 | 4.8 |
| 09/11/2017 | 4.7 |
| 09/11/2017 | 4.7 |
| 09/11/2017 | 5 |
| 09/11/2017 | 5.3 |
| 09/11/2017 | 5.3 |
| 09/11/2017 | 5.1 |
| 09/11/2017 | 4.5 |
| 09/11/2017 | 4 |
| 09/11/2017 | 3.5 |
| 09/11/2017 | 3.1 |
| 09/11/2017 | 2.8 |
| 10/11/2017 | 2.6 |
| 10/11/2017 | 2.5 |
| 10/11/2017 | 2.5 |
| 10/11/2017 | 2.6 |
| 10/11/2017 | 2.9 |
| 10/11/2017 | 3.5 |
| 10/11/2017 | 4.1 |
| 10/11/2017 | 4.5 |
| 10/11/2017 | 4.7 |
| 10/11/2017 | 4.8 |
| 10/11/2017 | 4.8 |
| 10/11/2017 | 4.8 |
| 10/11/2017 | 4.7 |
| 10/11/2017 | 4.6 |
| 10/11/2017 | 4.7 |
| 10/11/2017 | 4.9 |
| 10/11/2017 | 5.2 |
| 10/11/2017 | 5.2 |
| 10/11/2017 | 4.9 |
| 10/11/2017 | 4.3 |
| 10/11/2017 | 3.8 |
| 10/11/2017 | 3.4 |
| 10/11/2017 | 3.1 |
| 10/11/2017 | 2.8 |
| 11/11/2017 | 2.6 |
| 11/11/2017 | 2.5 |
| 11/11/2017 | 2.5 |
| 11/11/2017 | 2.5 |
| 11/11/2017 | 2.6 |
| 11/11/2017 | 2.8 |
| 11/11/2017 | 3 |
| 11/11/2017 | 3.4 |
| 11/11/2017 | 3.7 |
| 11/11/2017 | 3.9 |
| 11/11/2017 | 4 |
| 11/11/2017 | 4 |
| 11/11/2017 | 3.9 |
| 11/11/2017 | 3.8 |
| 11/11/2017 | 3.9 |
| 11/11/2017 | 4.1 |
| 11/11/2017 | 4.4 |
| 11/11/2017 | 4.4 |
| 11/11/2017 | 4.3 |
| 11/11/2017 | 3.9 |
| 11/11/2017 | 3.5 |
| 11/11/2017 | 3.2 |
| 11/11/2017 | 2.9 |
| 11/11/2017 | 2.7 |
| 12/11/2017 | 2.6 |
| 12/11/2017 | 2.5 |
| 12/11/2017 | 2.4 |
| 12/11/2017 | 2.4 |
| 12/11/2017 | 2.4 |
| 12/11/2017 | 2.5 |
| 12/11/2017 | 2.7 |
| 12/11/2017 | 3 |
| 12/11/2017 | 3.2 |
| 12/11/2017 | 3.4 |
| 12/11/2017 | 3.6 |
| 12/11/2017 | 3.6 |
| 12/11/2017 | 3.6 |
| 12/11/2017 | 3.5 |
| 12/11/2017 | 3.5 |
| 12/11/2017 | 3.8 |
| 12/11/2017 | 4.1 |
| 12/11/2017 | 4.2 |
| 12/11/2017 | 4.1 |
| 12/11/2017 | 3.8 |
| 12/11/2017 | 3.5 |
| 12/11/2017 | 3.3 |
| 12/11/2017 | 3 |
| 12/11/2017 | 2.7 |
| 13/11/2017 | 2.6 |
| 13/11/2017 | 2.5 |
| 13/11/2017 | 2.5 |
| 13/11/2017 | 2.6 |
| 13/11/2017 | 2.9 |
| 13/11/2017 | 3.5 |
| 13/11/2017 | 4.1 |
| 13/11/2017 | 4.5 |
| 13/11/2017 | 4.7 |
| 13/11/2017 | 4.8 |
| 13/11/2017 | 4.8 |
| 13/11/2017 | 4.8 |
| 13/11/2017 | 4.8 |
| 13/11/2017 | 4.8 |
| 13/11/2017 | 4.8 |
| 13/11/2017 | 5.1 |
| 13/11/2017 | 5.4 |
| 13/11/2017 | 5.4 |
| 13/11/2017 | 5.1 |
| 13/11/2017 | 4.5 |
| 13/11/2017 | 4 |
| 13/11/2017 | 3.5 |
| 13/11/2017 | 3.1 |
| 13/11/2017 | 2.9 |
| 14/11/2017 | 2.7 |
| 14/11/2017 | 2.6 |
| 14/11/2017 | 2.5 |
| 14/11/2017 | 2.7 |
| 14/11/2017 | 2.9 |
| 14/11/2017 | 3.6 |
| 14/11/2017 | 4.2 |
| 14/11/2017 | 4.6 |
| 14/11/2017 | 4.7 |
| 14/11/2017 | 4.8 |
| 14/11/2017 | 4.9 |
| 14/11/2017 | 4.9 |
| 14/11/2017 | 4.8 |
| 14/11/2017 | 4.8 |
| 14/11/2017 | 4.9 |
| 14/11/2017 | 5.2 |
| 14/11/2017 | 5.5 |
| 14/11/2017 | 5.4 |
| 14/11/2017 | 5.2 |
| 14/11/2017 | 4.6 |
| 14/11/2017 | 4 |
| 14/11/2017 | 3.6 |
| 14/11/2017 | 3.2 |
| 14/11/2017 | 2.9 |
| 15/11/2017 | 2.7 |
| 15/11/2017 | 2.6 |
| 15/11/2017 | 2.6 |
| 15/11/2017 | 2.7 |
| 15/11/2017 | 3 |
| 15/11/2017 | 3.6 |
| 15/11/2017 | 4.3 |
| 15/11/2017 | 4.6 |
| 15/11/2017 | 4.8 |
| 15/11/2017 | 4.9 |
| 15/11/2017 | 5 |
| 15/11/2017 | 5 |
| 15/11/2017 | 4.9 |
| 15/11/2017 | 4.9 |
| 15/11/2017 | 4.9 |
| 15/11/2017 | 5.2 |
| 15/11/2017 | 5.5 |
| 15/11/2017 | 5.4 |
| 15/11/2017 | 5.2 |
| 15/11/2017 | 4.6 |
| 15/11/2017 | 4 |
| 15/11/2017 | 3.6 |
| 15/11/2017 | 3.2 |
| 15/11/2017 | 2.9 |
| 16/11/2017 | 2.7 |
| 16/11/2017 | 2.6 |
| 16/11/2017 | 2.6 |
| 16/11/2017 | 2.7 |
| 16/11/2017 | 3 |
| 16/11/2017 | 3.6 |
| 16/11/2017 | 4.3 |
| 16/11/2017 | 4.6 |
| 16/11/2017 | 4.8 |
| 16/11/2017 | 4.9 |
| 16/11/2017 | 4.9 |
| 16/11/2017 | 4.9 |
| 16/11/2017 | 4.9 |
| 16/11/2017 | 4.8 |
| 16/11/2017 | 4.9 |
| 16/11/2017 | 5.2 |
| 16/11/2017 | 5.5 |
| 16/11/2017 | 5.4 |
| 16/11/2017 | 5.2 |
| 16/11/2017 | 4.6 |
| 16/11/2017 | 4 |
| 16/11/2017 | 3.6 |
| 16/11/2017 | 3.2 |
| 16/11/2017 | 2.9 |
| 17/11/2017 | 2.7 |
| 17/11/2017 | 2.6 |
| 17/11/2017 | 2.6 |
| 17/11/2017 | 2.7 |
| 17/11/2017 | 3 |
| 17/11/2017 | 3.6 |
| 17/11/2017 | 4.2 |
| 17/11/2017 | 4.6 |
| 17/11/2017 | 4.8 |
| 17/11/2017 | 4.9 |
| 17/11/2017 | 5 |
| 17/11/2017 | 4.9 |
| 17/11/2017 | 4.8 |
| 17/11/2017 | 4.8 |
| 17/11/2017 | 4.8 |
| 17/11/2017 | 5.1 |
| 17/11/2017 | 5.3 |
| 17/11/2017 | 5.3 |
| 17/11/2017 | 5 |
| 17/11/2017 | 4.4 |
| 17/11/2017 | 3.9 |
| 17/11/2017 | 3.5 |
| 17/11/2017 | 3.2 |
| 17/11/2017 | 2.9 |
| 18/11/2017 | 2.7 |
| 18/11/2017 | 2.6 |
| 18/11/2017 | 2.5 |
| 18/11/2017 | 2.5 |
| 18/11/2017 | 2.6 |
| 18/11/2017 | 2.8 |
| 18/11/2017 | 3.1 |
| 18/11/2017 | 3.5 |
| 18/11/2017 | 3.8 |
| 18/11/2017 | 4 |
| 18/11/2017 | 4.1 |
| 18/11/2017 | 4.1 |
| 18/11/2017 | 4 |
| 18/11/2017 | 3.9 |
| 18/11/2017 | 4 |
| 18/11/2017 | 4.3 |
| 18/11/2017 | 4.5 |
| 18/11/2017 | 4.5 |
| 18/11/2017 | 4.4 |
| 18/11/2017 | 4 |
| 18/11/2017 | 3.6 |
| 18/11/2017 | 3.3 |
| 18/11/2017 | 3 |
| 18/11/2017 | 2.8 |
| 19/11/2017 | 2.6 |
| 19/11/2017 | 2.5 |
| 19/11/2017 | 2.5 |
| 19/11/2017 | 2.4 |
| 19/11/2017 | 2.5 |
| 19/11/2017 | 2.6 |
| 19/11/2017 | 2.8 |
| 19/11/2017 | 3 |
| 19/11/2017 | 3.3 |
| 19/11/2017 | 3.5 |
| 19/11/2017 | 3.7 |
| 19/11/2017 | 3.7 |
| 19/11/2017 | 3.7 |
| 19/11/2017 | 3.6 |
| 19/11/2017 | 3.7 |
| 19/11/2017 | 4 |
| 19/11/2017 | 4.2 |
| 19/11/2017 | 4.3 |
| 19/11/2017 | 4.1 |
| 19/11/2017 | 3.8 |
| 19/11/2017 | 3.5 |
| 19/11/2017 | 3.3 |
| 19/11/2017 | 3 |
| 19/11/2017 | 2.8 |
| 20/11/2017 | 2.6 |
| 20/11/2017 | 2.5 |
| 20/11/2017 | 2.5 |
| 20/11/2017 | 2.6 |
| 20/11/2017 | 2.9 |
| 20/11/2017 | 3.6 |
| 20/11/2017 | 4.2 |
| 20/11/2017 | 4.6 |
| 20/11/2017 | 4.8 |
| 20/11/2017 | 4.9 |
| 20/11/2017 | 5 |
| 20/11/2017 | 5 |
| 20/11/2017 | 4.9 |
| 20/11/2017 | 4.9 |
| 20/11/2017 | 5 |
| 20/11/2017 | 5.3 |
| 20/11/2017 | 5.5 |
| 20/11/2017 | 5.5 |
| 20/11/2017 | 5.2 |
| 20/11/2017 | 4.6 |
| 20/11/2017 | 4.1 |
| 20/11/2017 | 3.6 |
| 20/11/2017 | 3.2 |
| 20/11/2017 | 2.9 |
| 21/11/2017 | 2.7 |
| 21/11/2017 | 2.6 |
| 21/11/2017 | 2.6 |
| 21/11/2017 | 2.7 |
| 21/11/2017 | 3 |
| 21/11/2017 | 3.6 |
| 21/11/2017 | 4.3 |
| 21/11/2017 | 4.7 |
| 21/11/2017 | 4.8 |
| 21/11/2017 | 5 |
| 21/11/2017 | 5 |
| 21/11/2017 | 5 |
| 21/11/2017 | 5 |
| 21/11/2017 | 4.9 |
| 21/11/2017 | 5 |
| 21/11/2017 | 5.4 |
| 21/11/2017 | 5.6 |
| 21/11/2017 | 5.5 |
| 21/11/2017 | 5.3 |
| 21/11/2017 | 4.7 |
| 21/11/2017 | 4.1 |
| 21/11/2017 | 3.7 |
| 21/11/2017 | 3.3 |
| 21/11/2017 | 3 |
| 22/11/2017 | 2.7 |
| 22/11/2017 | 2.6 |
| 22/11/2017 | 2.6 |
| 22/11/2017 | 2.7 |
| 22/11/2017 | 3 |
| 22/11/2017 | 3.7 |
| 22/11/2017 | 4.3 |
| 22/11/2017 | 4.7 |
| 22/11/2017 | 4.9 |
| 22/11/2017 | 5 |
| 22/11/2017 | 5.1 |
| 22/11/2017 | 5.1 |
| 22/11/2017 | 5 |
| 22/11/2017 | 5 |
| 22/11/2017 | 5.1 |
| 22/11/2017 | 5.4 |
| 22/11/2017 | 5.6 |
| 22/11/2017 | 5.5 |
| 22/11/2017 | 5.3 |
| 22/11/2017 | 4.7 |
| 22/11/2017 | 4.1 |
| 22/11/2017 | 3.7 |
| 22/11/2017 | 3.3 |
| 22/11/2017 | 3 |
| 23/11/2017 | 2.7 |
| 23/11/2017 | 2.6 |
| 23/11/2017 | 2.6 |
| 23/11/2017 | 2.7 |
| 23/11/2017 | 3 |
| 23/11/2017 | 3.7 |
| 23/11/2017 | 4.3 |
| 23/11/2017 | 4.7 |
| 23/11/2017 | 4.9 |
| 23/11/2017 | 5 |
| 23/11/2017 | 5.1 |
| 23/11/2017 | 5.1 |
| 23/11/2017 | 5 |
| 23/11/2017 | 5 |
| 23/11/2017 | 5.1 |
| 23/11/2017 | 5.4 |
| 23/11/2017 | 5.6 |
| 23/11/2017 | 5.5 |
| 23/11/2017 | 5.2 |
| 23/11/2017 | 4.7 |
| 23/11/2017 | 4.1 |
| 23/11/2017 | 3.7 |
| 23/11/2017 | 3.3 |
| 23/11/2017 | 3 |
| 24/11/2017 | 2.7 |
| 24/11/2017 | 2.6 |
| 24/11/2017 | 2.6 |
| 24/11/2017 | 2.7 |
| 24/11/2017 | 3 |
| 24/11/2017 | 3.6 |
| 24/11/2017 | 4.3 |
| 24/11/2017 | 4.7 |
| 24/11/2017 | 4.9 |
| 24/11/2017 | 5 |
| 24/11/2017 | 5.1 |
| 24/11/2017 | 5.1 |
| 24/11/2017 | 5 |
| 24/11/2017 | 4.9 |
| 24/11/2017 | 5 |
| 24/11/2017 | 5.3 |
| 24/11/2017 | 5.5 |
| 24/11/2017 | 5.4 |
| 24/11/2017 | 5.1 |
| 24/11/2017 | 4.5 |
| 24/11/2017 | 4 |
| 24/11/2017 | 3.6 |
| 24/11/2017 | 3.3 |
| 24/11/2017 | 2.9 |
| 25/11/2017 | 2.7 |
| 25/11/2017 | 2.6 |
| 25/11/2017 | 2.6 |
| 25/11/2017 | 2.6 |
| 25/11/2017 | 2.6 |
| 25/11/2017 | 2.8 |
| 25/11/2017 | 3.2 |
| 25/11/2017 | 3.5 |
| 25/11/2017 | 3.9 |
| 25/11/2017 | 4.1 |
| 25/11/2017 | 4.2 |
| 25/11/2017 | 4.2 |
| 25/11/2017 | 4.1 |
| 25/11/2017 | 4.1 |
| 25/11/2017 | 4.1 |
| 25/11/2017 | 4.5 |
| 25/11/2017 | 4.7 |
| 25/11/2017 | 4.6 |
| 25/11/2017 | 4.4 |
| 25/11/2017 | 4.1 |
| 25/11/2017 | 3.7 |
| 25/11/2017 | 3.4 |
| 25/11/2017 | 3.1 |
| 25/11/2017 | 2.8 |
| 26/11/2017 | 2.6 |
| 26/11/2017 | 2.5 |
| 26/11/2017 | 2.5 |
| 26/11/2017 | 2.5 |
| 26/11/2017 | 2.5 |
| 26/11/2017 | 2.6 |
| 26/11/2017 | 2.8 |
| 26/11/2017 | 3.1 |
| 26/11/2017 | 3.4 |
| 26/11/2017 | 3.6 |
| 26/11/2017 | 3.8 |
| 26/11/2017 | 3.8 |
| 26/11/2017 | 3.8 |
| 26/11/2017 | 3.7 |
| 26/11/2017 | 3.8 |
| 26/11/2017 | 4.1 |
| 26/11/2017 | 4.3 |
| 26/11/2017 | 4.4 |
| 26/11/2017 | 4.2 |
| 26/11/2017 | 3.9 |
| 26/11/2017 | 3.6 |
| 26/11/2017 | 3.4 |
| 26/11/2017 | 3.1 |
| 26/11/2017 | 2.8 |
| 27/11/2017 | 2.6 |
| 27/11/2017 | 2.5 |
| 27/11/2017 | 2.5 |
| 27/11/2017 | 2.6 |
| 27/11/2017 | 2.9 |
| 27/11/2017 | 3.6 |
| 27/11/2017 | 4.3 |
| 27/11/2017 | 4.6 |
| 27/11/2017 | 4.8 |
| 27/11/2017 | 5 |
| 27/11/2017 | 5.1 |
| 27/11/2017 | 5.1 |
| 27/11/2017 | 5 |
| 27/11/2017 | 5 |
| 27/11/2017 | 5.1 |
| 27/11/2017 | 5.5 |
| 27/11/2017 | 5.6 |
| 27/11/2017 | 5.5 |
| 27/11/2017 | 5.3 |
| 27/11/2017 | 4.7 |
| 27/11/2017 | 4.2 |
| 27/11/2017 | 3.7 |
| 27/11/2017 | 3.3 |
| 27/11/2017 | 3 |
| 28/11/2017 | 2.7 |
| 28/11/2017 | 2.6 |
| 28/11/2017 | 2.6 |
| 28/11/2017 | 2.7 |
| 28/11/2017 | 3 |
| 28/11/2017 | 3.7 |
| 28/11/2017 | 4.3 |
| 28/11/2017 | 4.7 |
| 28/11/2017 | 4.9 |
| 28/11/2017 | 5 |
| 28/11/2017 | 5.1 |
| 28/11/2017 | 5.1 |
| 28/11/2017 | 5 |
| 28/11/2017 | 5 |
| 28/11/2017 | 5.1 |
| 28/11/2017 | 5.5 |
| 28/11/2017 | 5.7 |
| 28/11/2017 | 5.6 |
| 28/11/2017 | 5.3 |
| 28/11/2017 | 4.8 |
| 28/11/2017 | 4.2 |
| 28/11/2017 | 3.7 |
| 28/11/2017 | 3.3 |
| 28/11/2017 | 3 |
| 29/11/2017 | 2.8 |
| 29/11/2017 | 2.7 |
| 29/11/2017 | 2.6 |
| 29/11/2017 | 2.7 |
| 29/11/2017 | 3 |
| 29/11/2017 | 3.7 |
| 29/11/2017 | 4.4 |
| 29/11/2017 | 4.7 |
| 29/11/2017 | 4.9 |
| 29/11/2017 | 5.1 |
| 29/11/2017 | 5.1 |
| 29/11/2017 | 5.1 |
| 29/11/2017 | 5.1 |
| 29/11/2017 | 5.1 |
| 29/11/2017 | 5.2 |
| 29/11/2017 | 5.5 |
| 29/11/2017 | 5.7 |
| 29/11/2017 | 5.6 |
| 29/11/2017 | 5.3 |
| 29/11/2017 | 4.8 |
| 29/11/2017 | 4.2 |
| 29/11/2017 | 3.7 |
| 29/11/2017 | 3.3 |
| 29/11/2017 | 3 |
| 30/11/2017 | 2.8 |
| 30/11/2017 | 2.7 |
| 30/11/2017 | 2.6 |
| 30/11/2017 | 2.7 |
| 30/11/2017 | 3 |
| 30/11/2017 | 3.7 |
| 30/11/2017 | 4.3 |
| 30/11/2017 | 4.7 |
| 30/11/2017 | 4.9 |
| 30/11/2017 | 5 |
| 30/11/2017 | 5.1 |
| 30/11/2017 | 5.1 |
| 30/11/2017 | 5 |
| 30/11/2017 | 5 |
| 30/11/2017 | 5.1 |
| 30/11/2017 | 5.5 |
| 30/11/2017 | 5.6 |
| 30/11/2017 | 5.5 |
| 30/11/2017 | 5.3 |
| 30/11/2017 | 4.7 |
| 30/11/2017 | 4.2 |
| 30/11/2017 | 3.7 |
| 30/11/2017 | 3.3 |
| 30/11/2017 | 3 |
| 01/12/2017 | 2.8 |
| 01/12/2017 | 2.7 |
| 01/12/2017 | 2.6 |
| 01/12/2017 | 2.7 |
| 01/12/2017 | 3 |
| 01/12/2017 | 3.6 |
| 01/12/2017 | 4.3 |
| 01/12/2017 | 4.7 |
| 01/12/2017 | 4.9 |
| 01/12/2017 | 5 |
| 01/12/2017 | 5.1 |
| 01/12/2017 | 5.1 |
| 01/12/2017 | 5 |
| 01/12/2017 | 4.9 |
| 01/12/2017 | 5 |
| 01/12/2017 | 5.4 |
| 01/12/2017 | 5.5 |
| 01/12/2017 | 5.4 |
| 01/12/2017 | 5.1 |
| 01/12/2017 | 4.5 |
| 01/12/2017 | 4 |
| 01/12/2017 | 3.6 |
| 01/12/2017 | 3.3 |
| 01/12/2017 | 2.9 |
| 02/12/2017 | 2.7 |
| 02/12/2017 | 2.6 |
| 02/12/2017 | 2.6 |
| 02/12/2017 | 2.6 |
| 02/12/2017 | 2.6 |
| 02/12/2017 | 2.8 |
| 02/12/2017 | 3.1 |
| 02/12/2017 | 3.5 |
| 02/12/2017 | 3.9 |
| 02/12/2017 | 4.1 |
| 02/12/2017 | 4.2 |
| 02/12/2017 | 4.2 |
| 02/12/2017 | 4.1 |
| 02/12/2017 | 4.1 |
| 02/12/2017 | 4.1 |
| 02/12/2017 | 4.4 |
| 02/12/2017 | 4.6 |
| 02/12/2017 | 4.6 |
| 02/12/2017 | 4.4 |
| 02/12/2017 | 4.1 |
| 02/12/2017 | 3.7 |
| 02/12/2017 | 3.4 |
| 02/12/2017 | 3.1 |
| 02/12/2017 | 2.8 |
| 03/12/2017 | 2.6 |
| 03/12/2017 | 2.5 |
| 03/12/2017 | 2.5 |
| 03/12/2017 | 2.5 |
| 03/12/2017 | 2.5 |
| 03/12/2017 | 2.6 |
| 03/12/2017 | 2.8 |
| 03/12/2017 | 3.1 |
| 03/12/2017 | 3.3 |
| 03/12/2017 | 3.6 |
| 03/12/2017 | 3.7 |
| 03/12/2017 | 3.8 |
| 03/12/2017 | 3.7 |
| 03/12/2017 | 3.7 |
| 03/12/2017 | 3.8 |
| 03/12/2017 | 4.1 |
| 03/12/2017 | 4.3 |
| 03/12/2017 | 4.3 |
| 03/12/2017 | 4.2 |
| 03/12/2017 | 3.9 |
| 03/12/2017 | 3.6 |
| 03/12/2017 | 3.4 |
| 03/12/2017 | 3.1 |
| 03/12/2017 | 2.8 |
| 04/12/2017 | 2.6 |
| 04/12/2017 | 2.6 |
| 04/12/2017 | 2.5 |
| 04/12/2017 | 2.6 |
| 04/12/2017 | 2.9 |
| 04/12/2017 | 3.6 |
| 04/12/2017 | 4.2 |
| 04/12/2017 | 4.6 |
| 04/12/2017 | 4.8 |
| 04/12/2017 | 4.9 |
| 04/12/2017 | 5 |
| 04/12/2017 | 5 |
| 04/12/2017 | 5 |
| 04/12/2017 | 5 |
| 04/12/2017 | 5.1 |
| 04/12/2017 | 5.4 |
| 04/12/2017 | 5.6 |
| 04/12/2017 | 5.5 |
| 04/12/2017 | 5.2 |
| 04/12/2017 | 4.7 |
| 04/12/2017 | 4.1 |
| 04/12/2017 | 3.7 |
| 04/12/2017 | 3.3 |
| 04/12/2017 | 3 |
| 05/12/2017 | 2.7 |
| 05/12/2017 | 2.6 |
| 05/12/2017 | 2.6 |
| 05/12/2017 | 2.7 |
| 05/12/2017 | 3 |
| 05/12/2017 | 3.6 |
| 05/12/2017 | 4.3 |
| 05/12/2017 | 4.7 |
| 05/12/2017 | 4.8 |
| 05/12/2017 | 5 |
| 05/12/2017 | 5 |
| 05/12/2017 | 5.1 |
| 05/12/2017 | 5 |
| 05/12/2017 | 5 |
| 05/12/2017 | 5.1 |
| 05/12/2017 | 5.5 |
| 05/12/2017 | 5.7 |
| 05/12/2017 | 5.5 |
| 05/12/2017 | 5.3 |
| 05/12/2017 | 4.7 |
| 05/12/2017 | 4.2 |
| 05/12/2017 | 3.7 |
| 05/12/2017 | 3.3 |
| 05/12/2017 | 3 |
| 06/12/2017 | 2.8 |
| 06/12/2017 | 2.7 |
| 06/12/2017 | 2.6 |
| 06/12/2017 | 2.7 |
| 06/12/2017 | 3 |
| 06/12/2017 | 3.7 |
| 06/12/2017 | 4.3 |
| 06/12/2017 | 4.7 |
| 06/12/2017 | 4.9 |
| 06/12/2017 | 5 |
| 06/12/2017 | 5.1 |
| 06/12/2017 | 5.1 |
| 06/12/2017 | 5.1 |
| 06/12/2017 | 5 |
| 06/12/2017 | 5.1 |
| 06/12/2017 | 5.5 |
| 06/12/2017 | 5.6 |
| 06/12/2017 | 5.5 |
| 06/12/2017 | 5.3 |
| 06/12/2017 | 4.7 |
| 06/12/2017 | 4.2 |
| 06/12/2017 | 3.7 |
| 06/12/2017 | 3.3 |
| 06/12/2017 | 3 |
| 07/12/2017 | 2.8 |
| 07/12/2017 | 2.7 |
| 07/12/2017 | 2.6 |
| 07/12/2017 | 2.7 |
| 07/12/2017 | 3 |
| 07/12/2017 | 3.6 |
| 07/12/2017 | 4.3 |
| 07/12/2017 | 4.7 |
| 07/12/2017 | 4.8 |
| 07/12/2017 | 5 |
| 07/12/2017 | 5 |
| 07/12/2017 | 5.1 |
| 07/12/2017 | 5 |
| 07/12/2017 | 5 |
| 07/12/2017 | 5.1 |
| 07/12/2017 | 5.4 |
| 07/12/2017 | 5.6 |
| 07/12/2017 | 5.5 |
| 07/12/2017 | 5.2 |
| 07/12/2017 | 4.7 |
| 07/12/2017 | 4.1 |
| 07/12/2017 | 3.7 |
| 07/12/2017 | 3.3 |
| 07/12/2017 | 3 |
| 08/12/2017 | 2.8 |
| 08/12/2017 | 2.7 |
| 08/12/2017 | 2.6 |
| 08/12/2017 | 2.7 |
| 08/12/2017 | 3 |
| 08/12/2017 | 3.6 |
| 08/12/2017 | 4.3 |
| 08/12/2017 | 4.6 |
| 08/12/2017 | 4.8 |
| 08/12/2017 | 5 |
| 08/12/2017 | 5 |
| 08/12/2017 | 5 |
| 08/12/2017 | 4.9 |
| 08/12/2017 | 4.9 |
| 08/12/2017 | 5 |
| 08/12/2017 | 5.3 |
| 08/12/2017 | 5.4 |
| 08/12/2017 | 5.3 |
| 08/12/2017 | 5 |
| 08/12/2017 | 4.5 |
| 08/12/2017 | 4 |
| 08/12/2017 | 3.6 |
| 08/12/2017 | 3.3 |
| 08/12/2017 | 3 |
| 09/12/2017 | 2.8 |
| 09/12/2017 | 2.6 |
| 09/12/2017 | 2.6 |
| 09/12/2017 | 2.6 |
| 09/12/2017 | 2.6 |
| 09/12/2017 | 2.8 |
| 09/12/2017 | 3.1 |
| 09/12/2017 | 3.5 |
| 09/12/2017 | 3.8 |
| 09/12/2017 | 4.1 |
| 09/12/2017 | 4.2 |
| 09/12/2017 | 4.2 |
| 09/12/2017 | 4.1 |
| 09/12/2017 | 4 |
| 09/12/2017 | 4.1 |
| 09/12/2017 | 4.4 |
| 09/12/2017 | 4.6 |
| 09/12/2017 | 4.6 |
| 09/12/2017 | 4.4 |
| 09/12/2017 | 4 |
| 09/12/2017 | 3.6 |
| 09/12/2017 | 3.4 |
| 09/12/2017 | 3.1 |
| 09/12/2017 | 2.8 |
| 10/12/2017 | 2.7 |
| 10/12/2017 | 2.6 |
| 10/12/2017 | 2.5 |
| 10/12/2017 | 2.5 |
| 10/12/2017 | 2.5 |
| 10/12/2017 | 2.6 |
| 10/12/2017 | 2.8 |
| 10/12/2017 | 3 |
| 10/12/2017 | 3.3 |
| 10/12/2017 | 3.5 |
| 10/12/2017 | 3.7 |
| 10/12/2017 | 3.8 |
| 10/12/2017 | 3.7 |
| 10/12/2017 | 3.7 |
| 10/12/2017 | 3.7 |
| 10/12/2017 | 4.1 |
| 10/12/2017 | 4.2 |
| 10/12/2017 | 4.3 |
| 10/12/2017 | 4.1 |
| 10/12/2017 | 3.9 |
| 10/12/2017 | 3.6 |
| 10/12/2017 | 3.4 |
| 10/12/2017 | 3.1 |
| 10/12/2017 | 2.9 |
| 11/12/2017 | 2.6 |
| 11/12/2017 | 2.6 |
| 11/12/2017 | 2.5 |
| 11/12/2017 | 2.6 |
| 11/12/2017 | 2.9 |
| 11/12/2017 | 3.6 |
| 11/12/2017 | 4.2 |
| 11/12/2017 | 4.6 |
| 11/12/2017 | 4.7 |
| 11/12/2017 | 4.9 |
| 11/12/2017 | 5 |
| 11/12/2017 | 5 |
| 11/12/2017 | 5 |
| 11/12/2017 | 5 |
| 11/12/2017 | 5.1 |
| 11/12/2017 | 5.4 |
| 11/12/2017 | 5.5 |
| 11/12/2017 | 5.5 |
| 11/12/2017 | 5.2 |
| 11/12/2017 | 4.7 |
| 11/12/2017 | 4.1 |
| 11/12/2017 | 3.7 |
| 11/12/2017 | 3.3 |
| 11/12/2017 | 3 |
| 12/12/2017 | 2.7 |
| 12/12/2017 | 2.6 |
| 12/12/2017 | 2.6 |
| 12/12/2017 | 2.7 |
| 12/12/2017 | 3 |
| 12/12/2017 | 3.6 |
| 12/12/2017 | 4.3 |
| 12/12/2017 | 4.6 |
| 12/12/2017 | 4.8 |
| 12/12/2017 | 4.9 |
| 12/12/2017 | 5 |
| 12/12/2017 | 5 |
| 12/12/2017 | 5 |
| 12/12/2017 | 5 |
| 12/12/2017 | 5.1 |
| 12/12/2017 | 5.5 |
| 12/12/2017 | 5.6 |
| 12/12/2017 | 5.5 |
| 12/12/2017 | 5.3 |
| 12/12/2017 | 4.7 |
| 12/12/2017 | 4.2 |
| 12/12/2017 | 3.7 |
| 12/12/2017 | 3.3 |
| 12/12/2017 | 3 |
| 13/12/2017 | 2.8 |
| 13/12/2017 | 2.7 |
| 13/12/2017 | 2.6 |
| 13/12/2017 | 2.7 |
| 13/12/2017 | 3 |
| 13/12/2017 | 3.6 |
| 13/12/2017 | 4.3 |
| 13/12/2017 | 4.6 |
| 13/12/2017 | 4.8 |
| 13/12/2017 | 5 |
| 13/12/2017 | 5 |
| 13/12/2017 | 5.1 |
| 13/12/2017 | 5 |
| 13/12/2017 | 5 |
| 13/12/2017 | 5.1 |
| 13/12/2017 | 5.5 |
| 13/12/2017 | 5.6 |
| 13/12/2017 | 5.5 |
| 13/12/2017 | 5.3 |
| 13/12/2017 | 4.7 |
| 13/12/2017 | 4.2 |
| 13/12/2017 | 3.7 |
| 13/12/2017 | 3.3 |
| 13/12/2017 | 3 |
| 14/12/2017 | 2.8 |
| 14/12/2017 | 2.7 |
| 14/12/2017 | 2.6 |
| 14/12/2017 | 2.7 |
| 14/12/2017 | 3 |
| 14/12/2017 | 3.6 |
| 14/12/2017 | 4.3 |
| 14/12/2017 | 4.6 |
| 14/12/2017 | 4.8 |
| 14/12/2017 | 4.9 |
| 14/12/2017 | 5 |
| 14/12/2017 | 5 |
| 14/12/2017 | 5 |
| 14/12/2017 | 5 |
| 14/12/2017 | 5.1 |
| 14/12/2017 | 5.4 |
| 14/12/2017 | 5.5 |
| 14/12/2017 | 5.4 |
| 14/12/2017 | 5.2 |
| 14/12/2017 | 4.7 |
| 14/12/2017 | 4.1 |
| 14/12/2017 | 3.7 |
| 14/12/2017 | 3.3 |
| 14/12/2017 | 3 |
| 15/12/2017 | 2.8 |
| 15/12/2017 | 2.7 |
| 15/12/2017 | 2.6 |
| 15/12/2017 | 2.7 |
| 15/12/2017 | 3 |
| 15/12/2017 | 3.6 |
| 15/12/2017 | 4.2 |
| 15/12/2017 | 4.6 |
| 15/12/2017 | 4.8 |
| 15/12/2017 | 4.9 |
| 15/12/2017 | 5 |
| 15/12/2017 | 5 |
| 15/12/2017 | 4.9 |
| 15/12/2017 | 4.9 |
| 15/12/2017 | 5 |
| 15/12/2017 | 5.3 |
| 15/12/2017 | 5.4 |
| 15/12/2017 | 5.3 |
| 15/12/2017 | 5 |
| 15/12/2017 | 4.5 |
| 15/12/2017 | 4 |
| 15/12/2017 | 3.6 |
| 15/12/2017 | 3.3 |
| 15/12/2017 | 3 |
| 16/12/2017 | 2.8 |
| 16/12/2017 | 2.6 |
| 16/12/2017 | 2.6 |
| 16/12/2017 | 2.6 |
| 16/12/2017 | 2.6 |
| 16/12/2017 | 2.8 |
| 16/12/2017 | 3.1 |
| 16/12/2017 | 3.4 |
| 16/12/2017 | 3.8 |
| 16/12/2017 | 4 |
| 16/12/2017 | 4.1 |
| 16/12/2017 | 4.2 |
| 16/12/2017 | 4.1 |
| 16/12/2017 | 4 |
| 16/12/2017 | 4.1 |
| 16/12/2017 | 4.4 |
| 16/12/2017 | 4.5 |
| 16/12/2017 | 4.5 |
| 16/12/2017 | 4.4 |
| 16/12/2017 | 4 |
| 16/12/2017 | 3.6 |
| 16/12/2017 | 3.4 |
| 16/12/2017 | 3.1 |
| 16/12/2017 | 2.8 |
| 17/12/2017 | 2.7 |
| 17/12/2017 | 2.6 |
| 17/12/2017 | 2.5 |
| 17/12/2017 | 2.5 |
| 17/12/2017 | 2.5 |
| 17/12/2017 | 2.6 |
| 17/12/2017 | 2.7 |
| 17/12/2017 | 3 |
| 17/12/2017 | 3.3 |
| 17/12/2017 | 3.5 |
| 17/12/2017 | 3.7 |
| 17/12/2017 | 3.8 |
| 17/12/2017 | 3.7 |
| 17/12/2017 | 3.7 |
| 17/12/2017 | 3.7 |
| 17/12/2017 | 4 |
| 17/12/2017 | 4.2 |
| 17/12/2017 | 4.3 |
| 17/12/2017 | 4.1 |
| 17/12/2017 | 3.9 |
| 17/12/2017 | 3.6 |
| 17/12/2017 | 3.4 |
| 17/12/2017 | 3.1 |
| 17/12/2017 | 2.9 |
| 18/12/2017 | 2.7 |
| 18/12/2017 | 2.6 |
| 18/12/2017 | 2.5 |
| 18/12/2017 | 2.6 |
| 18/12/2017 | 2.9 |
| 18/12/2017 | 3.5 |
| 18/12/2017 | 4.2 |
| 18/12/2017 | 4.5 |
| 18/12/2017 | 4.7 |
| 18/12/2017 | 4.8 |
| 18/12/2017 | 4.9 |
| 18/12/2017 | 5 |
| 18/12/2017 | 4.9 |
| 18/12/2017 | 4.9 |
| 18/12/2017 | 5 |
| 18/12/2017 | 5.4 |
| 18/12/2017 | 5.5 |
| 18/12/2017 | 5.4 |
| 18/12/2017 | 5.2 |
| 18/12/2017 | 4.6 |
| 18/12/2017 | 4.1 |
| 18/12/2017 | 3.7 |
| 18/12/2017 | 3.3 |
| 18/12/2017 | 3 |
| 19/12/2017 | 2.8 |
| 19/12/2017 | 2.6 |
| 19/12/2017 | 2.6 |
| 19/12/2017 | 2.7 |
| 19/12/2017 | 3 |
| 19/12/2017 | 3.6 |
| 19/12/2017 | 4.2 |
| 19/12/2017 | 4.6 |
| 19/12/2017 | 4.7 |
| 19/12/2017 | 4.9 |
| 19/12/2017 | 5 |
| 19/12/2017 | 5 |
| 19/12/2017 | 5 |
| 19/12/2017 | 5 |
| 19/12/2017 | 5.1 |
| 19/12/2017 | 5.4 |
| 19/12/2017 | 5.5 |
| 19/12/2017 | 5.5 |
| 19/12/2017 | 5.2 |
| 19/12/2017 | 4.7 |
| 19/12/2017 | 4.2 |
| 19/12/2017 | 3.7 |
| 19/12/2017 | 3.3 |
| 19/12/2017 | 3 |
| 20/12/2017 | 2.8 |
| 20/12/2017 | 2.7 |
| 20/12/2017 | 2.6 |
| 20/12/2017 | 2.7 |
| 20/12/2017 | 3 |
| 20/12/2017 | 3.6 |
| 20/12/2017 | 4.2 |
| 20/12/2017 | 4.6 |
| 20/12/2017 | 4.8 |
| 20/12/2017 | 4.9 |
| 20/12/2017 | 5 |
| 20/12/2017 | 5 |
| 20/12/2017 | 5 |
| 20/12/2017 | 5 |
| 20/12/2017 | 5.1 |
| 20/12/2017 | 5.4 |
| 20/12/2017 | 5.5 |
| 20/12/2017 | 5.5 |
| 20/12/2017 | 5.2 |
| 20/12/2017 | 4.7 |
| 20/12/2017 | 4.1 |
| 20/12/2017 | 3.7 |
| 20/12/2017 | 3.3 |
| 20/12/2017 | 3 |
| 21/12/2017 | 2.8 |
| 21/12/2017 | 2.7 |
| 21/12/2017 | 2.6 |
| 21/12/2017 | 2.7 |
| 21/12/2017 | 3 |
| 21/12/2017 | 3.6 |
| 21/12/2017 | 4.2 |
| 21/12/2017 | 4.6 |
| 21/12/2017 | 4.7 |
| 21/12/2017 | 4.9 |
| 21/12/2017 | 5 |
| 21/12/2017 | 5 |
| 21/12/2017 | 4.9 |
| 21/12/2017 | 5 |
| 21/12/2017 | 5.1 |
| 21/12/2017 | 5.4 |
| 21/12/2017 | 5.4 |
| 21/12/2017 | 5.4 |
| 21/12/2017 | 5.2 |
| 21/12/2017 | 4.6 |
| 21/12/2017 | 4.1 |
| 21/12/2017 | 3.7 |
| 21/12/2017 | 3.3 |
| 21/12/2017 | 3 |
| 22/12/2017 | 2.8 |
| 22/12/2017 | 2.7 |
| 22/12/2017 | 2.6 |
| 22/12/2017 | 2.7 |
| 22/12/2017 | 2.9 |
| 22/12/2017 | 3.4 |
| 22/12/2017 | 4 |
| 22/12/2017 | 4.4 |
| 22/12/2017 | 4.6 |
| 22/12/2017 | 4.8 |
| 22/12/2017 | 4.9 |
| 22/12/2017 | 4.9 |
| 22/12/2017 | 4.8 |
| 22/12/2017 | 4.7 |
| 22/12/2017 | 4.8 |
| 22/12/2017 | 5.1 |
| 22/12/2017 | 5.2 |
| 22/12/2017 | 5.1 |
| 22/12/2017 | 4.9 |
| 22/12/2017 | 4.3 |
| 22/12/2017 | 3.9 |
| 22/12/2017 | 3.6 |
| 22/12/2017 | 3.2 |
| 22/12/2017 | 3 |
| 23/12/2017 | 2.8 |
| 23/12/2017 | 2.6 |
| 23/12/2017 | 2.6 |
| 23/12/2017 | 2.5 |
| 23/12/2017 | 2.6 |
| 23/12/2017 | 2.6 |
| 23/12/2017 | 2.9 |
| 23/12/2017 | 3.3 |
| 23/12/2017 | 3.6 |
| 23/12/2017 | 3.9 |
| 23/12/2017 | 4 |
| 23/12/2017 | 4.1 |
| 23/12/2017 | 3.9 |
| 23/12/2017 | 3.9 |
| 23/12/2017 | 4 |
| 23/12/2017 | 4.2 |
| 23/12/2017 | 4.3 |
| 23/12/2017 | 4.4 |
| 23/12/2017 | 4.2 |
| 23/12/2017 | 3.9 |
| 23/12/2017 | 3.5 |
| 23/12/2017 | 3.3 |
| 23/12/2017 | 3.1 |
| 23/12/2017 | 2.9 |
| 24/12/2017 | 2.7 |
| 24/12/2017 | 2.6 |
| 24/12/2017 | 2.5 |
| 24/12/2017 | 2.4 |
| 24/12/2017 | 2.4 |
| 24/12/2017 | 2.4 |
| 24/12/2017 | 2.6 |
| 24/12/2017 | 2.9 |
| 24/12/2017 | 3.2 |
| 24/12/2017 | 3.4 |
| 24/12/2017 | 3.6 |
| 24/12/2017 | 3.7 |
| 24/12/2017 | 3.6 |
| 24/12/2017 | 3.5 |
| 24/12/2017 | 3.6 |
| 24/12/2017 | 3.9 |
| 24/12/2017 | 4 |
| 24/12/2017 | 4.1 |
| 24/12/2017 | 4 |
| 24/12/2017 | 3.7 |
| 24/12/2017 | 3.5 |
| 24/12/2017 | 3.4 |
| 24/12/2017 | 3.1 |
| 24/12/2017 | 2.7 |
| 25/12/2017 | 2.5 |
| 25/12/2017 | 2.4 |
| 25/12/2017 | 2.4 |
| 25/12/2017 | 2.4 |
| 25/12/2017 | 2.4 |
| 25/12/2017 | 2.5 |
| 25/12/2017 | 2.6 |
| 25/12/2017 | 2.8 |
| 25/12/2017 | 3.1 |
| 25/12/2017 | 3.3 |
| 25/12/2017 | 3.6 |
| 25/12/2017 | 3.6 |
| 25/12/2017 | 3.4 |
| 25/12/2017 | 3.3 |
| 25/12/2017 | 3.3 |
| 25/12/2017 | 3.5 |
| 25/12/2017 | 3.7 |
| 25/12/2017 | 3.7 |
| 25/12/2017 | 3.6 |
| 25/12/2017 | 3.4 |
| 25/12/2017 | 3.3 |
| 25/12/2017 | 3.1 |
| 25/12/2017 | 2.9 |
| 25/12/2017 | 2.7 |
| 26/12/2017 | 2.5 |
| 26/12/2017 | 2.4 |
| 26/12/2017 | 2.4 |
| 26/12/2017 | 2.4 |
| 26/12/2017 | 2.4 |
| 26/12/2017 | 2.5 |
| 26/12/2017 | 2.6 |
| 26/12/2017 | 2.8 |
| 26/12/2017 | 3.1 |
| 26/12/2017 | 3.3 |
| 26/12/2017 | 3.6 |
| 26/12/2017 | 3.6 |
| 26/12/2017 | 3.4 |
| 26/12/2017 | 3.3 |
| 26/12/2017 | 3.3 |
| 26/12/2017 | 3.5 |
| 26/12/2017 | 3.6 |
| 26/12/2017 | 3.7 |
| 26/12/2017 | 3.6 |
| 26/12/2017 | 3.4 |
| 26/12/2017 | 3.3 |
| 26/12/2017 | 3.1 |
| 26/12/2017 | 2.9 |
| 26/12/2017 | 2.9 |
| 27/12/2017 | 2.6 |
| 27/12/2017 | 2.5 |
| 27/12/2017 | 2.5 |
| 27/12/2017 | 2.5 |
| 27/12/2017 | 2.7 |
| 27/12/2017 | 3 |
| 27/12/2017 | 3.3 |
| 27/12/2017 | 3.7 |
| 27/12/2017 | 3.9 |
| 27/12/2017 | 4.1 |
| 27/12/2017 | 4.2 |
| 27/12/2017 | 4.3 |
| 27/12/2017 | 4.2 |
| 27/12/2017 | 4.2 |
| 27/12/2017 | 4.2 |
| 27/12/2017 | 4.6 |
| 27/12/2017 | 4.7 |
| 27/12/2017 | 4.7 |
| 27/12/2017 | 4.6 |
| 27/12/2017 | 4.2 |
| 27/12/2017 | 3.8 |
| 27/12/2017 | 3.5 |
| 27/12/2017 | 3.2 |
| 27/12/2017 | 2.9 |
| 28/12/2017 | 2.6 |
| 28/12/2017 | 2.5 |
| 28/12/2017 | 2.5 |
| 28/12/2017 | 2.5 |
| 28/12/2017 | 2.7 |
| 28/12/2017 | 2.9 |
| 28/12/2017 | 3.3 |
| 28/12/2017 | 3.6 |
| 28/12/2017 | 3.9 |
| 28/12/2017 | 4.1 |
| 28/12/2017 | 4.2 |
| 28/12/2017 | 4.3 |
| 28/12/2017 | 4.2 |
| 28/12/2017 | 4.2 |
| 28/12/2017 | 4.2 |
| 28/12/2017 | 4.6 |
| 28/12/2017 | 4.7 |
| 28/12/2017 | 4.7 |
| 28/12/2017 | 4.6 |
| 28/12/2017 | 4.2 |
| 28/12/2017 | 3.8 |
| 28/12/2017 | 3.5 |
| 28/12/2017 | 3.2 |
| 28/12/2017 | 2.9 |
| 29/12/2017 | 2.6 |
| 29/12/2017 | 2.5 |
| 29/12/2017 | 2.5 |
| 29/12/2017 | 2.5 |
| 29/12/2017 | 2.7 |
| 29/12/2017 | 2.9 |
| 29/12/2017 | 3.3 |
| 29/12/2017 | 3.6 |
| 29/12/2017 | 3.9 |
| 29/12/2017 | 4.1 |
| 29/12/2017 | 4.2 |
| 29/12/2017 | 4.3 |
| 29/12/2017 | 4.2 |
| 29/12/2017 | 4.2 |
| 29/12/2017 | 4.2 |
| 29/12/2017 | 4.6 |
| 29/12/2017 | 4.7 |
| 29/12/2017 | 4.7 |
| 29/12/2017 | 4.6 |
| 29/12/2017 | 4.2 |
| 29/12/2017 | 3.8 |
| 29/12/2017 | 3.5 |
| 29/12/2017 | 3.2 |
| 29/12/2017 | 2.9 |
| 30/12/2017 | 2.6 |
| 30/12/2017 | 2.5 |
| 30/12/2017 | 2.5 |
| 30/12/2017 | 2.5 |
| 30/12/2017 | 2.7 |
| 30/12/2017 | 2.9 |
| 30/12/2017 | 3.3 |
| 30/12/2017 | 3.6 |
| 30/12/2017 | 3.9 |
| 30/12/2017 | 4.1 |
| 30/12/2017 | 4.2 |
| 30/12/2017 | 4.3 |
| 30/12/2017 | 4.2 |
| 30/12/2017 | 4.2 |
| 30/12/2017 | 4.2 |
| 30/12/2017 | 4.6 |
| 30/12/2017 | 4.7 |
| 30/12/2017 | 4.7 |
| 30/12/2017 | 4.6 |
| 30/12/2017 | 4.2 |
| 30/12/2017 | 3.8 |
| 30/12/2017 | 3.5 |
| 30/12/2017 | 3.2 |
| 30/12/2017 | 3 |
| 31/12/2017 | 2.7 |
| 31/12/2017 | 2.6 |
| 31/12/2017 | 2.5 |
| 31/12/2017 | 2.5 |
| 31/12/2017 | 2.6 |
| 31/12/2017 | 2.7 |
| 31/12/2017 | 2.9 |
| 31/12/2017 | 3.3 |
| 31/12/2017 | 3.6 |
| 31/12/2017 | 3.9 |
| 31/12/2017 | 4.1 |
| 31/12/2017 | 4.1 |
| 31/12/2017 | 4.1 |
| 31/12/2017 | 4 |
| 31/12/2017 | 4.1 |
| 31/12/2017 | 4.3 |
| 31/12/2017 | 4.4 |
| 31/12/2017 | 4.2 |
| 31/12/2017 | 4 |
| 31/12/2017 | 3.6 |
| 31/12/2017 | 3.3 |
| 31/12/2017 | 3.2 |
| 31/12/2017 | 3 |